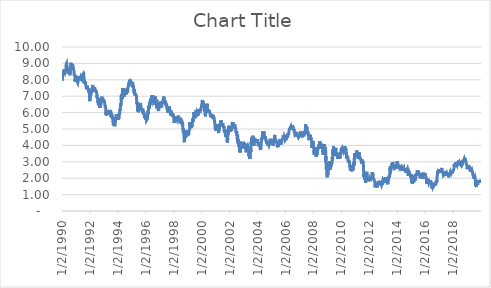
| Category | Series 0 |
|---|---|
| 12/31/19 | 1.918 |
| 12/30/19 | 1.879 |
| 12/27/19 | 1.875 |
| 12/26/19 | 1.894 |
| 12/24/19 | 1.9 |
| 12/23/19 | 1.929 |
| 12/20/19 | 1.917 |
| 12/19/19 | 1.92 |
| 12/18/19 | 1.917 |
| 12/17/19 | 1.88 |
| 12/16/19 | 1.871 |
| 12/13/19 | 1.823 |
| 12/12/19 | 1.892 |
| 12/11/19 | 1.791 |
| 12/10/19 | 1.842 |
| 12/9/19 | 1.819 |
| 12/6/19 | 1.836 |
| 12/5/19 | 1.81 |
| 12/4/19 | 1.774 |
| 12/3/19 | 1.716 |
| 12/2/19 | 1.819 |
| 11/29/19 | 1.776 |
| 11/27/19 | 1.765 |
| 11/26/19 | 1.741 |
| 11/25/19 | 1.755 |
| 11/22/19 | 1.771 |
| 11/21/19 | 1.772 |
| 11/20/19 | 1.745 |
| 11/19/19 | 1.783 |
| 11/18/19 | 1.815 |
| 11/15/19 | 1.831 |
| 11/14/19 | 1.819 |
| 11/13/19 | 1.886 |
| 11/12/19 | 1.935 |
| 11/8/19 | 1.942 |
| 11/7/19 | 1.917 |
| 11/6/19 | 1.828 |
| 11/5/19 | 1.858 |
| 11/4/19 | 1.777 |
| 11/1/19 | 1.71 |
| 10/31/19 | 1.691 |
| 10/30/19 | 1.772 |
| 10/29/19 | 1.838 |
| 10/28/19 | 1.842 |
| 10/25/19 | 1.794 |
| 10/24/19 | 1.766 |
| 10/23/19 | 1.764 |
| 10/22/19 | 1.761 |
| 10/21/19 | 1.799 |
| 10/18/19 | 1.754 |
| 10/17/19 | 1.752 |
| 10/16/19 | 1.74 |
| 10/15/19 | 1.771 |
| 10/11/19 | 1.729 |
| 10/10/19 | 1.668 |
| 10/9/19 | 1.584 |
| 10/8/19 | 1.529 |
| 10/7/19 | 1.558 |
| 10/4/19 | 1.529 |
| 10/3/19 | 1.534 |
| 10/2/19 | 1.599 |
| 10/1/19 | 1.635 |
| 9/30/19 | 1.665 |
| 9/27/19 | 1.68 |
| 9/26/19 | 1.692 |
| 9/25/19 | 1.737 |
| 9/24/19 | 1.646 |
| 9/23/19 | 1.727 |
| 9/20/19 | 1.722 |
| 9/19/19 | 1.784 |
| 9/18/19 | 1.796 |
| 9/17/19 | 1.801 |
| 9/16/19 | 1.847 |
| 9/13/19 | 1.896 |
| 9/12/19 | 1.772 |
| 9/11/19 | 1.738 |
| 9/10/19 | 1.732 |
| 9/9/19 | 1.644 |
| 9/6/19 | 1.56 |
| 9/5/19 | 1.559 |
| 9/4/19 | 1.466 |
| 9/3/19 | 1.457 |
| 8/30/19 | 1.496 |
| 8/29/19 | 1.494 |
| 8/28/19 | 1.479 |
| 8/27/19 | 1.471 |
| 8/26/19 | 1.535 |
| 8/23/19 | 1.535 |
| 8/22/19 | 1.613 |
| 8/21/19 | 1.589 |
| 8/20/19 | 1.556 |
| 8/19/19 | 1.606 |
| 8/16/19 | 1.554 |
| 8/15/19 | 1.527 |
| 8/14/19 | 1.579 |
| 8/13/19 | 1.704 |
| 8/12/19 | 1.645 |
| 8/9/19 | 1.745 |
| 8/8/19 | 1.717 |
| 8/7/19 | 1.734 |
| 8/6/19 | 1.702 |
| 8/5/19 | 1.708 |
| 8/2/19 | 1.845 |
| 8/1/19 | 1.894 |
| 7/31/19 | 2.014 |
| 7/30/19 | 2.058 |
| 7/29/19 | 2.065 |
| 7/26/19 | 2.07 |
| 7/25/19 | 2.081 |
| 7/24/19 | 2.043 |
| 7/23/19 | 2.081 |
| 7/22/19 | 2.046 |
| 7/19/19 | 2.055 |
| 7/18/19 | 2.024 |
| 7/17/19 | 2.045 |
| 7/16/19 | 2.103 |
| 7/15/19 | 2.089 |
| 7/12/19 | 2.122 |
| 7/11/19 | 2.138 |
| 7/10/19 | 2.061 |
| 7/9/19 | 2.065 |
| 7/8/19 | 2.048 |
| 7/5/19 | 2.034 |
| 7/3/19 | 1.95 |
| 7/2/19 | 1.974 |
| 7/1/19 | 2.024 |
| 6/28/19 | 2.005 |
| 6/27/19 | 2.014 |
| 6/26/19 | 2.047 |
| 6/25/19 | 1.985 |
| 6/24/19 | 2.014 |
| 6/21/19 | 2.054 |
| 6/20/19 | 2.028 |
| 6/19/19 | 2.023 |
| 6/18/19 | 2.06 |
| 6/17/19 | 2.094 |
| 6/14/19 | 2.08 |
| 6/13/19 | 2.094 |
| 6/12/19 | 2.12 |
| 6/11/19 | 2.143 |
| 6/10/19 | 2.148 |
| 6/7/19 | 2.081 |
| 6/6/19 | 2.117 |
| 6/5/19 | 2.135 |
| 6/4/19 | 2.13 |
| 6/3/19 | 2.071 |
| 5/31/19 | 2.125 |
| 5/30/19 | 2.213 |
| 5/29/19 | 2.26 |
| 5/28/19 | 2.266 |
| 5/24/19 | 2.32 |
| 5/23/19 | 2.318 |
| 5/22/19 | 2.382 |
| 5/21/19 | 2.426 |
| 5/20/19 | 2.416 |
| 5/17/19 | 2.391 |
| 5/16/19 | 2.394 |
| 5/15/19 | 2.373 |
| 5/14/19 | 2.41 |
| 5/13/19 | 2.402 |
| 5/10/19 | 2.467 |
| 5/9/19 | 2.442 |
| 5/8/19 | 2.484 |
| 5/7/19 | 2.457 |
| 5/6/19 | 2.469 |
| 5/3/19 | 2.525 |
| 5/2/19 | 2.541 |
| 5/1/19 | 2.5 |
| 4/30/19 | 2.502 |
| 4/29/19 | 2.525 |
| 4/26/19 | 2.498 |
| 4/25/19 | 2.532 |
| 4/24/19 | 2.518 |
| 4/23/19 | 2.565 |
| 4/22/19 | 2.588 |
| 4/18/19 | 2.56 |
| 4/17/19 | 2.594 |
| 4/16/19 | 2.59 |
| 4/15/19 | 2.554 |
| 4/12/19 | 2.565 |
| 4/11/19 | 2.497 |
| 4/10/19 | 2.465 |
| 4/9/19 | 2.501 |
| 4/8/19 | 2.522 |
| 4/5/19 | 2.495 |
| 4/4/19 | 2.515 |
| 4/3/19 | 2.524 |
| 4/2/19 | 2.474 |
| 4/1/19 | 2.501 |
| 3/29/19 | 2.405 |
| 3/28/19 | 2.395 |
| 3/27/19 | 2.366 |
| 3/26/19 | 2.423 |
| 3/25/19 | 2.398 |
| 3/22/19 | 2.439 |
| 3/21/19 | 2.537 |
| 3/20/19 | 2.526 |
| 3/19/19 | 2.612 |
| 3/18/19 | 2.603 |
| 3/15/19 | 2.587 |
| 3/14/19 | 2.63 |
| 3/13/19 | 2.621 |
| 3/12/19 | 2.602 |
| 3/11/19 | 2.639 |
| 3/8/19 | 2.628 |
| 3/7/19 | 2.639 |
| 3/6/19 | 2.693 |
| 3/5/19 | 2.717 |
| 3/4/19 | 2.722 |
| 3/1/19 | 2.753 |
| 2/28/19 | 2.715 |
| 2/27/19 | 2.682 |
| 2/26/19 | 2.636 |
| 2/25/19 | 2.663 |
| 2/22/19 | 2.652 |
| 2/21/19 | 2.691 |
| 2/20/19 | 2.645 |
| 2/19/19 | 2.634 |
| 2/15/19 | 2.663 |
| 2/14/19 | 2.654 |
| 2/13/19 | 2.702 |
| 2/12/19 | 2.688 |
| 2/11/19 | 2.654 |
| 2/8/19 | 2.634 |
| 2/7/19 | 2.657 |
| 2/6/19 | 2.695 |
| 2/5/19 | 2.698 |
| 2/4/19 | 2.724 |
| 2/1/19 | 2.684 |
| 1/31/19 | 2.629 |
| 1/30/19 | 2.678 |
| 1/29/19 | 2.71 |
| 1/28/19 | 2.744 |
| 1/25/19 | 2.758 |
| 1/24/19 | 2.716 |
| 1/23/19 | 2.741 |
| 1/22/19 | 2.739 |
| 1/18/19 | 2.784 |
| 1/17/19 | 2.75 |
| 1/16/19 | 2.722 |
| 1/15/19 | 2.711 |
| 1/14/19 | 2.702 |
| 1/11/19 | 2.701 |
| 1/10/19 | 2.742 |
| 1/9/19 | 2.71 |
| 1/8/19 | 2.728 |
| 1/7/19 | 2.696 |
| 1/4/19 | 2.668 |
| 1/3/19 | 2.554 |
| 1/2/19 | 2.62 |
| 12/31/18 | 2.684 |
| 12/28/18 | 2.718 |
| 12/27/18 | 2.767 |
| 12/26/18 | 2.808 |
| 12/24/18 | 2.738 |
| 12/21/18 | 2.79 |
| 12/20/18 | 2.806 |
| 12/19/18 | 2.755 |
| 12/18/18 | 2.818 |
| 12/17/18 | 2.857 |
| 12/14/18 | 2.89 |
| 12/13/18 | 2.913 |
| 12/12/18 | 2.91 |
| 12/11/18 | 2.879 |
| 12/10/18 | 2.858 |
| 12/7/18 | 2.845 |
| 12/6/18 | 2.896 |
| 12/5/18 | 2.914 |
| 12/4/18 | 2.914 |
| 12/3/18 | 2.97 |
| 11/30/18 | 2.988 |
| 11/29/18 | 3.03 |
| 11/28/18 | 3.059 |
| 11/27/18 | 3.057 |
| 11/26/18 | 3.054 |
| 11/23/18 | 3.039 |
| 11/21/18 | 3.063 |
| 11/20/18 | 3.063 |
| 11/19/18 | 3.063 |
| 11/16/18 | 3.063 |
| 11/15/18 | 3.11 |
| 11/14/18 | 3.125 |
| 11/13/18 | 3.14 |
| 11/9/18 | 3.182 |
| 11/8/18 | 3.237 |
| 11/7/18 | 3.236 |
| 11/6/18 | 3.228 |
| 11/5/18 | 3.201 |
| 11/2/18 | 3.212 |
| 11/1/18 | 3.13 |
| 10/31/18 | 3.144 |
| 10/30/18 | 3.123 |
| 10/29/18 | 3.085 |
| 10/26/18 | 3.076 |
| 10/25/18 | 3.117 |
| 10/24/18 | 3.104 |
| 10/23/18 | 3.168 |
| 10/22/18 | 3.198 |
| 10/19/18 | 3.192 |
| 10/18/18 | 3.179 |
| 10/17/18 | 3.205 |
| 10/16/18 | 3.163 |
| 10/15/18 | 3.156 |
| 10/12/18 | 3.161 |
| 10/11/18 | 3.15 |
| 10/10/18 | 3.163 |
| 10/9/18 | 3.206 |
| 10/5/18 | 3.233 |
| 10/4/18 | 3.187 |
| 10/3/18 | 3.181 |
| 10/2/18 | 3.063 |
| 10/1/18 | 3.084 |
| 9/28/18 | 3.061 |
| 9/27/18 | 3.052 |
| 9/26/18 | 3.048 |
| 9/25/18 | 3.096 |
| 9/24/18 | 3.089 |
| 9/21/18 | 3.063 |
| 9/20/18 | 3.063 |
| 9/19/18 | 3.063 |
| 9/18/18 | 3.055 |
| 9/17/18 | 2.987 |
| 9/14/18 | 2.996 |
| 9/13/18 | 2.97 |
| 9/12/18 | 2.963 |
| 9/11/18 | 2.976 |
| 9/10/18 | 2.931 |
| 9/7/18 | 2.939 |
| 9/6/18 | 2.873 |
| 9/5/18 | 2.902 |
| 9/4/18 | 2.898 |
| 8/31/18 | 2.86 |
| 8/30/18 | 2.855 |
| 8/29/18 | 2.884 |
| 8/28/18 | 2.88 |
| 8/27/18 | 2.846 |
| 8/24/18 | 2.81 |
| 8/23/18 | 2.826 |
| 8/22/18 | 2.819 |
| 8/21/18 | 2.83 |
| 8/20/18 | 2.819 |
| 8/17/18 | 2.86 |
| 8/16/18 | 2.866 |
| 8/15/18 | 2.862 |
| 8/14/18 | 2.898 |
| 8/13/18 | 2.879 |
| 8/10/18 | 2.873 |
| 8/9/18 | 2.926 |
| 8/8/18 | 2.96 |
| 8/7/18 | 2.973 |
| 8/6/18 | 2.94 |
| 8/3/18 | 2.949 |
| 8/2/18 | 2.986 |
| 8/1/18 | 3.006 |
| 7/31/18 | 2.96 |
| 7/30/18 | 2.973 |
| 7/27/18 | 2.954 |
| 7/26/18 | 2.976 |
| 7/25/18 | 2.975 |
| 7/24/18 | 2.949 |
| 7/23/18 | 2.954 |
| 7/20/18 | 2.893 |
| 7/19/18 | 2.838 |
| 7/18/18 | 2.869 |
| 7/17/18 | 2.86 |
| 7/16/18 | 2.858 |
| 7/13/18 | 2.827 |
| 7/12/18 | 2.845 |
| 7/11/18 | 2.849 |
| 7/10/18 | 2.849 |
| 7/9/18 | 2.856 |
| 7/6/18 | 2.822 |
| 7/5/18 | 2.829 |
| 7/3/18 | 2.831 |
| 7/2/18 | 2.871 |
| 6/29/18 | 2.86 |
| 6/28/18 | 2.836 |
| 6/27/18 | 2.826 |
| 6/26/18 | 2.877 |
| 6/25/18 | 2.88 |
| 6/22/18 | 2.895 |
| 6/21/18 | 2.897 |
| 6/20/18 | 2.939 |
| 6/19/18 | 2.897 |
| 6/18/18 | 2.917 |
| 6/15/18 | 2.92 |
| 6/14/18 | 2.935 |
| 6/13/18 | 2.966 |
| 6/12/18 | 2.961 |
| 6/11/18 | 2.952 |
| 6/8/18 | 2.946 |
| 6/7/18 | 2.92 |
| 6/6/18 | 2.972 |
| 6/5/18 | 2.928 |
| 6/4/18 | 2.942 |
| 6/1/18 | 2.902 |
| 5/31/18 | 2.859 |
| 5/30/18 | 2.855 |
| 5/29/18 | 2.781 |
| 5/25/18 | 2.931 |
| 5/24/18 | 2.977 |
| 5/23/18 | 2.994 |
| 5/22/18 | 3.06 |
| 5/21/18 | 3.06 |
| 5/18/18 | 3.056 |
| 5/17/18 | 3.111 |
| 5/16/18 | 3.096 |
| 5/15/18 | 3.072 |
| 5/14/18 | 3.002 |
| 5/11/18 | 2.97 |
| 5/10/18 | 2.962 |
| 5/9/18 | 3.004 |
| 5/8/18 | 2.976 |
| 5/7/18 | 2.95 |
| 5/4/18 | 2.95 |
| 5/3/18 | 2.946 |
| 5/2/18 | 2.966 |
| 5/1/18 | 2.964 |
| 4/30/18 | 2.953 |
| 4/27/18 | 2.957 |
| 4/26/18 | 2.981 |
| 4/25/18 | 3.026 |
| 4/24/18 | 3 |
| 4/23/18 | 2.975 |
| 4/20/18 | 2.96 |
| 4/19/18 | 2.91 |
| 4/18/18 | 2.873 |
| 4/17/18 | 2.828 |
| 4/16/18 | 2.827 |
| 4/13/18 | 2.827 |
| 4/12/18 | 2.836 |
| 4/11/18 | 2.781 |
| 4/10/18 | 2.801 |
| 4/9/18 | 2.779 |
| 4/6/18 | 2.774 |
| 4/5/18 | 2.832 |
| 4/4/18 | 2.803 |
| 4/3/18 | 2.775 |
| 4/2/18 | 2.73 |
| 3/29/18 | 2.739 |
| 3/28/18 | 2.781 |
| 3/27/18 | 2.775 |
| 3/26/18 | 2.852 |
| 3/23/18 | 2.814 |
| 3/22/18 | 2.824 |
| 3/21/18 | 2.883 |
| 3/20/18 | 2.896 |
| 3/19/18 | 2.856 |
| 3/16/18 | 2.844 |
| 3/15/18 | 2.828 |
| 3/14/18 | 2.817 |
| 3/13/18 | 2.843 |
| 3/12/18 | 2.868 |
| 3/9/18 | 2.894 |
| 3/8/18 | 2.857 |
| 3/7/18 | 2.883 |
| 3/6/18 | 2.886 |
| 3/5/18 | 2.881 |
| 3/2/18 | 2.864 |
| 3/1/18 | 2.808 |
| 2/28/18 | 2.861 |
| 2/27/18 | 2.893 |
| 2/26/18 | 2.862 |
| 2/23/18 | 2.866 |
| 2/22/18 | 2.921 |
| 2/21/18 | 2.95 |
| 2/20/18 | 2.89 |
| 2/16/18 | 2.875 |
| 2/15/18 | 2.91 |
| 2/14/18 | 2.902 |
| 2/13/18 | 2.829 |
| 2/12/18 | 2.858 |
| 2/9/18 | 2.851 |
| 2/8/18 | 2.824 |
| 2/7/18 | 2.836 |
| 2/6/18 | 2.802 |
| 2/5/18 | 2.706 |
| 2/2/18 | 2.841 |
| 2/1/18 | 2.79 |
| 1/31/18 | 2.705 |
| 1/30/18 | 2.72 |
| 1/29/18 | 2.694 |
| 1/26/18 | 2.66 |
| 1/25/18 | 2.617 |
| 1/24/18 | 2.646 |
| 1/23/18 | 2.613 |
| 1/22/18 | 2.65 |
| 1/19/18 | 2.659 |
| 1/18/18 | 2.626 |
| 1/17/18 | 2.59 |
| 1/16/18 | 2.537 |
| 1/12/18 | 2.546 |
| 1/11/18 | 2.537 |
| 1/10/18 | 2.557 |
| 1/9/18 | 2.553 |
| 1/8/18 | 2.48 |
| 1/5/18 | 2.476 |
| 1/4/18 | 2.452 |
| 1/3/18 | 2.447 |
| 1/2/18 | 2.463 |
| 12/29/17 | 2.405 |
| 12/28/17 | 2.43 |
| 12/27/17 | 2.411 |
| 12/26/17 | 2.476 |
| 12/22/17 | 2.481 |
| 12/21/17 | 2.483 |
| 12/20/17 | 2.497 |
| 12/19/17 | 2.464 |
| 12/18/17 | 2.394 |
| 12/15/17 | 2.353 |
| 12/14/17 | 2.349 |
| 12/13/17 | 2.342 |
| 12/12/17 | 2.401 |
| 12/11/17 | 2.389 |
| 12/8/17 | 2.376 |
| 12/7/17 | 2.363 |
| 12/6/17 | 2.338 |
| 12/5/17 | 2.351 |
| 12/4/17 | 2.372 |
| 12/1/17 | 2.362 |
| 11/30/17 | 2.41 |
| 11/29/17 | 2.388 |
| 11/28/17 | 2.328 |
| 11/27/17 | 2.328 |
| 11/24/17 | 2.342 |
| 11/22/17 | 2.319 |
| 11/21/17 | 2.356 |
| 11/20/17 | 2.367 |
| 11/17/17 | 2.344 |
| 11/16/17 | 2.375 |
| 11/15/17 | 2.322 |
| 11/14/17 | 2.372 |
| 11/13/17 | 2.406 |
| 11/10/17 | 2.398 |
| 11/9/17 | 2.342 |
| 11/8/17 | 2.334 |
| 11/7/17 | 2.314 |
| 11/6/17 | 2.316 |
| 11/3/17 | 2.332 |
| 11/2/17 | 2.345 |
| 11/1/17 | 2.372 |
| 10/31/17 | 2.379 |
| 10/30/17 | 2.368 |
| 10/27/17 | 2.406 |
| 10/26/17 | 2.461 |
| 10/25/17 | 2.432 |
| 10/24/17 | 2.419 |
| 10/23/17 | 2.366 |
| 10/20/17 | 2.384 |
| 10/19/17 | 2.318 |
| 10/18/17 | 2.346 |
| 10/17/17 | 2.3 |
| 10/16/17 | 2.303 |
| 10/13/17 | 2.273 |
| 10/12/17 | 2.318 |
| 10/11/17 | 2.348 |
| 10/10/17 | 2.361 |
| 10/6/17 | 2.359 |
| 10/5/17 | 2.348 |
| 10/4/17 | 2.323 |
| 10/3/17 | 2.323 |
| 10/2/17 | 2.341 |
| 9/29/17 | 2.334 |
| 9/28/17 | 2.308 |
| 9/27/17 | 2.31 |
| 9/26/17 | 2.236 |
| 9/25/17 | 2.22 |
| 9/22/17 | 2.25 |
| 9/21/17 | 2.276 |
| 9/20/17 | 2.268 |
| 9/19/17 | 2.245 |
| 9/18/17 | 2.229 |
| 9/15/17 | 2.202 |
| 9/14/17 | 2.185 |
| 9/13/17 | 2.188 |
| 9/12/17 | 2.167 |
| 9/11/17 | 2.131 |
| 9/8/17 | 2.051 |
| 9/7/17 | 2.039 |
| 9/6/17 | 2.105 |
| 9/5/17 | 2.06 |
| 9/1/17 | 2.166 |
| 8/31/17 | 2.117 |
| 8/30/17 | 2.131 |
| 8/29/17 | 2.129 |
| 8/28/17 | 2.157 |
| 8/25/17 | 2.166 |
| 8/24/17 | 2.194 |
| 8/23/17 | 2.166 |
| 8/22/17 | 2.213 |
| 8/21/17 | 2.182 |
| 8/18/17 | 2.194 |
| 8/17/17 | 2.185 |
| 8/16/17 | 2.222 |
| 8/15/17 | 2.273 |
| 8/14/17 | 2.218 |
| 8/11/17 | 2.189 |
| 8/10/17 | 2.198 |
| 8/9/17 | 2.248 |
| 8/8/17 | 2.262 |
| 8/7/17 | 2.253 |
| 8/4/17 | 2.262 |
| 8/3/17 | 2.221 |
| 8/2/17 | 2.271 |
| 8/1/17 | 2.253 |
| 7/31/17 | 2.294 |
| 7/28/17 | 2.289 |
| 7/27/17 | 2.31 |
| 7/26/17 | 2.287 |
| 7/25/17 | 2.335 |
| 7/24/17 | 2.255 |
| 7/21/17 | 2.238 |
| 7/20/17 | 2.259 |
| 7/19/17 | 2.27 |
| 7/18/17 | 2.259 |
| 7/17/17 | 2.314 |
| 7/14/17 | 2.332 |
| 7/13/17 | 2.344 |
| 7/12/17 | 2.318 |
| 7/11/17 | 2.36 |
| 7/10/17 | 2.373 |
| 7/7/17 | 2.386 |
| 7/6/17 | 2.366 |
| 7/5/17 | 2.323 |
| 7/3/17 | 2.35 |
| 6/30/17 | 2.304 |
| 6/29/17 | 2.267 |
| 6/28/17 | 2.228 |
| 6/27/17 | 2.205 |
| 6/26/17 | 2.137 |
| 6/23/17 | 2.142 |
| 6/22/17 | 2.148 |
| 6/21/17 | 2.163 |
| 6/20/17 | 2.156 |
| 6/19/17 | 2.188 |
| 6/16/17 | 2.151 |
| 6/15/17 | 2.164 |
| 6/14/17 | 2.126 |
| 6/13/17 | 2.211 |
| 6/12/17 | 2.214 |
| 6/9/17 | 2.2 |
| 6/8/17 | 2.188 |
| 6/7/17 | 2.173 |
| 6/6/17 | 2.145 |
| 6/5/17 | 2.182 |
| 6/2/17 | 2.159 |
| 6/1/17 | 2.211 |
| 5/31/17 | 2.203 |
| 5/30/17 | 2.21 |
| 5/26/17 | 2.246 |
| 5/25/17 | 2.255 |
| 5/24/17 | 2.25 |
| 5/23/17 | 2.28 |
| 5/22/17 | 2.254 |
| 5/19/17 | 2.235 |
| 5/18/17 | 2.229 |
| 5/17/17 | 2.224 |
| 5/16/17 | 2.326 |
| 5/15/17 | 2.343 |
| 5/12/17 | 2.326 |
| 5/11/17 | 2.387 |
| 5/10/17 | 2.414 |
| 5/9/17 | 2.398 |
| 5/8/17 | 2.387 |
| 5/5/17 | 2.349 |
| 5/4/17 | 2.354 |
| 5/3/17 | 2.318 |
| 5/2/17 | 2.28 |
| 5/1/17 | 2.318 |
| 4/28/17 | 2.28 |
| 4/27/17 | 2.295 |
| 4/26/17 | 2.304 |
| 4/25/17 | 2.332 |
| 4/24/17 | 2.273 |
| 4/21/17 | 2.248 |
| 4/20/17 | 2.232 |
| 4/19/17 | 2.214 |
| 4/18/17 | 2.168 |
| 4/17/17 | 2.25 |
| 4/13/17 | 2.237 |
| 4/12/17 | 2.239 |
| 4/11/17 | 2.296 |
| 4/10/17 | 2.366 |
| 4/7/17 | 2.382 |
| 4/6/17 | 2.341 |
| 4/5/17 | 2.335 |
| 4/4/17 | 2.36 |
| 4/3/17 | 2.319 |
| 3/31/17 | 2.387 |
| 3/30/17 | 2.42 |
| 3/29/17 | 2.376 |
| 3/28/17 | 2.418 |
| 3/27/17 | 2.378 |
| 3/24/17 | 2.412 |
| 3/23/17 | 2.419 |
| 3/22/17 | 2.405 |
| 3/21/17 | 2.418 |
| 3/20/17 | 2.461 |
| 3/17/17 | 2.5 |
| 3/16/17 | 2.54 |
| 3/15/17 | 2.493 |
| 3/14/17 | 2.6 |
| 3/13/17 | 2.626 |
| 3/10/17 | 2.574 |
| 3/9/17 | 2.605 |
| 3/8/17 | 2.56 |
| 3/7/17 | 2.518 |
| 3/6/17 | 2.5 |
| 3/3/17 | 2.478 |
| 3/2/17 | 2.478 |
| 3/1/17 | 2.453 |
| 2/28/17 | 2.39 |
| 2/27/17 | 2.365 |
| 2/24/17 | 2.312 |
| 2/23/17 | 2.372 |
| 2/22/17 | 2.413 |
| 2/21/17 | 2.429 |
| 2/17/17 | 2.415 |
| 2/16/17 | 2.447 |
| 2/15/17 | 2.493 |
| 2/14/17 | 2.47 |
| 2/13/17 | 2.436 |
| 2/10/17 | 2.407 |
| 2/9/17 | 2.395 |
| 2/8/17 | 2.336 |
| 2/7/17 | 2.393 |
| 2/6/17 | 2.408 |
| 2/3/17 | 2.465 |
| 2/2/17 | 2.474 |
| 2/1/17 | 2.47 |
| 1/31/17 | 2.453 |
| 1/30/17 | 2.488 |
| 1/27/17 | 2.484 |
| 1/26/17 | 2.504 |
| 1/25/17 | 2.512 |
| 1/24/17 | 2.465 |
| 1/23/17 | 2.397 |
| 1/20/17 | 2.467 |
| 1/19/17 | 2.474 |
| 1/18/17 | 2.43 |
| 1/17/17 | 2.325 |
| 1/13/17 | 2.396 |
| 1/12/17 | 2.363 |
| 1/11/17 | 2.372 |
| 1/10/17 | 2.376 |
| 1/9/17 | 2.365 |
| 1/6/17 | 2.419 |
| 1/5/17 | 2.344 |
| 1/4/17 | 2.439 |
| 1/3/17 | 2.444 |
| 12/30/16 | 2.444 |
| 12/29/16 | 2.475 |
| 12/28/16 | 2.508 |
| 12/27/16 | 2.56 |
| 12/23/16 | 2.537 |
| 12/22/16 | 2.552 |
| 12/21/16 | 2.535 |
| 12/20/16 | 2.559 |
| 12/19/16 | 2.538 |
| 12/16/16 | 2.592 |
| 12/15/16 | 2.597 |
| 12/14/16 | 2.571 |
| 12/13/16 | 2.471 |
| 12/12/16 | 2.471 |
| 12/9/16 | 2.468 |
| 12/8/16 | 2.407 |
| 12/7/16 | 2.34 |
| 12/6/16 | 2.389 |
| 12/5/16 | 2.394 |
| 12/2/16 | 2.383 |
| 12/1/16 | 2.448 |
| 11/30/16 | 2.381 |
| 11/29/16 | 2.291 |
| 11/28/16 | 2.312 |
| 11/25/16 | 2.357 |
| 11/23/16 | 2.35 |
| 11/22/16 | 2.312 |
| 11/21/16 | 2.315 |
| 11/18/16 | 2.355 |
| 11/17/16 | 2.303 |
| 11/16/16 | 2.222 |
| 11/15/16 | 2.219 |
| 11/14/16 | 2.261 |
| 11/10/16 | 2.15 |
| 11/9/16 | 2.057 |
| 11/8/16 | 1.855 |
| 11/7/16 | 1.826 |
| 11/4/16 | 1.776 |
| 11/3/16 | 1.812 |
| 11/2/16 | 1.802 |
| 11/1/16 | 1.827 |
| 10/31/16 | 1.826 |
| 10/28/16 | 1.847 |
| 10/27/16 | 1.854 |
| 10/26/16 | 1.793 |
| 10/25/16 | 1.756 |
| 10/24/16 | 1.765 |
| 10/21/16 | 1.735 |
| 10/20/16 | 1.756 |
| 10/19/16 | 1.743 |
| 10/18/16 | 1.738 |
| 10/17/16 | 1.766 |
| 10/14/16 | 1.798 |
| 10/13/16 | 1.741 |
| 10/12/16 | 1.769 |
| 10/11/16 | 1.764 |
| 10/7/16 | 1.718 |
| 10/6/16 | 1.737 |
| 10/5/16 | 1.702 |
| 10/4/16 | 1.686 |
| 10/3/16 | 1.622 |
| 9/30/16 | 1.594 |
| 9/29/16 | 1.56 |
| 9/28/16 | 1.572 |
| 9/27/16 | 1.556 |
| 9/26/16 | 1.584 |
| 9/23/16 | 1.618 |
| 9/22/16 | 1.618 |
| 9/21/16 | 1.651 |
| 9/20/16 | 1.689 |
| 9/19/16 | 1.712 |
| 9/16/16 | 1.693 |
| 9/15/16 | 1.691 |
| 9/14/16 | 1.698 |
| 9/13/16 | 1.727 |
| 9/12/16 | 1.663 |
| 9/9/16 | 1.675 |
| 9/8/16 | 1.599 |
| 9/7/16 | 1.539 |
| 9/6/16 | 1.534 |
| 9/2/16 | 1.602 |
| 9/1/16 | 1.568 |
| 8/31/16 | 1.58 |
| 8/30/16 | 1.566 |
| 8/29/16 | 1.56 |
| 8/26/16 | 1.63 |
| 8/25/16 | 1.573 |
| 8/24/16 | 1.561 |
| 8/23/16 | 1.546 |
| 8/22/16 | 1.542 |
| 8/19/16 | 1.578 |
| 8/18/16 | 1.536 |
| 8/17/16 | 1.549 |
| 8/16/16 | 1.575 |
| 8/15/16 | 1.558 |
| 8/12/16 | 1.514 |
| 8/11/16 | 1.559 |
| 8/10/16 | 1.507 |
| 8/9/16 | 1.547 |
| 8/8/16 | 1.592 |
| 8/5/16 | 1.588 |
| 8/4/16 | 1.501 |
| 8/3/16 | 1.542 |
| 8/2/16 | 1.556 |
| 8/1/16 | 1.521 |
| 7/29/16 | 1.453 |
| 7/28/16 | 1.504 |
| 7/27/16 | 1.498 |
| 7/26/16 | 1.561 |
| 7/25/16 | 1.573 |
| 7/22/16 | 1.566 |
| 7/21/16 | 1.556 |
| 7/20/16 | 1.58 |
| 7/19/16 | 1.553 |
| 7/18/16 | 1.582 |
| 7/15/16 | 1.551 |
| 7/14/16 | 1.536 |
| 7/13/16 | 1.474 |
| 7/12/16 | 1.51 |
| 7/11/16 | 1.43 |
| 7/8/16 | 1.358 |
| 7/7/16 | 1.385 |
| 7/6/16 | 1.368 |
| 7/5/16 | 1.375 |
| 7/1/16 | 1.444 |
| 6/30/16 | 1.47 |
| 6/29/16 | 1.516 |
| 6/28/16 | 1.466 |
| 6/27/16 | 1.438 |
| 6/24/16 | 1.56 |
| 6/23/16 | 1.746 |
| 6/22/16 | 1.685 |
| 6/21/16 | 1.706 |
| 6/20/16 | 1.689 |
| 6/17/16 | 1.608 |
| 6/16/16 | 1.579 |
| 6/15/16 | 1.572 |
| 6/14/16 | 1.613 |
| 6/13/16 | 1.61 |
| 6/10/16 | 1.64 |
| 6/9/16 | 1.687 |
| 6/8/16 | 1.702 |
| 6/7/16 | 1.718 |
| 6/6/16 | 1.737 |
| 6/3/16 | 1.7 |
| 6/2/16 | 1.799 |
| 6/1/16 | 1.835 |
| 5/31/16 | 1.846 |
| 5/27/16 | 1.851 |
| 5/26/16 | 1.828 |
| 5/25/16 | 1.866 |
| 5/24/16 | 1.863 |
| 5/23/16 | 1.835 |
| 5/20/16 | 1.838 |
| 5/19/16 | 1.849 |
| 5/18/16 | 1.854 |
| 5/17/16 | 1.772 |
| 5/16/16 | 1.753 |
| 5/13/16 | 1.7 |
| 5/12/16 | 1.752 |
| 5/11/16 | 1.737 |
| 5/10/16 | 1.761 |
| 5/9/16 | 1.751 |
| 5/6/16 | 1.779 |
| 5/5/16 | 1.745 |
| 5/4/16 | 1.775 |
| 5/3/16 | 1.796 |
| 5/2/16 | 1.872 |
| 4/29/16 | 1.833 |
| 4/28/16 | 1.824 |
| 4/27/16 | 1.851 |
| 4/26/16 | 1.927 |
| 4/25/16 | 1.913 |
| 4/22/16 | 1.888 |
| 4/21/16 | 1.861 |
| 4/20/16 | 1.845 |
| 4/19/16 | 1.785 |
| 4/18/16 | 1.771 |
| 4/15/16 | 1.752 |
| 4/14/16 | 1.792 |
| 4/13/16 | 1.764 |
| 4/12/16 | 1.776 |
| 4/11/16 | 1.725 |
| 4/8/16 | 1.717 |
| 4/7/16 | 1.689 |
| 4/6/16 | 1.755 |
| 4/5/16 | 1.72 |
| 4/4/16 | 1.762 |
| 4/1/16 | 1.77 |
| 3/31/16 | 1.769 |
| 3/30/16 | 1.823 |
| 3/29/16 | 1.804 |
| 3/28/16 | 1.886 |
| 3/24/16 | 1.9 |
| 3/23/16 | 1.879 |
| 3/22/16 | 1.94 |
| 3/21/16 | 1.916 |
| 3/18/16 | 1.873 |
| 3/17/16 | 1.896 |
| 3/16/16 | 1.908 |
| 3/15/16 | 1.97 |
| 3/14/16 | 1.959 |
| 3/11/16 | 1.984 |
| 3/10/16 | 1.932 |
| 3/9/16 | 1.876 |
| 3/8/16 | 1.829 |
| 3/7/16 | 1.906 |
| 3/4/16 | 1.874 |
| 3/3/16 | 1.834 |
| 3/2/16 | 1.841 |
| 3/1/16 | 1.825 |
| 2/29/16 | 1.735 |
| 2/26/16 | 1.762 |
| 2/25/16 | 1.716 |
| 2/24/16 | 1.748 |
| 2/23/16 | 1.722 |
| 2/22/16 | 1.752 |
| 2/19/16 | 1.745 |
| 2/18/16 | 1.74 |
| 2/17/16 | 1.819 |
| 2/16/16 | 1.772 |
| 2/12/16 | 1.748 |
| 2/11/16 | 1.659 |
| 2/10/16 | 1.668 |
| 2/9/16 | 1.726 |
| 2/8/16 | 1.748 |
| 2/5/16 | 1.836 |
| 2/4/16 | 1.84 |
| 2/3/16 | 1.886 |
| 2/2/16 | 1.845 |
| 2/1/16 | 1.949 |
| 1/29/16 | 1.921 |
| 1/28/16 | 1.978 |
| 1/27/16 | 1.999 |
| 1/26/16 | 1.994 |
| 1/25/16 | 2.001 |
| 1/22/16 | 2.052 |
| 1/21/16 | 2.031 |
| 1/20/16 | 1.982 |
| 1/19/16 | 2.056 |
| 1/15/16 | 2.035 |
| 1/14/16 | 2.087 |
| 1/13/16 | 2.093 |
| 1/12/16 | 2.103 |
| 1/11/16 | 2.175 |
| 1/8/16 | 2.116 |
| 1/7/16 | 2.146 |
| 1/6/16 | 2.17 |
| 1/5/16 | 2.236 |
| 1/4/16 | 2.243 |
| 12/31/15 | 2.269 |
| 12/30/15 | 2.294 |
| 12/29/15 | 2.305 |
| 12/28/15 | 2.23 |
| 12/24/15 | 2.241 |
| 12/23/15 | 2.253 |
| 12/22/15 | 2.236 |
| 12/21/15 | 2.192 |
| 12/18/15 | 2.204 |
| 12/17/15 | 2.223 |
| 12/16/15 | 2.296 |
| 12/15/15 | 2.266 |
| 12/14/15 | 2.222 |
| 12/11/15 | 2.127 |
| 12/10/15 | 2.23 |
| 12/9/15 | 2.216 |
| 12/8/15 | 2.218 |
| 12/7/15 | 2.229 |
| 12/4/15 | 2.269 |
| 12/3/15 | 2.314 |
| 12/2/15 | 2.18 |
| 12/1/15 | 2.143 |
| 11/30/15 | 2.206 |
| 11/27/15 | 2.22 |
| 11/25/15 | 2.234 |
| 11/24/15 | 2.238 |
| 11/23/15 | 2.238 |
| 11/20/15 | 2.262 |
| 11/19/15 | 2.248 |
| 11/18/15 | 2.273 |
| 11/17/15 | 2.266 |
| 11/16/15 | 2.268 |
| 11/13/15 | 2.266 |
| 11/12/15 | 2.312 |
| 11/10/15 | 2.342 |
| 11/9/15 | 2.344 |
| 11/6/15 | 2.325 |
| 11/5/15 | 2.232 |
| 11/4/15 | 2.225 |
| 11/3/15 | 2.21 |
| 11/2/15 | 2.171 |
| 10/30/15 | 2.142 |
| 10/29/15 | 2.172 |
| 10/28/15 | 2.101 |
| 10/27/15 | 2.037 |
| 10/26/15 | 2.056 |
| 10/23/15 | 2.087 |
| 10/22/15 | 2.026 |
| 10/21/15 | 2.023 |
| 10/20/15 | 2.067 |
| 10/19/15 | 2.023 |
| 10/16/15 | 2.033 |
| 10/15/15 | 2.018 |
| 10/14/15 | 1.972 |
| 10/13/15 | 2.044 |
| 10/9/15 | 2.088 |
| 10/8/15 | 2.104 |
| 10/7/15 | 2.067 |
| 10/6/15 | 2.031 |
| 10/5/15 | 2.056 |
| 10/2/15 | 1.993 |
| 10/1/15 | 2.037 |
| 9/30/15 | 2.037 |
| 9/29/15 | 2.051 |
| 9/28/15 | 2.095 |
| 9/25/15 | 2.162 |
| 9/24/15 | 2.127 |
| 9/23/15 | 2.15 |
| 9/22/15 | 2.134 |
| 9/21/15 | 2.201 |
| 9/18/15 | 2.134 |
| 9/17/15 | 2.19 |
| 9/16/15 | 2.294 |
| 9/15/15 | 2.287 |
| 9/14/15 | 2.183 |
| 9/11/15 | 2.188 |
| 9/10/15 | 2.222 |
| 9/9/15 | 2.201 |
| 9/8/15 | 2.183 |
| 9/4/15 | 2.124 |
| 9/3/15 | 2.16 |
| 9/2/15 | 2.184 |
| 9/1/15 | 2.152 |
| 8/31/15 | 2.218 |
| 8/28/15 | 2.181 |
| 8/27/15 | 2.184 |
| 8/26/15 | 2.175 |
| 8/25/15 | 2.071 |
| 8/24/15 | 2.003 |
| 8/21/15 | 2.037 |
| 8/20/15 | 2.068 |
| 8/19/15 | 2.126 |
| 8/18/15 | 2.192 |
| 8/17/15 | 2.168 |
| 8/14/15 | 2.198 |
| 8/13/15 | 2.185 |
| 8/12/15 | 2.148 |
| 8/11/15 | 2.141 |
| 8/10/15 | 2.227 |
| 8/7/15 | 2.162 |
| 8/6/15 | 2.221 |
| 8/5/15 | 2.27 |
| 8/4/15 | 2.221 |
| 8/3/15 | 2.148 |
| 7/31/15 | 2.18 |
| 7/30/15 | 2.259 |
| 7/29/15 | 2.286 |
| 7/28/15 | 2.25 |
| 7/27/15 | 2.218 |
| 7/24/15 | 2.262 |
| 7/23/15 | 2.268 |
| 7/22/15 | 2.324 |
| 7/21/15 | 2.325 |
| 7/20/15 | 2.372 |
| 7/17/15 | 2.347 |
| 7/16/15 | 2.35 |
| 7/15/15 | 2.352 |
| 7/14/15 | 2.401 |
| 7/13/15 | 2.454 |
| 7/10/15 | 2.397 |
| 7/9/15 | 2.321 |
| 7/8/15 | 2.192 |
| 7/7/15 | 2.258 |
| 7/6/15 | 2.285 |
| 7/2/15 | 2.382 |
| 7/1/15 | 2.422 |
| 6/30/15 | 2.353 |
| 6/29/15 | 2.324 |
| 6/26/15 | 2.473 |
| 6/25/15 | 2.409 |
| 6/24/15 | 2.367 |
| 6/23/15 | 2.409 |
| 6/22/15 | 2.372 |
| 6/19/15 | 2.258 |
| 6/18/15 | 2.334 |
| 6/17/15 | 2.316 |
| 6/16/15 | 2.309 |
| 6/15/15 | 2.356 |
| 6/12/15 | 2.392 |
| 6/11/15 | 2.377 |
| 6/10/15 | 2.484 |
| 6/9/15 | 2.438 |
| 6/8/15 | 2.382 |
| 6/5/15 | 2.408 |
| 6/4/15 | 2.307 |
| 6/3/15 | 2.364 |
| 6/2/15 | 2.262 |
| 6/1/15 | 2.179 |
| 5/29/15 | 2.121 |
| 5/28/15 | 2.136 |
| 5/27/15 | 2.128 |
| 5/26/15 | 2.139 |
| 5/22/15 | 2.209 |
| 5/21/15 | 2.19 |
| 5/20/15 | 2.248 |
| 5/19/15 | 2.289 |
| 5/18/15 | 2.234 |
| 5/15/15 | 2.142 |
| 5/14/15 | 2.23 |
| 5/13/15 | 2.293 |
| 5/12/15 | 2.249 |
| 5/11/15 | 2.28 |
| 5/8/15 | 2.148 |
| 5/7/15 | 2.18 |
| 5/6/15 | 2.243 |
| 5/5/15 | 2.185 |
| 5/4/15 | 2.144 |
| 5/1/15 | 2.114 |
| 4/30/15 | 2.032 |
| 4/29/15 | 2.039 |
| 4/28/15 | 2.003 |
| 4/27/15 | 1.921 |
| 4/24/15 | 1.909 |
| 4/23/15 | 1.958 |
| 4/22/15 | 1.979 |
| 4/21/15 | 1.909 |
| 4/20/15 | 1.89 |
| 4/17/15 | 1.865 |
| 4/16/15 | 1.89 |
| 4/15/15 | 1.888 |
| 4/14/15 | 1.898 |
| 4/13/15 | 1.927 |
| 4/10/15 | 1.947 |
| 4/9/15 | 1.96 |
| 4/8/15 | 1.905 |
| 4/7/15 | 1.885 |
| 4/6/15 | 1.895 |
| 4/2/15 | 1.912 |
| 4/1/15 | 1.857 |
| 3/31/15 | 1.923 |
| 3/30/15 | 1.948 |
| 3/27/15 | 1.962 |
| 3/26/15 | 1.989 |
| 3/25/15 | 1.925 |
| 3/24/15 | 1.873 |
| 3/23/15 | 1.912 |
| 3/20/15 | 1.93 |
| 3/19/15 | 1.968 |
| 3/18/15 | 1.92 |
| 3/17/15 | 2.051 |
| 3/16/15 | 2.072 |
| 3/13/15 | 2.114 |
| 3/12/15 | 2.116 |
| 3/11/15 | 2.109 |
| 3/10/15 | 2.13 |
| 3/9/15 | 2.191 |
| 3/6/15 | 2.241 |
| 3/5/15 | 2.115 |
| 3/4/15 | 2.117 |
| 3/3/15 | 2.119 |
| 3/2/15 | 2.082 |
| 2/27/15 | 1.993 |
| 2/26/15 | 2.03 |
| 2/25/15 | 1.969 |
| 2/24/15 | 1.98 |
| 2/23/15 | 2.057 |
| 2/20/15 | 2.112 |
| 2/19/15 | 2.114 |
| 2/18/15 | 2.08 |
| 2/17/15 | 2.138 |
| 2/13/15 | 2.05 |
| 2/12/15 | 1.984 |
| 2/11/15 | 2.018 |
| 2/10/15 | 1.997 |
| 2/9/15 | 1.978 |
| 2/6/15 | 1.957 |
| 2/5/15 | 1.82 |
| 2/4/15 | 1.751 |
| 2/3/15 | 1.792 |
| 2/2/15 | 1.664 |
| 1/30/15 | 1.641 |
| 1/29/15 | 1.751 |
| 1/28/15 | 1.721 |
| 1/27/15 | 1.823 |
| 1/26/15 | 1.824 |
| 1/23/15 | 1.797 |
| 1/22/15 | 1.863 |
| 1/21/15 | 1.872 |
| 1/20/15 | 1.788 |
| 1/16/15 | 1.837 |
| 1/15/15 | 1.715 |
| 1/14/15 | 1.855 |
| 1/13/15 | 1.9 |
| 1/12/15 | 1.907 |
| 1/9/15 | 1.945 |
| 1/8/15 | 2.018 |
| 1/7/15 | 1.968 |
| 1/6/15 | 1.94 |
| 1/5/15 | 2.032 |
| 1/2/15 | 2.11 |
| 12/31/14 | 2.171 |
| 12/30/14 | 2.187 |
| 12/29/14 | 2.202 |
| 12/26/14 | 2.25 |
| 12/24/14 | 2.263 |
| 12/23/14 | 2.261 |
| 12/22/14 | 2.158 |
| 12/19/14 | 2.162 |
| 12/18/14 | 2.208 |
| 12/17/14 | 2.136 |
| 12/16/14 | 2.059 |
| 12/15/14 | 2.118 |
| 12/12/14 | 2.082 |
| 12/11/14 | 2.162 |
| 12/10/14 | 2.164 |
| 12/9/14 | 2.213 |
| 12/8/14 | 2.257 |
| 12/5/14 | 2.306 |
| 12/4/14 | 2.234 |
| 12/3/14 | 2.28 |
| 12/2/14 | 2.292 |
| 12/1/14 | 2.235 |
| 11/28/14 | 2.164 |
| 11/26/14 | 2.245 |
| 11/25/14 | 2.257 |
| 11/24/14 | 2.306 |
| 11/21/14 | 2.31 |
| 11/20/14 | 2.337 |
| 11/19/14 | 2.359 |
| 11/18/14 | 2.315 |
| 11/17/14 | 2.34 |
| 11/14/14 | 2.32 |
| 11/13/14 | 2.34 |
| 11/12/14 | 2.371 |
| 11/10/14 | 2.36 |
| 11/7/14 | 2.298 |
| 11/6/14 | 2.386 |
| 11/5/14 | 2.342 |
| 11/4/14 | 2.334 |
| 11/3/14 | 2.342 |
| 10/31/14 | 2.335 |
| 10/30/14 | 2.306 |
| 10/29/14 | 2.317 |
| 10/28/14 | 2.296 |
| 10/27/14 | 2.26 |
| 10/24/14 | 2.268 |
| 10/23/14 | 2.271 |
| 10/22/14 | 2.216 |
| 10/21/14 | 2.222 |
| 10/20/14 | 2.191 |
| 10/17/14 | 2.194 |
| 10/16/14 | 2.156 |
| 10/15/14 | 2.136 |
| 10/14/14 | 2.197 |
| 10/10/14 | 2.28 |
| 10/9/14 | 2.313 |
| 10/8/14 | 2.321 |
| 10/7/14 | 2.339 |
| 10/6/14 | 2.42 |
| 10/3/14 | 2.434 |
| 10/2/14 | 2.425 |
| 10/1/14 | 2.386 |
| 9/30/14 | 2.489 |
| 9/29/14 | 2.477 |
| 9/26/14 | 2.528 |
| 9/25/14 | 2.502 |
| 9/24/14 | 2.564 |
| 9/23/14 | 2.528 |
| 9/22/14 | 2.564 |
| 9/19/14 | 2.574 |
| 9/18/14 | 2.614 |
| 9/17/14 | 2.62 |
| 9/16/14 | 2.592 |
| 9/15/14 | 2.589 |
| 9/12/14 | 2.61 |
| 9/11/14 | 2.55 |
| 9/10/14 | 2.541 |
| 9/9/14 | 2.504 |
| 9/8/14 | 2.471 |
| 9/5/14 | 2.459 |
| 9/4/14 | 2.45 |
| 9/3/14 | 2.396 |
| 9/2/14 | 2.421 |
| 8/29/14 | 2.343 |
| 8/28/14 | 2.336 |
| 8/27/14 | 2.357 |
| 8/26/14 | 2.396 |
| 8/25/14 | 2.382 |
| 8/22/14 | 2.402 |
| 8/21/14 | 2.407 |
| 8/20/14 | 2.426 |
| 8/19/14 | 2.4 |
| 8/18/14 | 2.393 |
| 8/15/14 | 2.34 |
| 8/14/14 | 2.402 |
| 8/13/14 | 2.417 |
| 8/12/14 | 2.449 |
| 8/11/14 | 2.428 |
| 8/8/14 | 2.42 |
| 8/7/14 | 2.411 |
| 8/6/14 | 2.471 |
| 8/5/14 | 2.484 |
| 8/4/14 | 2.482 |
| 8/1/14 | 2.492 |
| 7/31/14 | 2.558 |
| 7/30/14 | 2.557 |
| 7/29/14 | 2.46 |
| 7/28/14 | 2.485 |
| 7/25/14 | 2.466 |
| 7/24/14 | 2.502 |
| 7/23/14 | 2.466 |
| 7/22/14 | 2.46 |
| 7/21/14 | 2.467 |
| 7/18/14 | 2.481 |
| 7/17/14 | 2.446 |
| 7/16/14 | 2.526 |
| 7/15/14 | 2.547 |
| 7/14/14 | 2.547 |
| 7/11/14 | 2.516 |
| 7/10/14 | 2.536 |
| 7/9/14 | 2.55 |
| 7/8/14 | 2.556 |
| 7/7/14 | 2.611 |
| 7/3/14 | 2.638 |
| 7/2/14 | 2.626 |
| 7/1/14 | 2.565 |
| 6/30/14 | 2.53 |
| 6/27/14 | 2.534 |
| 6/26/14 | 2.529 |
| 6/25/14 | 2.559 |
| 6/24/14 | 2.578 |
| 6/23/14 | 2.626 |
| 6/20/14 | 2.605 |
| 6/19/14 | 2.621 |
| 6/18/14 | 2.584 |
| 6/17/14 | 2.652 |
| 6/16/14 | 2.597 |
| 6/13/14 | 2.603 |
| 6/12/14 | 2.595 |
| 6/11/14 | 2.639 |
| 6/10/14 | 2.644 |
| 6/9/14 | 2.603 |
| 6/6/14 | 2.587 |
| 6/5/14 | 2.582 |
| 6/4/14 | 2.602 |
| 6/3/14 | 2.598 |
| 6/2/14 | 2.527 |
| 5/30/14 | 2.476 |
| 5/29/14 | 2.464 |
| 5/28/14 | 2.443 |
| 5/27/14 | 2.514 |
| 5/23/14 | 2.532 |
| 5/22/14 | 2.55 |
| 5/21/14 | 2.532 |
| 5/20/14 | 2.511 |
| 5/19/14 | 2.544 |
| 5/16/14 | 2.523 |
| 5/15/14 | 2.489 |
| 5/14/14 | 2.543 |
| 5/13/14 | 2.609 |
| 5/12/14 | 2.661 |
| 5/9/14 | 2.623 |
| 5/8/14 | 2.616 |
| 5/7/14 | 2.588 |
| 5/6/14 | 2.591 |
| 5/5/14 | 2.607 |
| 5/2/14 | 2.584 |
| 5/1/14 | 2.613 |
| 4/30/14 | 2.646 |
| 4/29/14 | 2.691 |
| 4/28/14 | 2.7 |
| 4/25/14 | 2.662 |
| 4/24/14 | 2.68 |
| 4/23/14 | 2.699 |
| 4/22/14 | 2.71 |
| 4/21/14 | 2.715 |
| 4/17/14 | 2.722 |
| 4/16/14 | 2.628 |
| 4/15/14 | 2.628 |
| 4/14/14 | 2.647 |
| 4/11/14 | 2.625 |
| 4/10/14 | 2.647 |
| 4/9/14 | 2.69 |
| 4/8/14 | 2.681 |
| 4/7/14 | 2.7 |
| 4/4/14 | 2.721 |
| 4/3/14 | 2.797 |
| 4/2/14 | 2.804 |
| 4/1/14 | 2.752 |
| 3/31/14 | 2.718 |
| 3/28/14 | 2.721 |
| 3/27/14 | 2.681 |
| 3/26/14 | 2.692 |
| 3/25/14 | 2.748 |
| 3/24/14 | 2.728 |
| 3/21/14 | 2.743 |
| 3/20/14 | 2.772 |
| 3/19/14 | 2.772 |
| 3/18/14 | 2.672 |
| 3/17/14 | 2.692 |
| 3/14/14 | 2.654 |
| 3/13/14 | 2.645 |
| 3/12/14 | 2.73 |
| 3/11/14 | 2.768 |
| 3/10/14 | 2.777 |
| 3/7/14 | 2.788 |
| 3/6/14 | 2.737 |
| 3/5/14 | 2.705 |
| 3/4/14 | 2.698 |
| 3/3/14 | 2.601 |
| 2/28/14 | 2.648 |
| 2/27/14 | 2.639 |
| 2/26/14 | 2.666 |
| 2/25/14 | 2.702 |
| 2/24/14 | 2.738 |
| 2/21/14 | 2.731 |
| 2/20/14 | 2.751 |
| 2/19/14 | 2.739 |
| 2/18/14 | 2.707 |
| 2/14/14 | 2.743 |
| 2/13/14 | 2.732 |
| 2/12/14 | 2.761 |
| 2/11/14 | 2.725 |
| 2/10/14 | 2.667 |
| 2/7/14 | 2.683 |
| 2/6/14 | 2.7 |
| 2/5/14 | 2.668 |
| 2/4/14 | 2.629 |
| 2/3/14 | 2.576 |
| 1/31/14 | 2.644 |
| 1/30/14 | 2.695 |
| 1/29/14 | 2.677 |
| 1/28/14 | 2.749 |
| 1/27/14 | 2.748 |
| 1/24/14 | 2.715 |
| 1/23/14 | 2.777 |
| 1/22/14 | 2.866 |
| 1/21/14 | 2.829 |
| 1/17/14 | 2.819 |
| 1/16/14 | 2.841 |
| 1/15/14 | 2.891 |
| 1/14/14 | 2.871 |
| 1/13/14 | 2.826 |
| 1/10/14 | 2.858 |
| 1/9/14 | 2.965 |
| 1/8/14 | 2.989 |
| 1/7/14 | 2.939 |
| 1/6/14 | 2.958 |
| 1/3/14 | 2.995 |
| 1/2/14 | 2.989 |
| 12/31/13 | 3.028 |
| 12/30/13 | 2.97 |
| 12/27/13 | 3 |
| 12/26/13 | 2.99 |
| 12/24/13 | 2.978 |
| 12/23/13 | 2.927 |
| 12/20/13 | 2.889 |
| 12/19/13 | 2.929 |
| 12/18/13 | 2.893 |
| 12/17/13 | 2.835 |
| 12/16/13 | 2.878 |
| 12/13/13 | 2.865 |
| 12/12/13 | 2.877 |
| 12/11/13 | 2.854 |
| 12/10/13 | 2.801 |
| 12/9/13 | 2.839 |
| 12/6/13 | 2.855 |
| 12/5/13 | 2.872 |
| 12/4/13 | 2.834 |
| 12/3/13 | 2.782 |
| 12/2/13 | 2.795 |
| 11/29/13 | 2.744 |
| 11/27/13 | 2.737 |
| 11/26/13 | 2.708 |
| 11/25/13 | 2.728 |
| 11/22/13 | 2.743 |
| 11/21/13 | 2.784 |
| 11/20/13 | 2.799 |
| 11/19/13 | 2.707 |
| 11/18/13 | 2.666 |
| 11/15/13 | 2.703 |
| 11/14/13 | 2.69 |
| 11/13/13 | 2.7 |
| 11/12/13 | 2.773 |
| 11/8/13 | 2.748 |
| 11/7/13 | 2.6 |
| 11/6/13 | 2.642 |
| 11/5/13 | 2.67 |
| 11/4/13 | 2.604 |
| 11/1/13 | 2.622 |
| 10/31/13 | 2.554 |
| 10/30/13 | 2.538 |
| 10/29/13 | 2.503 |
| 10/28/13 | 2.523 |
| 10/25/13 | 2.509 |
| 10/24/13 | 2.52 |
| 10/23/13 | 2.502 |
| 10/22/13 | 2.512 |
| 10/21/13 | 2.601 |
| 10/18/13 | 2.578 |
| 10/17/13 | 2.589 |
| 10/16/13 | 2.663 |
| 10/15/13 | 2.728 |
| 10/11/13 | 2.687 |
| 10/10/13 | 2.681 |
| 10/9/13 | 2.663 |
| 10/8/13 | 2.632 |
| 10/7/13 | 2.626 |
| 10/4/13 | 2.645 |
| 10/3/13 | 2.605 |
| 10/2/13 | 2.617 |
| 10/1/13 | 2.65 |
| 9/30/13 | 2.61 |
| 9/27/13 | 2.624 |
| 9/26/13 | 2.65 |
| 9/25/13 | 2.628 |
| 9/24/13 | 2.655 |
| 9/23/13 | 2.7 |
| 9/20/13 | 2.734 |
| 9/19/13 | 2.752 |
| 9/18/13 | 2.688 |
| 9/17/13 | 2.847 |
| 9/16/13 | 2.864 |
| 9/13/13 | 2.885 |
| 9/12/13 | 2.91 |
| 9/11/13 | 2.912 |
| 9/10/13 | 2.964 |
| 9/9/13 | 2.912 |
| 9/6/13 | 2.934 |
| 9/5/13 | 2.994 |
| 9/4/13 | 2.897 |
| 9/3/13 | 2.858 |
| 8/30/13 | 2.784 |
| 8/29/13 | 2.762 |
| 8/28/13 | 2.765 |
| 8/27/13 | 2.709 |
| 8/26/13 | 2.785 |
| 8/23/13 | 2.815 |
| 8/22/13 | 2.884 |
| 8/21/13 | 2.894 |
| 8/20/13 | 2.814 |
| 8/19/13 | 2.88 |
| 8/16/13 | 2.825 |
| 8/15/13 | 2.766 |
| 8/14/13 | 2.714 |
| 8/13/13 | 2.719 |
| 8/12/13 | 2.621 |
| 8/9/13 | 2.578 |
| 8/8/13 | 2.589 |
| 8/7/13 | 2.599 |
| 8/6/13 | 2.642 |
| 8/5/13 | 2.633 |
| 8/2/13 | 2.596 |
| 8/1/13 | 2.706 |
| 7/31/13 | 2.576 |
| 7/30/13 | 2.61 |
| 7/29/13 | 2.602 |
| 7/26/13 | 2.562 |
| 7/25/13 | 2.571 |
| 7/24/13 | 2.588 |
| 7/23/13 | 2.505 |
| 7/22/13 | 2.48 |
| 7/19/13 | 2.484 |
| 7/18/13 | 2.528 |
| 7/17/13 | 2.489 |
| 7/16/13 | 2.532 |
| 7/15/13 | 2.537 |
| 7/12/13 | 2.582 |
| 7/11/13 | 2.572 |
| 7/10/13 | 2.624 |
| 7/9/13 | 2.634 |
| 7/8/13 | 2.636 |
| 7/5/13 | 2.739 |
| 7/3/13 | 2.503 |
| 7/2/13 | 2.469 |
| 7/1/13 | 2.476 |
| 6/28/13 | 2.486 |
| 6/27/13 | 2.472 |
| 6/26/13 | 2.535 |
| 6/25/13 | 2.608 |
| 6/24/13 | 2.537 |
| 6/21/13 | 2.531 |
| 6/20/13 | 2.414 |
| 6/19/13 | 2.353 |
| 6/18/13 | 2.185 |
| 6/17/13 | 2.182 |
| 6/14/13 | 2.13 |
| 6/13/13 | 2.149 |
| 6/12/13 | 2.228 |
| 6/11/13 | 2.185 |
| 6/10/13 | 2.21 |
| 6/7/13 | 2.172 |
| 6/6/13 | 2.077 |
| 6/5/13 | 2.089 |
| 6/4/13 | 2.146 |
| 6/3/13 | 2.119 |
| 5/31/13 | 2.128 |
| 5/30/13 | 2.111 |
| 5/29/13 | 2.115 |
| 5/28/13 | 2.165 |
| 5/24/13 | 2.008 |
| 5/23/13 | 2.016 |
| 5/22/13 | 2.039 |
| 5/21/13 | 1.926 |
| 5/20/13 | 1.965 |
| 5/17/13 | 1.951 |
| 5/16/13 | 1.881 |
| 5/15/13 | 1.935 |
| 5/14/13 | 1.974 |
| 5/13/13 | 1.92 |
| 5/10/13 | 1.897 |
| 5/9/13 | 1.811 |
| 5/8/13 | 1.766 |
| 5/7/13 | 1.778 |
| 5/6/13 | 1.759 |
| 5/3/13 | 1.738 |
| 5/2/13 | 1.626 |
| 5/1/13 | 1.629 |
| 4/30/13 | 1.672 |
| 4/29/13 | 1.67 |
| 4/26/13 | 1.663 |
| 4/25/13 | 1.708 |
| 4/24/13 | 1.705 |
| 4/23/13 | 1.706 |
| 4/22/13 | 1.693 |
| 4/19/13 | 1.705 |
| 4/18/13 | 1.685 |
| 4/17/13 | 1.695 |
| 4/16/13 | 1.722 |
| 4/15/13 | 1.68 |
| 4/12/13 | 1.721 |
| 4/11/13 | 1.789 |
| 4/10/13 | 1.803 |
| 4/9/13 | 1.75 |
| 4/8/13 | 1.746 |
| 4/5/13 | 1.713 |
| 4/4/13 | 1.762 |
| 4/3/13 | 1.811 |
| 4/2/13 | 1.859 |
| 4/1/13 | 1.831 |
| 3/28/13 | 1.849 |
| 3/27/13 | 1.845 |
| 3/26/13 | 1.909 |
| 3/25/13 | 1.92 |
| 3/22/13 | 1.925 |
| 3/21/13 | 1.911 |
| 3/20/13 | 1.958 |
| 3/19/13 | 1.902 |
| 3/18/13 | 1.955 |
| 3/15/13 | 1.99 |
| 3/14/13 | 2.03 |
| 3/13/13 | 2.021 |
| 3/12/13 | 2.016 |
| 3/11/13 | 2.058 |
| 3/8/13 | 2.043 |
| 3/7/13 | 1.996 |
| 3/6/13 | 1.938 |
| 3/5/13 | 1.898 |
| 3/4/13 | 1.876 |
| 3/1/13 | 1.841 |
| 2/28/13 | 1.876 |
| 2/27/13 | 1.901 |
| 2/26/13 | 1.881 |
| 2/25/13 | 1.864 |
| 2/22/13 | 1.962 |
| 2/21/13 | 1.977 |
| 2/20/13 | 2.009 |
| 2/19/13 | 2.028 |
| 2/15/13 | 2.002 |
| 2/14/13 | 1.997 |
| 2/13/13 | 2.028 |
| 2/12/13 | 1.977 |
| 2/11/13 | 1.964 |
| 2/8/13 | 1.95 |
| 2/7/13 | 1.957 |
| 2/6/13 | 1.96 |
| 2/5/13 | 1.998 |
| 2/4/13 | 1.955 |
| 2/1/13 | 2.015 |
| 1/31/13 | 1.985 |
| 1/30/13 | 1.992 |
| 1/29/13 | 1.999 |
| 1/28/13 | 1.961 |
| 1/25/13 | 1.949 |
| 1/24/13 | 1.85 |
| 1/23/13 | 1.824 |
| 1/22/13 | 1.842 |
| 1/18/13 | 1.842 |
| 1/17/13 | 1.879 |
| 1/16/13 | 1.818 |
| 1/15/13 | 1.836 |
| 1/14/13 | 1.845 |
| 1/11/13 | 1.868 |
| 1/10/13 | 1.896 |
| 1/9/13 | 1.857 |
| 1/8/13 | 1.868 |
| 1/7/13 | 1.897 |
| 1/4/13 | 1.899 |
| 1/3/13 | 1.912 |
| 1/2/13 | 1.837 |
| 12/31/12 | 1.757 |
| 12/28/12 | 1.701 |
| 12/27/12 | 1.736 |
| 12/26/12 | 1.751 |
| 12/24/12 | 1.774 |
| 12/21/12 | 1.762 |
| 12/20/12 | 1.796 |
| 12/19/12 | 1.801 |
| 12/18/12 | 1.817 |
| 12/17/12 | 1.772 |
| 12/14/12 | 1.702 |
| 12/13/12 | 1.73 |
| 12/12/12 | 1.698 |
| 12/11/12 | 1.654 |
| 12/10/12 | 1.616 |
| 12/7/12 | 1.622 |
| 12/6/12 | 1.586 |
| 12/5/12 | 1.588 |
| 12/4/12 | 1.603 |
| 12/3/12 | 1.621 |
| 11/30/12 | 1.616 |
| 11/29/12 | 1.615 |
| 11/28/12 | 1.628 |
| 11/27/12 | 1.637 |
| 11/26/12 | 1.662 |
| 11/23/12 | 1.69 |
| 11/21/12 | 1.68 |
| 11/20/12 | 1.666 |
| 11/19/12 | 1.613 |
| 11/16/12 | 1.58 |
| 11/15/12 | 1.593 |
| 11/14/12 | 1.591 |
| 11/13/12 | 1.594 |
| 11/9/12 | 1.606 |
| 11/8/12 | 1.615 |
| 11/7/12 | 1.647 |
| 11/6/12 | 1.751 |
| 11/5/12 | 1.684 |
| 11/2/12 | 1.715 |
| 11/1/12 | 1.724 |
| 10/31/12 | 1.69 |
| 10/30/12 | 1.719 |
| 10/29/12 | 1.719 |
| 10/26/12 | 1.745 |
| 10/25/12 | 1.823 |
| 10/24/12 | 1.789 |
| 10/23/12 | 1.757 |
| 10/22/12 | 1.813 |
| 10/19/12 | 1.763 |
| 10/18/12 | 1.834 |
| 10/17/12 | 1.818 |
| 10/16/12 | 1.719 |
| 10/15/12 | 1.663 |
| 10/12/12 | 1.656 |
| 10/11/12 | 1.67 |
| 10/10/12 | 1.674 |
| 10/9/12 | 1.713 |
| 10/5/12 | 1.743 |
| 10/4/12 | 1.673 |
| 10/3/12 | 1.615 |
| 10/2/12 | 1.62 |
| 10/1/12 | 1.625 |
| 9/28/12 | 1.634 |
| 9/27/12 | 1.654 |
| 9/26/12 | 1.61 |
| 9/25/12 | 1.666 |
| 9/24/12 | 1.709 |
| 9/21/12 | 1.753 |
| 9/20/12 | 1.764 |
| 9/19/12 | 1.772 |
| 9/18/12 | 1.808 |
| 9/17/12 | 1.842 |
| 9/14/12 | 1.866 |
| 9/13/12 | 1.723 |
| 9/12/12 | 1.758 |
| 9/11/12 | 1.7 |
| 9/10/12 | 1.654 |
| 9/7/12 | 1.668 |
| 9/6/12 | 1.678 |
| 9/5/12 | 1.596 |
| 9/4/12 | 1.572 |
| 8/31/12 | 1.548 |
| 8/30/12 | 1.623 |
| 8/29/12 | 1.651 |
| 8/28/12 | 1.634 |
| 8/27/12 | 1.651 |
| 8/24/12 | 1.686 |
| 8/23/12 | 1.678 |
| 8/22/12 | 1.692 |
| 8/21/12 | 1.798 |
| 8/20/12 | 1.805 |
| 8/17/12 | 1.81 |
| 8/16/12 | 1.835 |
| 8/15/12 | 1.816 |
| 8/14/12 | 1.738 |
| 8/13/12 | 1.664 |
| 8/10/12 | 1.657 |
| 8/9/12 | 1.688 |
| 8/8/12 | 1.649 |
| 8/7/12 | 1.628 |
| 8/6/12 | 1.566 |
| 8/3/12 | 1.563 |
| 8/2/12 | 1.478 |
| 8/1/12 | 1.524 |
| 7/31/12 | 1.468 |
| 7/30/12 | 1.502 |
| 7/27/12 | 1.546 |
| 7/26/12 | 1.438 |
| 7/25/12 | 1.398 |
| 7/24/12 | 1.388 |
| 7/23/12 | 1.426 |
| 7/20/12 | 1.457 |
| 7/19/12 | 1.508 |
| 7/18/12 | 1.494 |
| 7/17/12 | 1.508 |
| 7/16/12 | 1.472 |
| 7/13/12 | 1.488 |
| 7/12/12 | 1.474 |
| 7/11/12 | 1.517 |
| 7/10/12 | 1.502 |
| 7/9/12 | 1.512 |
| 7/6/12 | 1.549 |
| 7/5/12 | 1.597 |
| 7/3/12 | 1.629 |
| 7/2/12 | 1.588 |
| 6/29/12 | 1.645 |
| 6/28/12 | 1.577 |
| 6/27/12 | 1.618 |
| 6/26/12 | 1.626 |
| 6/25/12 | 1.602 |
| 6/22/12 | 1.674 |
| 6/21/12 | 1.616 |
| 6/20/12 | 1.657 |
| 6/19/12 | 1.62 |
| 6/18/12 | 1.574 |
| 6/15/12 | 1.577 |
| 6/14/12 | 1.642 |
| 6/13/12 | 1.593 |
| 6/12/12 | 1.664 |
| 6/11/12 | 1.586 |
| 6/8/12 | 1.635 |
| 6/7/12 | 1.639 |
| 6/6/12 | 1.659 |
| 6/5/12 | 1.574 |
| 6/4/12 | 1.524 |
| 6/1/12 | 1.452 |
| 5/31/12 | 1.558 |
| 5/30/12 | 1.622 |
| 5/29/12 | 1.745 |
| 5/25/12 | 1.738 |
| 5/24/12 | 1.777 |
| 5/23/12 | 1.735 |
| 5/22/12 | 1.769 |
| 5/21/12 | 1.741 |
| 5/18/12 | 1.723 |
| 5/17/12 | 1.697 |
| 5/16/12 | 1.76 |
| 5/15/12 | 1.767 |
| 5/14/12 | 1.764 |
| 5/11/12 | 1.838 |
| 5/10/12 | 1.867 |
| 5/9/12 | 1.823 |
| 5/8/12 | 1.84 |
| 5/7/12 | 1.872 |
| 5/4/12 | 1.879 |
| 5/3/12 | 1.931 |
| 5/2/12 | 1.928 |
| 5/1/12 | 1.944 |
| 4/30/12 | 1.914 |
| 4/27/12 | 1.935 |
| 4/26/12 | 1.938 |
| 4/25/12 | 1.984 |
| 4/24/12 | 1.974 |
| 4/23/12 | 1.935 |
| 4/20/12 | 1.963 |
| 4/19/12 | 1.966 |
| 4/18/12 | 1.975 |
| 4/17/12 | 1.998 |
| 4/16/12 | 1.98 |
| 4/13/12 | 1.982 |
| 4/12/12 | 2.051 |
| 4/11/12 | 2.035 |
| 4/10/12 | 1.982 |
| 4/9/12 | 2.047 |
| 4/5/12 | 2.18 |
| 4/4/12 | 2.223 |
| 4/3/12 | 2.299 |
| 4/2/12 | 2.182 |
| 3/30/12 | 2.209 |
| 3/29/12 | 2.159 |
| 3/28/12 | 2.2 |
| 3/27/12 | 2.184 |
| 3/26/12 | 2.248 |
| 3/23/12 | 2.232 |
| 3/22/12 | 2.278 |
| 3/21/12 | 2.296 |
| 3/20/12 | 2.359 |
| 3/19/12 | 2.377 |
| 3/16/12 | 2.294 |
| 3/15/12 | 2.279 |
| 3/14/12 | 2.269 |
| 3/13/12 | 2.126 |
| 3/12/12 | 2.033 |
| 3/9/12 | 2.028 |
| 3/8/12 | 2.012 |
| 3/7/12 | 1.976 |
| 3/6/12 | 1.943 |
| 3/5/12 | 2.01 |
| 3/2/12 | 1.974 |
| 3/1/12 | 2.026 |
| 2/29/12 | 1.97 |
| 2/28/12 | 1.943 |
| 2/27/12 | 1.926 |
| 2/24/12 | 1.976 |
| 2/23/12 | 1.996 |
| 2/22/12 | 2.003 |
| 2/21/12 | 2.059 |
| 2/17/12 | 2.002 |
| 2/16/12 | 1.983 |
| 2/15/12 | 1.928 |
| 2/14/12 | 1.936 |
| 2/13/12 | 1.974 |
| 2/10/12 | 1.986 |
| 2/9/12 | 2.036 |
| 2/8/12 | 1.982 |
| 2/7/12 | 1.973 |
| 2/6/12 | 1.907 |
| 2/3/12 | 1.922 |
| 2/2/12 | 1.821 |
| 2/1/12 | 1.826 |
| 1/31/12 | 1.797 |
| 1/30/12 | 1.844 |
| 1/27/12 | 1.891 |
| 1/26/12 | 1.931 |
| 1/25/12 | 1.995 |
| 1/24/12 | 2.06 |
| 1/23/12 | 2.051 |
| 1/20/12 | 2.025 |
| 1/19/12 | 1.977 |
| 1/18/12 | 1.898 |
| 1/17/12 | 1.857 |
| 1/13/12 | 1.864 |
| 1/12/12 | 1.923 |
| 1/11/12 | 1.904 |
| 1/10/12 | 1.968 |
| 1/9/12 | 1.958 |
| 1/6/12 | 1.958 |
| 1/5/12 | 1.995 |
| 1/4/12 | 1.977 |
| 1/3/12 | 1.947 |
| 12/30/11 | 1.876 |
| 12/29/11 | 1.899 |
| 12/28/11 | 1.916 |
| 12/27/11 | 2.005 |
| 12/23/11 | 2.024 |
| 12/22/11 | 1.948 |
| 12/21/11 | 1.967 |
| 12/20/11 | 1.923 |
| 12/19/11 | 1.81 |
| 12/16/11 | 1.847 |
| 12/15/11 | 1.908 |
| 12/14/11 | 1.903 |
| 12/13/11 | 1.965 |
| 12/12/11 | 2.012 |
| 12/9/11 | 2.061 |
| 12/8/11 | 1.97 |
| 12/7/11 | 2.03 |
| 12/6/11 | 2.089 |
| 12/5/11 | 2.044 |
| 12/2/11 | 2.033 |
| 12/1/11 | 2.087 |
| 11/30/11 | 2.068 |
| 11/29/11 | 1.991 |
| 11/28/11 | 1.974 |
| 11/25/11 | 1.964 |
| 11/23/11 | 1.884 |
| 11/22/11 | 1.917 |
| 11/21/11 | 1.955 |
| 11/18/11 | 2.01 |
| 11/17/11 | 1.96 |
| 11/16/11 | 2 |
| 11/15/11 | 2.045 |
| 11/14/11 | 2.056 |
| 11/10/11 | 2.056 |
| 11/9/11 | 1.962 |
| 11/8/11 | 2.077 |
| 11/7/11 | 2.037 |
| 11/4/11 | 2.033 |
| 11/3/11 | 2.073 |
| 11/2/11 | 1.985 |
| 11/1/11 | 1.989 |
| 10/31/11 | 2.113 |
| 10/28/11 | 2.317 |
| 10/27/11 | 2.396 |
| 10/26/11 | 2.204 |
| 10/25/11 | 2.109 |
| 10/24/11 | 2.234 |
| 10/21/11 | 2.219 |
| 10/20/11 | 2.189 |
| 10/19/11 | 2.16 |
| 10/18/11 | 2.176 |
| 10/17/11 | 2.155 |
| 10/14/11 | 2.248 |
| 10/13/11 | 2.183 |
| 10/12/11 | 2.21 |
| 10/11/11 | 2.15 |
| 10/7/11 | 2.076 |
| 10/6/11 | 1.987 |
| 10/5/11 | 1.888 |
| 10/4/11 | 1.821 |
| 10/3/11 | 1.756 |
| 9/30/11 | 1.915 |
| 9/29/11 | 1.996 |
| 9/28/11 | 1.98 |
| 9/27/11 | 1.971 |
| 9/26/11 | 1.9 |
| 9/23/11 | 1.833 |
| 9/22/11 | 1.718 |
| 9/21/11 | 1.858 |
| 9/20/11 | 1.938 |
| 9/19/11 | 1.951 |
| 9/16/11 | 2.048 |
| 9/15/11 | 2.082 |
| 9/14/11 | 1.984 |
| 9/13/11 | 1.991 |
| 9/12/11 | 1.948 |
| 9/9/11 | 1.918 |
| 9/8/11 | 1.979 |
| 9/7/11 | 2.043 |
| 9/6/11 | 1.984 |
| 9/2/11 | 1.986 |
| 9/1/11 | 2.13 |
| 8/31/11 | 2.223 |
| 8/30/11 | 2.177 |
| 8/29/11 | 2.256 |
| 8/26/11 | 2.19 |
| 8/25/11 | 2.229 |
| 8/24/11 | 2.299 |
| 8/23/11 | 2.153 |
| 8/22/11 | 2.106 |
| 8/19/11 | 2.062 |
| 8/18/11 | 2.062 |
| 8/17/11 | 2.165 |
| 8/16/11 | 2.22 |
| 8/15/11 | 2.305 |
| 8/12/11 | 2.255 |
| 8/11/11 | 2.34 |
| 8/10/11 | 2.106 |
| 8/9/11 | 2.249 |
| 8/8/11 | 2.318 |
| 8/5/11 | 2.558 |
| 8/4/11 | 2.403 |
| 8/3/11 | 2.62 |
| 8/2/11 | 2.611 |
| 8/1/11 | 2.744 |
| 7/29/11 | 2.796 |
| 7/28/11 | 2.945 |
| 7/27/11 | 2.98 |
| 7/26/11 | 2.953 |
| 7/25/11 | 3.001 |
| 7/22/11 | 2.962 |
| 7/21/11 | 3.014 |
| 7/20/11 | 2.928 |
| 7/19/11 | 2.88 |
| 7/18/11 | 2.928 |
| 7/15/11 | 2.906 |
| 7/14/11 | 2.953 |
| 7/13/11 | 2.882 |
| 7/12/11 | 2.877 |
| 7/11/11 | 2.919 |
| 7/8/11 | 3.027 |
| 7/7/11 | 3.138 |
| 7/6/11 | 3.108 |
| 7/5/11 | 3.121 |
| 7/1/11 | 3.182 |
| 6/30/11 | 3.16 |
| 6/29/11 | 3.112 |
| 6/28/11 | 3.031 |
| 6/27/11 | 2.93 |
| 6/24/11 | 2.864 |
| 6/23/11 | 2.912 |
| 6/22/11 | 2.982 |
| 6/21/11 | 2.984 |
| 6/20/11 | 2.958 |
| 6/17/11 | 2.944 |
| 6/16/11 | 2.927 |
| 6/15/11 | 2.969 |
| 6/14/11 | 3.097 |
| 6/13/11 | 2.984 |
| 6/10/11 | 2.969 |
| 6/9/11 | 2.997 |
| 6/8/11 | 2.939 |
| 6/7/11 | 2.995 |
| 6/6/11 | 2.995 |
| 6/3/11 | 2.986 |
| 6/2/11 | 3.03 |
| 6/1/11 | 2.941 |
| 5/31/11 | 3.061 |
| 5/27/11 | 3.074 |
| 5/26/11 | 3.057 |
| 5/25/11 | 3.13 |
| 5/24/11 | 3.114 |
| 5/23/11 | 3.129 |
| 5/20/11 | 3.145 |
| 5/19/11 | 3.171 |
| 5/18/11 | 3.18 |
| 5/17/11 | 3.116 |
| 5/16/11 | 3.147 |
| 5/13/11 | 3.171 |
| 5/12/11 | 3.222 |
| 5/11/11 | 3.159 |
| 5/10/11 | 3.214 |
| 5/9/11 | 3.16 |
| 5/6/11 | 3.146 |
| 5/5/11 | 3.15 |
| 5/4/11 | 3.216 |
| 5/3/11 | 3.247 |
| 5/2/11 | 3.279 |
| 4/29/11 | 3.286 |
| 4/28/11 | 3.311 |
| 4/27/11 | 3.355 |
| 4/26/11 | 3.307 |
| 4/25/11 | 3.363 |
| 4/21/11 | 3.396 |
| 4/20/11 | 3.408 |
| 4/19/11 | 3.363 |
| 4/18/11 | 3.374 |
| 4/15/11 | 3.408 |
| 4/14/11 | 3.498 |
| 4/13/11 | 3.458 |
| 4/12/11 | 3.49 |
| 4/11/11 | 3.585 |
| 4/8/11 | 3.577 |
| 4/7/11 | 3.545 |
| 4/6/11 | 3.545 |
| 4/5/11 | 3.48 |
| 4/4/11 | 3.418 |
| 4/1/11 | 3.442 |
| 3/31/11 | 3.47 |
| 3/30/11 | 3.435 |
| 3/29/11 | 3.487 |
| 3/28/11 | 3.431 |
| 3/25/11 | 3.439 |
| 3/24/11 | 3.404 |
| 3/23/11 | 3.35 |
| 3/22/11 | 3.326 |
| 3/21/11 | 3.328 |
| 3/18/11 | 3.268 |
| 3/17/11 | 3.255 |
| 3/16/11 | 3.17 |
| 3/15/11 | 3.303 |
| 3/14/11 | 3.356 |
| 3/11/11 | 3.402 |
| 3/10/11 | 3.358 |
| 3/9/11 | 3.468 |
| 3/8/11 | 3.548 |
| 3/7/11 | 3.512 |
| 3/4/11 | 3.49 |
| 3/3/11 | 3.555 |
| 3/2/11 | 3.47 |
| 3/1/11 | 3.392 |
| 2/28/11 | 3.427 |
| 2/25/11 | 3.412 |
| 2/24/11 | 3.448 |
| 2/23/11 | 3.485 |
| 2/22/11 | 3.453 |
| 2/18/11 | 3.58 |
| 2/17/11 | 3.572 |
| 2/16/11 | 3.619 |
| 2/15/11 | 3.604 |
| 2/14/11 | 3.619 |
| 2/11/11 | 3.629 |
| 2/10/11 | 3.693 |
| 2/9/11 | 3.646 |
| 2/8/11 | 3.737 |
| 2/7/11 | 3.63 |
| 2/4/11 | 3.636 |
| 2/3/11 | 3.549 |
| 2/2/11 | 3.477 |
| 2/1/11 | 3.439 |
| 1/31/11 | 3.37 |
| 1/28/11 | 3.321 |
| 1/27/11 | 3.387 |
| 1/26/11 | 3.415 |
| 1/25/11 | 3.328 |
| 1/24/11 | 3.404 |
| 1/21/11 | 3.404 |
| 1/20/11 | 3.449 |
| 1/19/11 | 3.339 |
| 1/18/11 | 3.366 |
| 1/14/11 | 3.323 |
| 1/13/11 | 3.297 |
| 1/12/11 | 3.365 |
| 1/11/11 | 3.34 |
| 1/10/11 | 3.283 |
| 1/7/11 | 3.324 |
| 1/6/11 | 3.393 |
| 1/5/11 | 3.465 |
| 1/4/11 | 3.329 |
| 1/3/11 | 3.332 |
| 12/31/10 | 3.294 |
| 12/30/10 | 3.365 |
| 12/29/10 | 3.349 |
| 12/28/10 | 3.48 |
| 12/27/10 | 3.329 |
| 12/23/10 | 3.389 |
| 12/22/10 | 3.346 |
| 12/21/10 | 3.303 |
| 12/20/10 | 3.336 |
| 12/17/10 | 3.328 |
| 12/16/10 | 3.422 |
| 12/15/10 | 3.532 |
| 12/14/10 | 3.473 |
| 12/13/10 | 3.275 |
| 12/10/10 | 3.319 |
| 12/9/10 | 3.204 |
| 12/8/10 | 3.272 |
| 12/7/10 | 3.126 |
| 12/6/10 | 2.92 |
| 12/3/10 | 3.006 |
| 12/2/10 | 2.988 |
| 12/1/10 | 2.964 |
| 11/30/10 | 2.797 |
| 11/29/10 | 2.82 |
| 11/26/10 | 2.866 |
| 11/24/10 | 2.912 |
| 11/23/10 | 2.773 |
| 11/22/10 | 2.802 |
| 11/19/10 | 2.871 |
| 11/18/10 | 2.895 |
| 11/17/10 | 2.877 |
| 11/16/10 | 2.84 |
| 11/15/10 | 2.959 |
| 11/12/10 | 2.787 |
| 11/10/10 | 2.629 |
| 11/9/10 | 2.656 |
| 11/8/10 | 2.55 |
| 11/5/10 | 2.53 |
| 11/4/10 | 2.489 |
| 11/3/10 | 2.57 |
| 11/2/10 | 2.587 |
| 11/1/10 | 2.623 |
| 10/29/10 | 2.599 |
| 10/28/10 | 2.658 |
| 10/27/10 | 2.72 |
| 10/26/10 | 2.639 |
| 10/25/10 | 2.561 |
| 10/22/10 | 2.554 |
| 10/21/10 | 2.545 |
| 10/20/10 | 2.479 |
| 10/19/10 | 2.475 |
| 10/18/10 | 2.508 |
| 10/15/10 | 2.56 |
| 10/14/10 | 2.508 |
| 10/13/10 | 2.422 |
| 10/12/10 | 2.431 |
| 10/8/10 | 2.392 |
| 10/7/10 | 2.383 |
| 10/6/10 | 2.398 |
| 10/5/10 | 2.472 |
| 10/4/10 | 2.476 |
| 10/1/10 | 2.51 |
| 9/30/10 | 2.51 |
| 9/29/10 | 2.503 |
| 9/28/10 | 2.465 |
| 9/27/10 | 2.524 |
| 9/24/10 | 2.605 |
| 9/23/10 | 2.551 |
| 9/22/10 | 2.558 |
| 9/21/10 | 2.573 |
| 9/20/10 | 2.703 |
| 9/17/10 | 2.737 |
| 9/16/10 | 2.761 |
| 9/15/10 | 2.721 |
| 9/14/10 | 2.679 |
| 9/13/10 | 2.748 |
| 9/10/10 | 2.792 |
| 9/9/10 | 2.759 |
| 9/8/10 | 2.656 |
| 9/7/10 | 2.594 |
| 9/3/10 | 2.697 |
| 9/2/10 | 2.623 |
| 9/1/10 | 2.573 |
| 8/31/10 | 2.468 |
| 8/30/10 | 2.528 |
| 8/27/10 | 2.645 |
| 8/26/10 | 2.476 |
| 8/25/10 | 2.534 |
| 8/24/10 | 2.488 |
| 8/23/10 | 2.598 |
| 8/20/10 | 2.611 |
| 8/19/10 | 2.575 |
| 8/18/10 | 2.632 |
| 8/17/10 | 2.632 |
| 8/16/10 | 2.563 |
| 8/13/10 | 2.672 |
| 8/12/10 | 2.746 |
| 8/11/10 | 2.681 |
| 8/10/10 | 2.759 |
| 8/9/10 | 2.829 |
| 8/6/10 | 2.817 |
| 8/5/10 | 2.901 |
| 8/4/10 | 2.95 |
| 8/3/10 | 2.908 |
| 8/2/10 | 2.961 |
| 7/30/10 | 2.905 |
| 7/29/10 | 2.979 |
| 7/28/10 | 2.985 |
| 7/27/10 | 3.048 |
| 7/26/10 | 2.992 |
| 7/23/10 | 2.994 |
| 7/22/10 | 2.935 |
| 7/21/10 | 2.878 |
| 7/20/10 | 2.948 |
| 7/19/10 | 2.954 |
| 7/16/10 | 2.922 |
| 7/15/10 | 2.994 |
| 7/14/10 | 3.043 |
| 7/13/10 | 3.121 |
| 7/12/10 | 3.063 |
| 7/9/10 | 3.052 |
| 7/8/10 | 3.031 |
| 7/7/10 | 2.98 |
| 7/6/10 | 2.93 |
| 7/2/10 | 2.977 |
| 7/1/10 | 2.947 |
| 6/30/10 | 2.931 |
| 6/29/10 | 2.949 |
| 6/28/10 | 3.021 |
| 6/25/10 | 3.108 |
| 6/24/10 | 3.137 |
| 6/23/10 | 3.119 |
| 6/22/10 | 3.166 |
| 6/21/10 | 3.241 |
| 6/18/10 | 3.22 |
| 6/17/10 | 3.189 |
| 6/16/10 | 3.26 |
| 6/15/10 | 3.302 |
| 6/14/10 | 3.253 |
| 6/11/10 | 3.235 |
| 6/10/10 | 3.319 |
| 6/9/10 | 3.173 |
| 6/8/10 | 3.186 |
| 6/7/10 | 3.142 |
| 6/4/10 | 3.202 |
| 6/3/10 | 3.364 |
| 6/2/10 | 3.34 |
| 6/1/10 | 3.259 |
| 5/28/10 | 3.292 |
| 5/27/10 | 3.36 |
| 5/26/10 | 3.189 |
| 5/25/10 | 3.158 |
| 5/24/10 | 3.194 |
| 5/21/10 | 3.238 |
| 5/20/10 | 3.213 |
| 5/19/10 | 3.368 |
| 5/18/10 | 3.346 |
| 5/17/10 | 3.487 |
| 5/14/10 | 3.453 |
| 5/13/10 | 3.526 |
| 5/12/10 | 3.571 |
| 5/11/10 | 3.524 |
| 5/10/10 | 3.541 |
| 5/7/10 | 3.426 |
| 5/6/10 | 3.394 |
| 5/5/10 | 3.539 |
| 5/4/10 | 3.59 |
| 5/3/10 | 3.682 |
| 4/30/10 | 3.653 |
| 4/29/10 | 3.724 |
| 4/28/10 | 3.763 |
| 4/27/10 | 3.688 |
| 4/26/10 | 3.805 |
| 4/23/10 | 3.809 |
| 4/22/10 | 3.772 |
| 4/21/10 | 3.736 |
| 4/20/10 | 3.799 |
| 4/19/10 | 3.797 |
| 4/16/10 | 3.763 |
| 4/15/10 | 3.832 |
| 4/14/10 | 3.859 |
| 4/13/10 | 3.82 |
| 4/12/10 | 3.842 |
| 4/9/10 | 3.882 |
| 4/8/10 | 3.89 |
| 4/7/10 | 3.853 |
| 4/6/10 | 3.95 |
| 4/5/10 | 3.986 |
| 4/1/10 | 3.868 |
| 3/31/10 | 3.826 |
| 3/30/10 | 3.857 |
| 3/29/10 | 3.864 |
| 3/26/10 | 3.847 |
| 3/25/10 | 3.878 |
| 3/24/10 | 3.852 |
| 3/23/10 | 3.685 |
| 3/22/10 | 3.659 |
| 3/19/10 | 3.689 |
| 3/18/10 | 3.676 |
| 3/17/10 | 3.636 |
| 3/16/10 | 3.649 |
| 3/15/10 | 3.695 |
| 3/12/10 | 3.701 |
| 3/11/10 | 3.727 |
| 3/10/10 | 3.722 |
| 3/9/10 | 3.7 |
| 3/8/10 | 3.716 |
| 3/5/10 | 3.68 |
| 3/4/10 | 3.602 |
| 3/3/10 | 3.617 |
| 3/2/10 | 3.604 |
| 3/1/10 | 3.608 |
| 2/26/10 | 3.612 |
| 2/25/10 | 3.632 |
| 2/24/10 | 3.691 |
| 2/23/10 | 3.683 |
| 2/22/10 | 3.796 |
| 2/19/10 | 3.773 |
| 2/18/10 | 3.801 |
| 2/17/10 | 3.731 |
| 2/16/10 | 3.657 |
| 2/12/10 | 3.693 |
| 2/11/10 | 3.716 |
| 2/10/10 | 3.69 |
| 2/9/10 | 3.645 |
| 2/8/10 | 3.56 |
| 2/5/10 | 3.565 |
| 2/4/10 | 3.606 |
| 2/3/10 | 3.705 |
| 2/2/10 | 3.64 |
| 2/1/10 | 3.65 |
| 1/29/10 | 3.584 |
| 1/28/10 | 3.634 |
| 1/27/10 | 3.648 |
| 1/26/10 | 3.619 |
| 1/25/10 | 3.626 |
| 1/22/10 | 3.607 |
| 1/21/10 | 3.586 |
| 1/20/10 | 3.647 |
| 1/19/10 | 3.692 |
| 1/15/10 | 3.674 |
| 1/14/10 | 3.738 |
| 1/13/10 | 3.791 |
| 1/12/10 | 3.711 |
| 1/11/10 | 3.818 |
| 1/8/10 | 3.83 |
| 1/7/10 | 3.824 |
| 1/6/10 | 3.822 |
| 1/5/10 | 3.761 |
| 1/4/10 | 3.816 |
| 12/31/09 | 3.837 |
| 12/30/09 | 3.786 |
| 12/29/09 | 3.797 |
| 12/28/09 | 3.84 |
| 12/24/09 | 3.803 |
| 12/23/09 | 3.748 |
| 12/22/09 | 3.754 |
| 12/21/09 | 3.674 |
| 12/18/09 | 3.537 |
| 12/17/09 | 3.478 |
| 12/16/09 | 3.598 |
| 12/15/09 | 3.586 |
| 12/14/09 | 3.548 |
| 12/11/09 | 3.55 |
| 12/10/09 | 3.497 |
| 12/9/09 | 3.433 |
| 12/8/09 | 3.38 |
| 12/7/09 | 3.429 |
| 12/4/09 | 3.472 |
| 12/3/09 | 3.384 |
| 12/2/09 | 3.31 |
| 12/1/09 | 3.282 |
| 11/30/09 | 3.198 |
| 11/27/09 | 3.205 |
| 11/25/09 | 3.27 |
| 11/24/09 | 3.303 |
| 11/23/09 | 3.349 |
| 11/20/09 | 3.366 |
| 11/19/09 | 3.336 |
| 11/18/09 | 3.364 |
| 11/17/09 | 3.323 |
| 11/16/09 | 3.334 |
| 11/13/09 | 3.418 |
| 11/12/09 | 3.444 |
| 11/10/09 | 3.472 |
| 11/9/09 | 3.486 |
| 11/6/09 | 3.497 |
| 11/5/09 | 3.524 |
| 11/4/09 | 3.524 |
| 11/3/09 | 3.465 |
| 11/2/09 | 3.414 |
| 10/30/09 | 3.383 |
| 10/29/09 | 3.497 |
| 10/28/09 | 3.415 |
| 10/27/09 | 3.445 |
| 10/26/09 | 3.554 |
| 10/23/09 | 3.49 |
| 10/22/09 | 3.413 |
| 10/21/09 | 3.385 |
| 10/20/09 | 3.341 |
| 10/19/09 | 3.389 |
| 10/16/09 | 3.412 |
| 10/15/09 | 3.456 |
| 10/14/09 | 3.414 |
| 10/13/09 | 3.347 |
| 10/9/09 | 3.38 |
| 10/8/09 | 3.248 |
| 10/7/09 | 3.182 |
| 10/6/09 | 3.255 |
| 10/5/09 | 3.22 |
| 10/2/09 | 3.219 |
| 10/1/09 | 3.179 |
| 9/30/09 | 3.305 |
| 9/29/09 | 3.291 |
| 9/28/09 | 3.28 |
| 9/25/09 | 3.318 |
| 9/24/09 | 3.381 |
| 9/23/09 | 3.418 |
| 9/22/09 | 3.444 |
| 9/21/09 | 3.48 |
| 9/18/09 | 3.463 |
| 9/17/09 | 3.384 |
| 9/16/09 | 3.469 |
| 9/15/09 | 3.454 |
| 9/14/09 | 3.421 |
| 9/11/09 | 3.347 |
| 9/10/09 | 3.347 |
| 9/9/09 | 3.471 |
| 9/8/09 | 3.482 |
| 9/4/09 | 3.438 |
| 9/3/09 | 3.344 |
| 9/2/09 | 3.306 |
| 9/1/09 | 3.362 |
| 8/31/09 | 3.398 |
| 8/28/09 | 3.446 |
| 8/27/09 | 3.453 |
| 8/26/09 | 3.433 |
| 8/25/09 | 3.435 |
| 8/24/09 | 3.476 |
| 8/21/09 | 3.565 |
| 8/20/09 | 3.431 |
| 8/19/09 | 3.452 |
| 8/18/09 | 3.509 |
| 8/17/09 | 3.468 |
| 8/14/09 | 3.569 |
| 8/13/09 | 3.595 |
| 8/12/09 | 3.717 |
| 8/11/09 | 3.668 |
| 8/10/09 | 3.776 |
| 8/7/09 | 3.85 |
| 8/6/09 | 3.75 |
| 8/5/09 | 3.746 |
| 8/4/09 | 3.684 |
| 8/3/09 | 3.633 |
| 7/31/09 | 3.48 |
| 7/30/09 | 3.607 |
| 7/29/09 | 3.658 |
| 7/28/09 | 3.686 |
| 7/27/09 | 3.719 |
| 7/24/09 | 3.658 |
| 7/23/09 | 3.656 |
| 7/22/09 | 3.544 |
| 7/21/09 | 3.482 |
| 7/20/09 | 3.606 |
| 7/17/09 | 3.643 |
| 7/16/09 | 3.569 |
| 7/15/09 | 3.604 |
| 7/14/09 | 3.47 |
| 7/13/09 | 3.35 |
| 7/10/09 | 3.303 |
| 7/9/09 | 3.403 |
| 7/8/09 | 3.308 |
| 7/7/09 | 3.454 |
| 7/6/09 | 3.506 |
| 7/2/09 | 3.495 |
| 7/1/09 | 3.536 |
| 6/30/09 | 3.533 |
| 6/29/09 | 3.477 |
| 6/26/09 | 3.536 |
| 6/25/09 | 3.54 |
| 6/24/09 | 3.685 |
| 6/23/09 | 3.621 |
| 6/22/09 | 3.681 |
| 6/19/09 | 3.781 |
| 6/18/09 | 3.828 |
| 6/17/09 | 3.688 |
| 6/16/09 | 3.659 |
| 6/15/09 | 3.711 |
| 6/12/09 | 3.792 |
| 6/11/09 | 3.854 |
| 6/10/09 | 3.946 |
| 6/9/09 | 3.856 |
| 6/8/09 | 3.874 |
| 6/5/09 | 3.828 |
| 6/4/09 | 3.71 |
| 6/3/09 | 3.54 |
| 6/2/09 | 3.613 |
| 6/1/09 | 3.673 |
| 5/29/09 | 3.459 |
| 5/28/09 | 3.612 |
| 5/27/09 | 3.738 |
| 5/26/09 | 3.547 |
| 5/22/09 | 3.45 |
| 5/21/09 | 3.364 |
| 5/20/09 | 3.191 |
| 5/19/09 | 3.243 |
| 5/18/09 | 3.23 |
| 5/15/09 | 3.134 |
| 5/14/09 | 3.088 |
| 5/13/09 | 3.12 |
| 5/12/09 | 3.173 |
| 5/11/09 | 3.165 |
| 5/8/09 | 3.286 |
| 5/7/09 | 3.334 |
| 5/6/09 | 3.161 |
| 5/5/09 | 3.159 |
| 5/4/09 | 3.151 |
| 5/1/09 | 3.153 |
| 4/30/09 | 3.119 |
| 4/29/09 | 3.107 |
| 4/28/09 | 3.007 |
| 4/27/09 | 2.908 |
| 4/24/09 | 2.99 |
| 4/23/09 | 2.919 |
| 4/22/09 | 2.94 |
| 4/21/09 | 2.897 |
| 4/20/09 | 2.836 |
| 4/17/09 | 2.945 |
| 4/16/09 | 2.83 |
| 4/15/09 | 2.764 |
| 4/14/09 | 2.784 |
| 4/13/09 | 2.858 |
| 4/9/09 | 2.921 |
| 4/8/09 | 2.856 |
| 4/7/09 | 2.896 |
| 4/6/09 | 2.922 |
| 4/3/09 | 2.885 |
| 4/2/09 | 2.766 |
| 4/1/09 | 2.654 |
| 3/31/09 | 2.663 |
| 3/30/09 | 2.712 |
| 3/27/09 | 2.757 |
| 3/26/09 | 2.739 |
| 3/25/09 | 2.784 |
| 3/24/09 | 2.701 |
| 3/23/09 | 2.652 |
| 3/20/09 | 2.634 |
| 3/19/09 | 2.602 |
| 3/18/09 | 2.533 |
| 3/17/09 | 3.007 |
| 3/16/09 | 2.953 |
| 3/13/09 | 2.89 |
| 3/12/09 | 2.854 |
| 3/11/09 | 2.905 |
| 3/10/09 | 3.004 |
| 3/9/09 | 2.859 |
| 3/6/09 | 2.872 |
| 3/5/09 | 2.812 |
| 3/4/09 | 2.974 |
| 3/3/09 | 2.877 |
| 3/2/09 | 2.862 |
| 2/27/09 | 3.013 |
| 2/26/09 | 2.991 |
| 2/25/09 | 2.926 |
| 2/24/09 | 2.795 |
| 2/23/09 | 2.754 |
| 2/20/09 | 2.788 |
| 2/19/09 | 2.853 |
| 2/18/09 | 2.755 |
| 2/17/09 | 2.648 |
| 2/13/09 | 2.889 |
| 2/12/09 | 2.782 |
| 2/11/09 | 2.754 |
| 2/10/09 | 2.814 |
| 2/9/09 | 2.984 |
| 2/6/09 | 2.992 |
| 2/5/09 | 2.912 |
| 2/4/09 | 2.935 |
| 2/3/09 | 2.884 |
| 2/2/09 | 2.723 |
| 1/30/09 | 2.84 |
| 1/29/09 | 2.859 |
| 1/28/09 | 2.666 |
| 1/27/09 | 2.527 |
| 1/26/09 | 2.641 |
| 1/23/09 | 2.617 |
| 1/22/09 | 2.592 |
| 1/21/09 | 2.536 |
| 1/20/09 | 2.377 |
| 1/16/09 | 2.319 |
| 1/15/09 | 2.206 |
| 1/14/09 | 2.199 |
| 1/13/09 | 2.292 |
| 1/12/09 | 2.304 |
| 1/9/09 | 2.39 |
| 1/8/09 | 2.44 |
| 1/7/09 | 2.494 |
| 1/6/09 | 2.445 |
| 1/5/09 | 2.481 |
| 1/2/09 | 2.369 |
| 12/31/08 | 2.212 |
| 12/30/08 | 2.053 |
| 12/29/08 | 2.099 |
| 12/26/08 | 2.132 |
| 12/24/08 | 2.182 |
| 12/23/08 | 2.173 |
| 12/22/08 | 2.17 |
| 12/19/08 | 2.123 |
| 12/18/08 | 2.079 |
| 12/17/08 | 2.192 |
| 12/16/08 | 2.256 |
| 12/15/08 | 2.513 |
| 12/12/08 | 2.57 |
| 12/11/08 | 2.602 |
| 12/10/08 | 2.682 |
| 12/9/08 | 2.64 |
| 12/8/08 | 2.738 |
| 12/5/08 | 2.704 |
| 12/4/08 | 2.551 |
| 12/3/08 | 2.658 |
| 12/2/08 | 2.672 |
| 12/1/08 | 2.731 |
| 11/28/08 | 2.92 |
| 11/26/08 | 2.978 |
| 11/25/08 | 3.108 |
| 11/24/08 | 3.324 |
| 11/21/08 | 3.197 |
| 11/20/08 | 3.013 |
| 11/19/08 | 3.32 |
| 11/18/08 | 3.529 |
| 11/17/08 | 3.648 |
| 11/14/08 | 3.735 |
| 11/13/08 | 3.852 |
| 11/12/08 | 3.647 |
| 11/10/08 | 3.743 |
| 11/7/08 | 3.793 |
| 11/6/08 | 3.689 |
| 11/5/08 | 3.702 |
| 11/4/08 | 3.725 |
| 11/3/08 | 3.914 |
| 10/31/08 | 3.953 |
| 10/30/08 | 3.964 |
| 10/29/08 | 3.855 |
| 10/28/08 | 3.834 |
| 10/27/08 | 3.687 |
| 10/24/08 | 3.686 |
| 10/23/08 | 3.674 |
| 10/22/08 | 3.594 |
| 10/21/08 | 3.739 |
| 10/20/08 | 3.842 |
| 10/17/08 | 3.93 |
| 10/16/08 | 3.957 |
| 10/15/08 | 3.945 |
| 10/14/08 | 4.077 |
| 10/10/08 | 3.87 |
| 10/9/08 | 3.785 |
| 10/8/08 | 3.64 |
| 10/7/08 | 3.503 |
| 10/6/08 | 3.453 |
| 10/3/08 | 3.603 |
| 10/2/08 | 3.628 |
| 10/1/08 | 3.738 |
| 9/30/08 | 3.823 |
| 9/29/08 | 3.578 |
| 9/26/08 | 3.852 |
| 9/25/08 | 3.854 |
| 9/24/08 | 3.81 |
| 9/23/08 | 3.799 |
| 9/22/08 | 3.835 |
| 9/19/08 | 3.81 |
| 9/18/08 | 3.544 |
| 9/17/08 | 3.414 |
| 9/16/08 | 3.436 |
| 9/15/08 | 3.387 |
| 9/12/08 | 3.719 |
| 9/11/08 | 3.642 |
| 9/10/08 | 3.63 |
| 9/9/08 | 3.567 |
| 9/8/08 | 3.674 |
| 9/5/08 | 3.699 |
| 9/4/08 | 3.623 |
| 9/3/08 | 3.699 |
| 9/2/08 | 3.733 |
| 8/29/08 | 3.812 |
| 8/28/08 | 3.778 |
| 8/27/08 | 3.763 |
| 8/26/08 | 3.774 |
| 8/25/08 | 3.784 |
| 8/22/08 | 3.87 |
| 8/21/08 | 3.829 |
| 8/20/08 | 3.801 |
| 8/19/08 | 3.829 |
| 8/18/08 | 3.81 |
| 8/15/08 | 3.835 |
| 8/14/08 | 3.886 |
| 8/13/08 | 3.931 |
| 8/12/08 | 3.895 |
| 8/11/08 | 3.99 |
| 8/8/08 | 3.928 |
| 8/7/08 | 3.92 |
| 8/6/08 | 4.05 |
| 8/5/08 | 4.017 |
| 8/4/08 | 3.962 |
| 8/1/08 | 3.931 |
| 7/31/08 | 3.946 |
| 7/30/08 | 4.044 |
| 7/29/08 | 4.038 |
| 7/28/08 | 4.001 |
| 7/25/08 | 4.097 |
| 7/24/08 | 3.997 |
| 7/23/08 | 4.116 |
| 7/22/08 | 4.099 |
| 7/21/08 | 4.042 |
| 7/18/08 | 4.083 |
| 7/17/08 | 3.991 |
| 7/16/08 | 3.934 |
| 7/15/08 | 3.819 |
| 7/14/08 | 3.855 |
| 7/11/08 | 3.958 |
| 7/10/08 | 3.796 |
| 7/9/08 | 3.811 |
| 7/8/08 | 3.882 |
| 7/7/08 | 3.9 |
| 7/3/08 | 3.975 |
| 7/2/08 | 3.958 |
| 7/1/08 | 4.002 |
| 6/30/08 | 3.969 |
| 6/27/08 | 3.965 |
| 6/26/08 | 4.033 |
| 6/25/08 | 4.099 |
| 6/24/08 | 4.082 |
| 6/23/08 | 4.164 |
| 6/20/08 | 4.164 |
| 6/19/08 | 4.207 |
| 6/18/08 | 4.136 |
| 6/17/08 | 4.197 |
| 6/16/08 | 4.267 |
| 6/13/08 | 4.256 |
| 6/12/08 | 4.211 |
| 6/11/08 | 4.074 |
| 6/10/08 | 4.103 |
| 6/9/08 | 3.998 |
| 6/6/08 | 3.909 |
| 6/5/08 | 4.038 |
| 6/4/08 | 3.976 |
| 6/3/08 | 3.894 |
| 6/2/08 | 3.957 |
| 5/30/08 | 4.06 |
| 5/29/08 | 4.075 |
| 5/28/08 | 4.003 |
| 5/27/08 | 3.919 |
| 5/23/08 | 3.842 |
| 5/22/08 | 3.911 |
| 5/21/08 | 3.807 |
| 5/20/08 | 3.775 |
| 5/19/08 | 3.829 |
| 5/16/08 | 3.845 |
| 5/15/08 | 3.814 |
| 5/14/08 | 3.911 |
| 5/13/08 | 3.913 |
| 5/12/08 | 3.797 |
| 5/9/08 | 3.769 |
| 5/8/08 | 3.775 |
| 5/7/08 | 3.848 |
| 5/6/08 | 3.916 |
| 5/5/08 | 3.867 |
| 5/2/08 | 3.855 |
| 5/1/08 | 3.763 |
| 4/30/08 | 3.728 |
| 4/29/08 | 3.819 |
| 4/28/08 | 3.825 |
| 4/25/08 | 3.87 |
| 4/24/08 | 3.825 |
| 4/23/08 | 3.731 |
| 4/22/08 | 3.691 |
| 4/21/08 | 3.726 |
| 4/18/08 | 3.706 |
| 4/17/08 | 3.727 |
| 4/16/08 | 3.689 |
| 4/15/08 | 3.6 |
| 4/14/08 | 3.511 |
| 4/11/08 | 3.469 |
| 4/10/08 | 3.539 |
| 4/9/08 | 3.481 |
| 4/8/08 | 3.556 |
| 4/7/08 | 3.536 |
| 4/4/08 | 3.466 |
| 4/3/08 | 3.577 |
| 4/2/08 | 3.596 |
| 4/1/08 | 3.558 |
| 3/31/08 | 3.41 |
| 3/28/08 | 3.441 |
| 3/27/08 | 3.528 |
| 3/26/08 | 3.46 |
| 3/25/08 | 3.505 |
| 3/24/08 | 3.556 |
| 3/20/08 | 3.334 |
| 3/19/08 | 3.328 |
| 3/18/08 | 3.483 |
| 3/17/08 | 3.306 |
| 3/14/08 | 3.468 |
| 3/13/08 | 3.526 |
| 3/12/08 | 3.46 |
| 3/11/08 | 3.592 |
| 3/10/08 | 3.455 |
| 3/7/08 | 3.532 |
| 3/6/08 | 3.583 |
| 3/5/08 | 3.668 |
| 3/4/08 | 3.624 |
| 3/3/08 | 3.547 |
| 2/29/08 | 3.509 |
| 2/28/08 | 3.67 |
| 2/27/08 | 3.848 |
| 2/26/08 | 3.86 |
| 2/25/08 | 3.896 |
| 2/22/08 | 3.802 |
| 2/21/08 | 3.771 |
| 2/20/08 | 3.89 |
| 2/19/08 | 3.896 |
| 2/15/08 | 3.769 |
| 2/14/08 | 3.816 |
| 2/13/08 | 3.728 |
| 2/12/08 | 3.658 |
| 2/11/08 | 3.614 |
| 2/8/08 | 3.643 |
| 2/7/08 | 3.757 |
| 2/6/08 | 3.588 |
| 2/5/08 | 3.57 |
| 2/4/08 | 3.644 |
| 2/1/08 | 3.593 |
| 1/31/08 | 3.593 |
| 1/30/08 | 3.666 |
| 1/29/08 | 3.677 |
| 1/28/08 | 3.581 |
| 1/25/08 | 3.549 |
| 1/24/08 | 3.702 |
| 1/23/08 | 3.598 |
| 1/22/08 | 3.433 |
| 1/18/08 | 3.63 |
| 1/17/08 | 3.621 |
| 1/16/08 | 3.734 |
| 1/15/08 | 3.675 |
| 1/14/08 | 3.765 |
| 1/11/08 | 3.784 |
| 1/10/08 | 3.884 |
| 1/9/08 | 3.822 |
| 1/8/08 | 3.782 |
| 1/7/08 | 3.831 |
| 1/4/08 | 3.865 |
| 1/3/08 | 3.892 |
| 1/2/08 | 3.903 |
| 12/31/07 | 4.023 |
| 12/28/07 | 4.073 |
| 12/27/07 | 4.197 |
| 12/26/07 | 4.275 |
| 12/24/07 | 4.212 |
| 12/21/07 | 4.168 |
| 12/20/07 | 4.051 |
| 12/19/07 | 4.028 |
| 12/18/07 | 4.118 |
| 12/17/07 | 4.145 |
| 12/14/07 | 4.234 |
| 12/13/07 | 4.201 |
| 12/12/07 | 4.089 |
| 12/11/07 | 3.969 |
| 12/10/07 | 4.157 |
| 12/7/07 | 4.105 |
| 12/6/07 | 4.008 |
| 12/5/07 | 3.955 |
| 12/4/07 | 3.893 |
| 12/3/07 | 3.846 |
| 11/30/07 | 3.938 |
| 11/29/07 | 3.934 |
| 11/28/07 | 4.035 |
| 11/27/07 | 3.948 |
| 11/26/07 | 3.839 |
| 11/23/07 | 3.999 |
| 11/21/07 | 4.007 |
| 11/20/07 | 4.096 |
| 11/19/07 | 4.071 |
| 11/16/07 | 4.167 |
| 11/15/07 | 4.14 |
| 11/14/07 | 4.25 |
| 11/13/07 | 4.264 |
| 11/9/07 | 4.213 |
| 11/8/07 | 4.283 |
| 11/7/07 | 4.308 |
| 11/6/07 | 4.373 |
| 11/5/07 | 4.334 |
| 11/2/07 | 4.316 |
| 11/1/07 | 4.346 |
| 10/31/07 | 4.471 |
| 10/30/07 | 4.379 |
| 10/29/07 | 4.381 |
| 10/26/07 | 4.401 |
| 10/25/07 | 4.378 |
| 10/24/07 | 4.339 |
| 10/23/07 | 4.403 |
| 10/22/07 | 4.411 |
| 10/19/07 | 4.392 |
| 10/18/07 | 4.489 |
| 10/17/07 | 4.552 |
| 10/16/07 | 4.647 |
| 10/15/07 | 4.677 |
| 10/12/07 | 4.681 |
| 10/11/07 | 4.636 |
| 10/10/07 | 4.65 |
| 10/9/07 | 4.648 |
| 10/5/07 | 4.636 |
| 10/4/07 | 4.51 |
| 10/3/07 | 4.559 |
| 10/2/07 | 4.522 |
| 10/1/07 | 4.545 |
| 9/28/07 | 4.586 |
| 9/27/07 | 4.563 |
| 9/26/07 | 4.62 |
| 9/25/07 | 4.624 |
| 9/24/07 | 4.628 |
| 9/21/07 | 4.62 |
| 9/20/07 | 4.696 |
| 9/19/07 | 4.546 |
| 9/18/07 | 4.472 |
| 9/17/07 | 4.466 |
| 9/14/07 | 4.454 |
| 9/13/07 | 4.464 |
| 9/12/07 | 4.41 |
| 9/11/07 | 4.368 |
| 9/10/07 | 4.322 |
| 9/7/07 | 4.382 |
| 9/6/07 | 4.508 |
| 9/5/07 | 4.467 |
| 9/4/07 | 4.547 |
| 8/31/07 | 4.529 |
| 8/30/07 | 4.506 |
| 8/29/07 | 4.559 |
| 8/28/07 | 4.506 |
| 8/27/07 | 4.563 |
| 8/24/07 | 4.616 |
| 8/23/07 | 4.645 |
| 8/22/07 | 4.645 |
| 8/21/07 | 4.59 |
| 8/20/07 | 4.626 |
| 8/17/07 | 4.685 |
| 8/16/07 | 4.657 |
| 8/15/07 | 4.724 |
| 8/14/07 | 4.724 |
| 8/13/07 | 4.76 |
| 8/10/07 | 4.808 |
| 8/9/07 | 4.768 |
| 8/8/07 | 4.877 |
| 8/7/07 | 4.768 |
| 8/6/07 | 4.737 |
| 8/3/07 | 4.684 |
| 8/2/07 | 4.765 |
| 8/1/07 | 4.792 |
| 7/31/07 | 4.739 |
| 7/30/07 | 4.802 |
| 7/27/07 | 4.757 |
| 7/26/07 | 4.785 |
| 7/25/07 | 4.898 |
| 7/24/07 | 4.908 |
| 7/23/07 | 4.948 |
| 7/20/07 | 4.95 |
| 7/19/07 | 5.016 |
| 7/18/07 | 5.028 |
| 7/17/07 | 5.049 |
| 7/16/07 | 5.038 |
| 7/13/07 | 5.093 |
| 7/12/07 | 5.124 |
| 7/11/07 | 5.086 |
| 7/10/07 | 5.021 |
| 7/9/07 | 5.138 |
| 7/6/07 | 5.182 |
| 7/5/07 | 5.14 |
| 7/3/07 | 5.037 |
| 7/2/07 | 4.989 |
| 6/29/07 | 5.024 |
| 6/28/07 | 5.103 |
| 6/27/07 | 5.08 |
| 6/26/07 | 5.078 |
| 6/25/07 | 5.08 |
| 6/22/07 | 5.13 |
| 6/21/07 | 5.186 |
| 6/20/07 | 5.132 |
| 6/19/07 | 5.081 |
| 6/18/07 | 5.134 |
| 6/15/07 | 5.163 |
| 6/14/07 | 5.221 |
| 6/13/07 | 5.198 |
| 6/12/07 | 5.293 |
| 6/11/07 | 5.151 |
| 6/8/07 | 5.099 |
| 6/7/07 | 5.13 |
| 6/6/07 | 4.964 |
| 6/5/07 | 4.991 |
| 6/4/07 | 4.927 |
| 6/1/07 | 4.952 |
| 5/31/07 | 4.888 |
| 5/30/07 | 4.868 |
| 5/29/07 | 4.882 |
| 5/25/07 | 4.857 |
| 5/24/07 | 4.839 |
| 5/23/07 | 4.847 |
| 5/22/07 | 4.824 |
| 5/21/07 | 4.782 |
| 5/18/07 | 4.8 |
| 5/17/07 | 4.752 |
| 5/16/07 | 4.71 |
| 5/15/07 | 4.702 |
| 5/14/07 | 4.694 |
| 5/11/07 | 4.672 |
| 5/10/07 | 4.638 |
| 5/9/07 | 4.662 |
| 5/8/07 | 4.634 |
| 5/7/07 | 4.626 |
| 5/4/07 | 4.638 |
| 5/3/07 | 4.672 |
| 5/2/07 | 4.642 |
| 5/1/07 | 4.636 |
| 4/30/07 | 4.622 |
| 4/27/07 | 4.692 |
| 4/26/07 | 4.696 |
| 4/25/07 | 4.65 |
| 4/24/07 | 4.62 |
| 4/23/07 | 4.64 |
| 4/20/07 | 4.67 |
| 4/19/07 | 4.664 |
| 4/18/07 | 4.65 |
| 4/17/07 | 4.68 |
| 4/16/07 | 4.735 |
| 4/13/07 | 4.761 |
| 4/12/07 | 4.734 |
| 4/11/07 | 4.73 |
| 4/10/07 | 4.718 |
| 4/9/07 | 4.742 |
| 4/5/07 | 4.678 |
| 4/4/07 | 4.648 |
| 4/3/07 | 4.664 |
| 4/2/07 | 4.64 |
| 3/30/07 | 4.644 |
| 3/29/07 | 4.642 |
| 3/28/07 | 4.62 |
| 3/27/07 | 4.597 |
| 3/26/07 | 4.601 |
| 3/23/07 | 4.61 |
| 3/22/07 | 4.583 |
| 3/21/07 | 4.536 |
| 3/20/07 | 4.549 |
| 3/19/07 | 4.563 |
| 3/16/07 | 4.544 |
| 3/15/07 | 4.536 |
| 3/14/07 | 4.534 |
| 3/13/07 | 4.491 |
| 3/12/07 | 4.552 |
| 3/9/07 | 4.587 |
| 3/8/07 | 4.512 |
| 3/7/07 | 4.487 |
| 3/6/07 | 4.528 |
| 3/5/07 | 4.495 |
| 3/2/07 | 4.497 |
| 3/1/07 | 4.55 |
| 2/28/07 | 4.566 |
| 2/27/07 | 4.511 |
| 2/26/07 | 4.625 |
| 2/23/07 | 4.67 |
| 2/22/07 | 4.728 |
| 2/21/07 | 4.69 |
| 2/20/07 | 4.674 |
| 2/16/07 | 4.688 |
| 2/15/07 | 4.706 |
| 2/14/07 | 4.736 |
| 2/13/07 | 4.808 |
| 2/12/07 | 4.804 |
| 2/9/07 | 4.78 |
| 2/8/07 | 4.732 |
| 2/7/07 | 4.743 |
| 2/6/07 | 4.766 |
| 2/5/07 | 4.802 |
| 2/2/07 | 4.82 |
| 2/1/07 | 4.835 |
| 1/31/07 | 4.808 |
| 1/30/07 | 4.869 |
| 1/29/07 | 4.89 |
| 1/26/07 | 4.873 |
| 1/25/07 | 4.873 |
| 1/24/07 | 4.808 |
| 1/23/07 | 4.808 |
| 1/22/07 | 4.759 |
| 1/19/07 | 4.775 |
| 1/18/07 | 4.743 |
| 1/17/07 | 4.779 |
| 1/16/07 | 4.747 |
| 1/12/07 | 4.775 |
| 1/11/07 | 4.73 |
| 1/10/07 | 4.684 |
| 1/9/07 | 4.654 |
| 1/8/07 | 4.652 |
| 1/5/07 | 4.644 |
| 1/4/07 | 4.602 |
| 1/3/07 | 4.658 |
| 1/2/07 | 4.68 |
| 12/29/06 | 4.702 |
| 12/28/06 | 4.68 |
| 12/27/06 | 4.65 |
| 12/26/06 | 4.599 |
| 12/22/06 | 4.618 |
| 12/21/06 | 4.545 |
| 12/20/06 | 4.595 |
| 12/19/06 | 4.589 |
| 12/18/06 | 4.581 |
| 12/15/06 | 4.593 |
| 12/14/06 | 4.597 |
| 12/13/06 | 4.579 |
| 12/12/06 | 4.485 |
| 12/11/06 | 4.518 |
| 12/8/06 | 4.544 |
| 12/7/06 | 4.481 |
| 12/6/06 | 4.485 |
| 12/5/06 | 4.44 |
| 12/4/06 | 4.423 |
| 12/1/06 | 4.433 |
| 11/30/06 | 4.458 |
| 11/29/06 | 4.521 |
| 11/28/06 | 4.501 |
| 11/27/06 | 4.528 |
| 11/24/06 | 4.548 |
| 11/22/06 | 4.558 |
| 11/21/06 | 4.57 |
| 11/20/06 | 4.597 |
| 11/17/06 | 4.599 |
| 11/16/06 | 4.664 |
| 11/15/06 | 4.617 |
| 11/14/06 | 4.562 |
| 11/13/06 | 4.609 |
| 11/10/06 | 4.588 |
| 11/9/06 | 4.625 |
| 11/8/06 | 4.635 |
| 11/7/06 | 4.657 |
| 11/6/06 | 4.693 |
| 11/3/06 | 4.715 |
| 11/2/06 | 4.594 |
| 11/1/06 | 4.564 |
| 10/31/06 | 4.598 |
| 10/30/06 | 4.669 |
| 10/27/06 | 4.672 |
| 10/26/06 | 4.717 |
| 10/25/06 | 4.761 |
| 10/24/06 | 4.82 |
| 10/23/06 | 4.828 |
| 10/20/06 | 4.786 |
| 10/19/06 | 4.782 |
| 10/18/06 | 4.754 |
| 10/17/06 | 4.766 |
| 10/16/06 | 4.776 |
| 10/13/06 | 4.798 |
| 10/12/06 | 4.77 |
| 10/11/06 | 4.778 |
| 10/10/06 | 4.752 |
| 10/6/06 | 4.694 |
| 10/5/06 | 4.604 |
| 10/4/06 | 4.559 |
| 10/3/06 | 4.614 |
| 10/2/06 | 4.6 |
| 9/29/06 | 4.628 |
| 9/28/06 | 4.612 |
| 9/27/06 | 4.598 |
| 9/26/06 | 4.583 |
| 9/25/06 | 4.542 |
| 9/22/06 | 4.589 |
| 9/21/06 | 4.636 |
| 9/20/06 | 4.729 |
| 9/19/06 | 4.733 |
| 9/18/06 | 4.804 |
| 9/15/06 | 4.788 |
| 9/14/06 | 4.789 |
| 9/13/06 | 4.759 |
| 9/12/06 | 4.769 |
| 9/11/06 | 4.801 |
| 9/8/06 | 4.771 |
| 9/7/06 | 4.785 |
| 9/6/06 | 4.795 |
| 9/5/06 | 4.779 |
| 9/1/06 | 4.724 |
| 8/31/06 | 4.726 |
| 8/30/06 | 4.752 |
| 8/29/06 | 4.777 |
| 8/28/06 | 4.791 |
| 8/25/06 | 4.779 |
| 8/24/06 | 4.799 |
| 8/23/06 | 4.807 |
| 8/22/06 | 4.809 |
| 8/21/06 | 4.811 |
| 8/18/06 | 4.841 |
| 8/17/06 | 4.863 |
| 8/16/06 | 4.859 |
| 8/15/06 | 4.929 |
| 8/14/06 | 4.995 |
| 8/11/06 | 4.969 |
| 8/10/06 | 4.931 |
| 8/9/06 | 4.937 |
| 8/8/06 | 4.916 |
| 8/7/06 | 4.919 |
| 8/4/06 | 4.892 |
| 8/3/06 | 4.959 |
| 8/2/06 | 4.963 |
| 8/1/06 | 4.975 |
| 7/31/06 | 4.979 |
| 7/28/06 | 4.99 |
| 7/27/06 | 5.034 |
| 7/26/06 | 5.03 |
| 7/25/06 | 5.063 |
| 7/24/06 | 5.042 |
| 7/21/06 | 5.04 |
| 7/20/06 | 5.026 |
| 7/19/06 | 5.049 |
| 7/18/06 | 5.13 |
| 7/17/06 | 5.063 |
| 7/14/06 | 5.063 |
| 7/13/06 | 5.063 |
| 7/12/06 | 5.098 |
| 7/11/06 | 5.1 |
| 7/10/06 | 5.124 |
| 7/7/06 | 5.126 |
| 7/6/06 | 5.179 |
| 7/5/06 | 5.22 |
| 7/3/06 | 5.149 |
| 6/30/06 | 5.136 |
| 6/29/06 | 5.194 |
| 6/28/06 | 5.243 |
| 6/27/06 | 5.2 |
| 6/26/06 | 5.233 |
| 6/23/06 | 5.222 |
| 6/22/06 | 5.208 |
| 6/21/06 | 5.153 |
| 6/20/06 | 5.149 |
| 6/19/06 | 5.134 |
| 6/16/06 | 5.126 |
| 6/15/06 | 5.094 |
| 6/14/06 | 5.062 |
| 6/13/06 | 4.961 |
| 6/12/06 | 4.977 |
| 6/9/06 | 4.971 |
| 6/8/06 | 4.994 |
| 6/7/06 | 5.018 |
| 6/6/06 | 5 |
| 6/5/06 | 5.018 |
| 6/2/06 | 4.99 |
| 6/1/06 | 5.098 |
| 5/31/06 | 5.119 |
| 5/30/06 | 5.076 |
| 5/26/06 | 5.048 |
| 5/25/06 | 5.068 |
| 5/24/06 | 5.036 |
| 5/23/06 | 5.012 |
| 5/22/06 | 5.038 |
| 5/19/06 | 5.058 |
| 5/18/06 | 5.06 |
| 5/17/06 | 5.143 |
| 5/16/06 | 5.095 |
| 5/15/06 | 5.153 |
| 5/12/06 | 5.194 |
| 5/11/06 | 5.151 |
| 5/10/06 | 5.123 |
| 5/9/06 | 5.121 |
| 5/8/06 | 5.11 |
| 5/5/06 | 5.1 |
| 5/4/06 | 5.152 |
| 5/3/06 | 5.141 |
| 5/2/06 | 5.108 |
| 5/1/06 | 5.137 |
| 4/28/06 | 5.05 |
| 4/27/06 | 5.067 |
| 4/26/06 | 5.105 |
| 4/25/06 | 5.067 |
| 4/24/06 | 4.977 |
| 4/21/06 | 5.008 |
| 4/20/06 | 5.039 |
| 4/19/06 | 5.022 |
| 4/18/06 | 4.982 |
| 4/17/06 | 5.003 |
| 4/13/06 | 5.045 |
| 4/12/06 | 4.978 |
| 4/11/06 | 4.92 |
| 4/10/06 | 4.953 |
| 4/7/06 | 4.977 |
| 4/6/06 | 4.899 |
| 4/5/06 | 4.843 |
| 4/4/06 | 4.864 |
| 4/3/06 | 4.862 |
| 3/31/06 | 4.847 |
| 3/30/06 | 4.855 |
| 3/29/06 | 4.804 |
| 3/28/06 | 4.78 |
| 3/27/06 | 4.703 |
| 3/24/06 | 4.669 |
| 3/23/06 | 4.733 |
| 3/22/06 | 4.699 |
| 3/21/06 | 4.717 |
| 3/20/06 | 4.656 |
| 3/17/06 | 4.67 |
| 3/16/06 | 4.64 |
| 3/15/06 | 4.727 |
| 3/14/06 | 4.692 |
| 3/13/06 | 4.767 |
| 3/10/06 | 4.757 |
| 3/9/06 | 4.724 |
| 3/8/06 | 4.726 |
| 3/7/06 | 4.722 |
| 3/6/06 | 4.75 |
| 3/3/06 | 4.68 |
| 3/2/06 | 4.628 |
| 3/1/06 | 4.584 |
| 2/28/06 | 4.551 |
| 2/27/06 | 4.59 |
| 2/24/06 | 4.573 |
| 2/23/06 | 4.555 |
| 2/22/06 | 4.522 |
| 2/21/06 | 4.565 |
| 2/17/06 | 4.537 |
| 2/16/06 | 4.582 |
| 2/15/06 | 4.596 |
| 2/14/06 | 4.61 |
| 2/13/06 | 4.577 |
| 2/10/06 | 4.584 |
| 2/9/06 | 4.543 |
| 2/8/06 | 4.587 |
| 2/7/06 | 4.565 |
| 2/6/06 | 4.543 |
| 2/3/06 | 4.523 |
| 2/2/06 | 4.557 |
| 2/1/06 | 4.555 |
| 1/31/06 | 4.515 |
| 1/30/06 | 4.525 |
| 1/27/06 | 4.509 |
| 1/26/06 | 4.517 |
| 1/25/06 | 4.475 |
| 1/24/06 | 4.39 |
| 1/23/06 | 4.355 |
| 1/20/06 | 4.349 |
| 1/19/06 | 4.373 |
| 1/18/06 | 4.332 |
| 1/17/06 | 4.324 |
| 1/13/06 | 4.353 |
| 1/12/06 | 4.403 |
| 1/11/06 | 4.452 |
| 1/10/06 | 4.424 |
| 1/9/06 | 4.365 |
| 1/6/06 | 4.373 |
| 1/5/06 | 4.352 |
| 1/4/06 | 4.342 |
| 1/3/06 | 4.364 |
| 12/30/05 | 4.391 |
| 12/29/05 | 4.354 |
| 12/28/05 | 4.374 |
| 12/27/05 | 4.337 |
| 12/23/05 | 4.372 |
| 12/22/05 | 4.427 |
| 12/21/05 | 4.488 |
| 12/20/05 | 4.46 |
| 12/19/05 | 4.438 |
| 12/16/05 | 4.433 |
| 12/15/05 | 4.46 |
| 12/14/05 | 4.456 |
| 12/13/05 | 4.519 |
| 12/12/05 | 4.547 |
| 12/9/05 | 4.523 |
| 12/8/05 | 4.462 |
| 12/7/05 | 4.51 |
| 12/6/05 | 4.482 |
| 12/5/05 | 4.569 |
| 12/2/05 | 4.512 |
| 12/1/05 | 4.514 |
| 11/30/05 | 4.484 |
| 11/29/05 | 4.474 |
| 11/28/05 | 4.404 |
| 11/25/05 | 4.427 |
| 11/23/05 | 4.47 |
| 11/22/05 | 4.426 |
| 11/21/05 | 4.459 |
| 11/18/05 | 4.488 |
| 11/17/05 | 4.457 |
| 11/16/05 | 4.471 |
| 11/15/05 | 4.557 |
| 11/14/05 | 4.604 |
| 11/10/05 | 4.554 |
| 11/9/05 | 4.639 |
| 11/8/05 | 4.551 |
| 11/7/05 | 4.622 |
| 11/4/05 | 4.659 |
| 11/3/05 | 4.646 |
| 11/2/05 | 4.604 |
| 11/1/05 | 4.563 |
| 10/31/05 | 4.551 |
| 10/28/05 | 4.565 |
| 10/27/05 | 4.546 |
| 10/26/05 | 4.583 |
| 10/25/05 | 4.534 |
| 10/24/05 | 4.444 |
| 10/21/05 | 4.384 |
| 10/20/05 | 4.43 |
| 10/19/05 | 4.459 |
| 10/18/05 | 4.469 |
| 10/17/05 | 4.493 |
| 10/14/05 | 4.479 |
| 10/13/05 | 4.461 |
| 10/12/05 | 4.439 |
| 10/11/05 | 4.391 |
| 10/7/05 | 4.354 |
| 10/6/05 | 4.387 |
| 10/5/05 | 4.34 |
| 10/4/05 | 4.367 |
| 10/3/05 | 4.383 |
| 9/30/05 | 4.324 |
| 9/29/05 | 4.294 |
| 9/28/05 | 4.253 |
| 9/27/05 | 4.281 |
| 9/26/05 | 4.291 |
| 9/23/05 | 4.246 |
| 9/22/05 | 4.18 |
| 9/21/05 | 4.166 |
| 9/20/05 | 4.242 |
| 9/19/05 | 4.246 |
| 9/16/05 | 4.271 |
| 9/15/05 | 4.211 |
| 9/14/05 | 4.164 |
| 9/13/05 | 4.126 |
| 9/12/05 | 4.17 |
| 9/9/05 | 4.118 |
| 9/8/05 | 4.145 |
| 9/7/05 | 4.138 |
| 9/6/05 | 4.095 |
| 9/2/05 | 4.036 |
| 9/1/05 | 4.031 |
| 8/31/05 | 4.014 |
| 8/30/05 | 4.09 |
| 8/29/05 | 4.167 |
| 8/26/05 | 4.186 |
| 8/25/05 | 4.155 |
| 8/24/05 | 4.165 |
| 8/23/05 | 4.178 |
| 8/22/05 | 4.207 |
| 8/19/05 | 4.205 |
| 8/18/05 | 4.198 |
| 8/17/05 | 4.267 |
| 8/16/05 | 4.206 |
| 8/15/05 | 4.281 |
| 8/12/05 | 4.242 |
| 8/11/05 | 4.32 |
| 8/10/05 | 4.39 |
| 8/9/05 | 4.388 |
| 8/8/05 | 4.418 |
| 8/5/05 | 4.386 |
| 8/4/05 | 4.312 |
| 8/3/05 | 4.292 |
| 8/2/05 | 4.334 |
| 8/1/05 | 4.31 |
| 7/29/05 | 4.276 |
| 7/28/05 | 4.189 |
| 7/27/05 | 4.254 |
| 7/26/05 | 4.224 |
| 7/25/05 | 4.244 |
| 7/22/05 | 4.218 |
| 7/21/05 | 4.276 |
| 7/20/05 | 4.158 |
| 7/19/05 | 4.179 |
| 7/18/05 | 4.22 |
| 7/15/05 | 4.164 |
| 7/14/05 | 4.173 |
| 7/13/05 | 4.156 |
| 7/12/05 | 4.142 |
| 7/11/05 | 4.093 |
| 7/8/05 | 4.091 |
| 7/7/05 | 4.06 |
| 7/6/05 | 4.068 |
| 7/5/05 | 4.105 |
| 7/1/05 | 4.049 |
| 6/30/05 | 3.913 |
| 6/29/05 | 3.978 |
| 6/28/05 | 3.97 |
| 6/27/05 | 3.902 |
| 6/24/05 | 3.917 |
| 6/23/05 | 3.951 |
| 6/22/05 | 3.94 |
| 6/21/05 | 4.04 |
| 6/20/05 | 4.109 |
| 6/17/05 | 4.07 |
| 6/16/05 | 4.067 |
| 6/15/05 | 4.1 |
| 6/14/05 | 4.107 |
| 6/13/05 | 4.092 |
| 6/10/05 | 4.051 |
| 6/9/05 | 3.948 |
| 6/8/05 | 3.933 |
| 6/7/05 | 3.901 |
| 6/6/05 | 3.952 |
| 6/3/05 | 3.973 |
| 6/2/05 | 3.903 |
| 6/1/05 | 3.884 |
| 5/31/05 | 3.981 |
| 5/27/05 | 4.071 |
| 5/26/05 | 4.079 |
| 5/25/05 | 4.086 |
| 5/24/05 | 4.027 |
| 5/23/05 | 4.054 |
| 5/20/05 | 4.121 |
| 5/19/05 | 4.112 |
| 5/18/05 | 4.088 |
| 5/17/05 | 4.113 |
| 5/16/05 | 4.127 |
| 5/13/05 | 4.117 |
| 5/12/05 | 4.17 |
| 5/11/05 | 4.202 |
| 5/10/05 | 4.2 |
| 5/9/05 | 4.282 |
| 5/6/05 | 4.258 |
| 5/5/05 | 4.154 |
| 5/4/05 | 4.186 |
| 5/3/05 | 4.164 |
| 5/2/05 | 4.186 |
| 4/29/05 | 4.198 |
| 4/28/05 | 4.144 |
| 4/27/05 | 4.223 |
| 4/26/05 | 4.265 |
| 4/25/05 | 4.247 |
| 4/22/05 | 4.245 |
| 4/21/05 | 4.294 |
| 4/20/05 | 4.185 |
| 4/19/05 | 4.211 |
| 4/18/05 | 4.27 |
| 4/15/05 | 4.241 |
| 4/14/05 | 4.308 |
| 4/13/05 | 4.36 |
| 4/12/05 | 4.352 |
| 4/11/05 | 4.428 |
| 4/8/05 | 4.468 |
| 4/7/05 | 4.48 |
| 4/6/05 | 4.422 |
| 4/5/05 | 4.468 |
| 4/4/05 | 4.456 |
| 4/1/05 | 4.448 |
| 3/31/05 | 4.482 |
| 3/30/05 | 4.546 |
| 3/29/05 | 4.573 |
| 3/28/05 | 4.64 |
| 3/24/05 | 4.597 |
| 3/23/05 | 4.584 |
| 3/22/05 | 4.641 |
| 3/21/05 | 4.523 |
| 3/18/05 | 4.507 |
| 3/17/05 | 4.464 |
| 3/16/05 | 4.506 |
| 3/15/05 | 4.544 |
| 3/14/05 | 4.508 |
| 3/11/05 | 4.542 |
| 3/10/05 | 4.463 |
| 3/9/05 | 4.52 |
| 3/8/05 | 4.391 |
| 3/7/05 | 4.308 |
| 3/4/05 | 4.308 |
| 3/3/05 | 4.377 |
| 3/2/05 | 4.377 |
| 3/1/05 | 4.365 |
| 2/28/05 | 4.377 |
| 2/25/05 | 4.264 |
| 2/24/05 | 4.283 |
| 2/23/05 | 4.262 |
| 2/22/05 | 4.285 |
| 2/18/05 | 4.266 |
| 2/17/05 | 4.179 |
| 2/16/05 | 4.152 |
| 2/15/05 | 4.096 |
| 2/14/05 | 4.069 |
| 2/11/05 | 4.084 |
| 2/10/05 | 4.089 |
| 2/9/05 | 3.979 |
| 2/8/05 | 4.015 |
| 2/7/05 | 4.05 |
| 2/4/05 | 4.075 |
| 2/3/05 | 4.163 |
| 2/2/05 | 4.14 |
| 2/1/05 | 4.138 |
| 1/31/05 | 4.128 |
| 1/28/05 | 4.14 |
| 1/27/05 | 4.218 |
| 1/26/05 | 4.196 |
| 1/25/05 | 4.192 |
| 1/24/05 | 4.12 |
| 1/21/05 | 4.14 |
| 1/20/05 | 4.161 |
| 1/19/05 | 4.171 |
| 1/18/05 | 4.185 |
| 1/14/05 | 4.208 |
| 1/13/05 | 4.164 |
| 1/12/05 | 4.234 |
| 1/11/05 | 4.236 |
| 1/10/05 | 4.269 |
| 1/7/05 | 4.269 |
| 1/6/05 | 4.261 |
| 1/5/05 | 4.281 |
| 1/4/05 | 4.289 |
| 1/3/05 | 4.21 |
| 12/31/04 | 4.218 |
| 12/30/04 | 4.253 |
| 12/29/04 | 4.322 |
| 12/28/04 | 4.291 |
| 12/27/04 | 4.296 |
| 12/23/04 | 4.224 |
| 12/22/04 | 4.193 |
| 12/21/04 | 4.162 |
| 12/20/04 | 4.184 |
| 12/17/04 | 4.199 |
| 12/16/04 | 4.184 |
| 12/15/04 | 4.074 |
| 12/14/04 | 4.122 |
| 12/13/04 | 4.147 |
| 12/10/04 | 4.149 |
| 12/9/04 | 4.166 |
| 12/8/04 | 4.118 |
| 12/7/04 | 4.221 |
| 12/6/04 | 4.221 |
| 12/3/04 | 4.25 |
| 12/2/04 | 4.406 |
| 12/1/04 | 4.365 |
| 11/30/04 | 4.349 |
| 11/29/04 | 4.318 |
| 11/26/04 | 4.246 |
| 11/24/04 | 4.198 |
| 11/23/04 | 4.182 |
| 11/22/04 | 4.178 |
| 11/19/04 | 4.204 |
| 11/18/04 | 4.113 |
| 11/17/04 | 4.129 |
| 11/16/04 | 4.206 |
| 11/15/04 | 4.186 |
| 11/12/04 | 4.179 |
| 11/10/04 | 4.239 |
| 11/9/04 | 4.226 |
| 11/8/04 | 4.216 |
| 11/5/04 | 4.173 |
| 11/4/04 | 4.072 |
| 11/3/04 | 4.074 |
| 11/2/04 | 4.046 |
| 11/1/04 | 4.07 |
| 10/29/04 | 4.024 |
| 10/28/04 | 4.049 |
| 10/27/04 | 4.082 |
| 10/26/04 | 3.999 |
| 10/25/04 | 3.97 |
| 10/22/04 | 3.974 |
| 10/21/04 | 3.995 |
| 10/20/04 | 3.98 |
| 10/19/04 | 4.032 |
| 10/18/04 | 4.042 |
| 10/15/04 | 4.053 |
| 10/14/04 | 4.024 |
| 10/13/04 | 4.055 |
| 10/12/04 | 4.098 |
| 10/8/04 | 4.129 |
| 10/7/04 | 4.242 |
| 10/6/04 | 4.22 |
| 10/5/04 | 4.173 |
| 10/4/04 | 4.164 |
| 10/1/04 | 4.187 |
| 9/30/04 | 4.119 |
| 9/29/04 | 4.087 |
| 9/28/04 | 4.002 |
| 9/27/04 | 3.989 |
| 9/24/04 | 4.027 |
| 9/23/04 | 4.016 |
| 9/22/04 | 3.978 |
| 9/21/04 | 4.035 |
| 9/20/04 | 4.056 |
| 9/17/04 | 4.106 |
| 9/16/04 | 4.072 |
| 9/15/04 | 4.164 |
| 9/14/04 | 4.124 |
| 9/13/04 | 4.135 |
| 9/10/04 | 4.186 |
| 9/9/04 | 4.195 |
| 9/8/04 | 4.159 |
| 9/7/04 | 4.238 |
| 9/3/04 | 4.294 |
| 9/2/04 | 4.213 |
| 9/1/04 | 4.113 |
| 8/31/04 | 4.117 |
| 8/30/04 | 4.176 |
| 8/27/04 | 4.226 |
| 8/26/04 | 4.209 |
| 8/25/04 | 4.262 |
| 8/24/04 | 4.271 |
| 8/23/04 | 4.283 |
| 8/20/04 | 4.232 |
| 8/19/04 | 4.213 |
| 8/18/04 | 4.236 |
| 8/17/04 | 4.19 |
| 8/16/04 | 4.262 |
| 8/13/04 | 4.227 |
| 8/12/04 | 4.254 |
| 8/11/04 | 4.271 |
| 8/10/04 | 4.289 |
| 8/9/04 | 4.256 |
| 8/6/04 | 4.22 |
| 8/5/04 | 4.4 |
| 8/4/04 | 4.418 |
| 8/3/04 | 4.424 |
| 8/2/04 | 4.449 |
| 7/30/04 | 4.475 |
| 7/29/04 | 4.575 |
| 7/28/04 | 4.583 |
| 7/27/04 | 4.613 |
| 7/26/04 | 4.485 |
| 7/23/04 | 4.43 |
| 7/22/04 | 4.444 |
| 7/21/04 | 4.466 |
| 7/20/04 | 4.444 |
| 7/19/04 | 4.351 |
| 7/16/04 | 4.349 |
| 7/15/04 | 4.48 |
| 7/14/04 | 4.48 |
| 7/13/04 | 4.47 |
| 7/12/04 | 4.445 |
| 7/9/04 | 4.456 |
| 7/8/04 | 4.47 |
| 7/7/04 | 4.474 |
| 7/6/04 | 4.474 |
| 7/2/04 | 4.459 |
| 7/1/04 | 4.563 |
| 6/30/04 | 4.581 |
| 6/29/04 | 4.686 |
| 6/28/04 | 4.735 |
| 6/25/04 | 4.646 |
| 6/24/04 | 4.644 |
| 6/23/04 | 4.696 |
| 6/22/04 | 4.718 |
| 6/21/04 | 4.684 |
| 6/18/04 | 4.71 |
| 6/17/04 | 4.678 |
| 6/16/04 | 4.722 |
| 6/15/04 | 4.676 |
| 6/14/04 | 4.87 |
| 6/11/04 | 4.8 |
| 6/10/04 | 4.794 |
| 6/9/04 | 4.806 |
| 6/8/04 | 4.762 |
| 6/7/04 | 4.76 |
| 6/4/04 | 4.772 |
| 6/3/04 | 4.71 |
| 6/2/04 | 4.738 |
| 6/1/04 | 4.7 |
| 5/28/04 | 4.647 |
| 5/27/04 | 4.6 |
| 5/26/04 | 4.655 |
| 5/25/04 | 4.72 |
| 5/24/04 | 4.732 |
| 5/21/04 | 4.756 |
| 5/20/04 | 4.7 |
| 5/19/04 | 4.772 |
| 5/18/04 | 4.734 |
| 5/17/04 | 4.689 |
| 5/14/04 | 4.768 |
| 5/13/04 | 4.852 |
| 5/12/04 | 4.805 |
| 5/11/04 | 4.746 |
| 5/10/04 | 4.792 |
| 5/7/04 | 4.771 |
| 5/6/04 | 4.598 |
| 5/5/04 | 4.579 |
| 5/4/04 | 4.565 |
| 5/3/04 | 4.499 |
| 4/30/04 | 4.505 |
| 4/29/04 | 4.536 |
| 4/28/04 | 4.497 |
| 4/27/04 | 4.383 |
| 4/26/04 | 4.434 |
| 4/23/04 | 4.458 |
| 4/22/04 | 4.381 |
| 4/21/04 | 4.423 |
| 4/20/04 | 4.457 |
| 4/19/04 | 4.384 |
| 4/16/04 | 4.338 |
| 4/15/04 | 4.4 |
| 4/14/04 | 4.364 |
| 4/13/04 | 4.352 |
| 4/12/04 | 4.228 |
| 4/8/04 | 4.191 |
| 4/7/04 | 4.157 |
| 4/6/04 | 4.148 |
| 4/5/04 | 4.206 |
| 4/2/04 | 4.144 |
| 4/1/04 | 3.879 |
| 3/31/04 | 3.835 |
| 3/30/04 | 3.894 |
| 3/29/04 | 3.888 |
| 3/26/04 | 3.829 |
| 3/25/04 | 3.737 |
| 3/24/04 | 3.707 |
| 3/23/04 | 3.69 |
| 3/22/04 | 3.713 |
| 3/19/04 | 3.771 |
| 3/18/04 | 3.754 |
| 3/17/04 | 3.711 |
| 3/16/04 | 3.679 |
| 3/15/04 | 3.762 |
| 3/12/04 | 3.777 |
| 3/11/04 | 3.698 |
| 3/10/04 | 3.728 |
| 3/9/04 | 3.721 |
| 3/8/04 | 3.768 |
| 3/5/04 | 3.849 |
| 3/4/04 | 4.015 |
| 3/3/04 | 4.05 |
| 3/2/04 | 4.042 |
| 3/1/04 | 3.973 |
| 2/27/04 | 3.971 |
| 2/26/04 | 4.034 |
| 2/25/04 | 4.008 |
| 2/24/04 | 4.023 |
| 2/23/04 | 4.036 |
| 2/20/04 | 4.096 |
| 2/19/04 | 4.031 |
| 2/18/04 | 4.048 |
| 2/17/04 | 4.038 |
| 2/13/04 | 4.04 |
| 2/12/04 | 4.044 |
| 2/11/04 | 4.031 |
| 2/10/04 | 4.112 |
| 2/9/04 | 4.052 |
| 2/6/04 | 4.077 |
| 2/5/04 | 4.167 |
| 2/4/04 | 4.112 |
| 2/3/04 | 4.097 |
| 2/2/04 | 4.146 |
| 1/30/04 | 4.132 |
| 1/29/04 | 4.173 |
| 1/28/04 | 4.188 |
| 1/27/04 | 4.074 |
| 1/26/04 | 4.13 |
| 1/23/04 | 4.072 |
| 1/22/04 | 3.953 |
| 1/21/04 | 4.018 |
| 1/20/04 | 4.055 |
| 1/16/04 | 4.03 |
| 1/15/04 | 3.969 |
| 1/14/04 | 3.994 |
| 1/13/04 | 4.011 |
| 1/12/04 | 4.086 |
| 1/9/04 | 4.08 |
| 1/8/04 | 4.255 |
| 1/7/04 | 4.242 |
| 1/6/04 | 4.271 |
| 1/5/04 | 4.377 |
| 1/2/04 | 4.379 |
| 12/31/03 | 4.246 |
| 12/30/03 | 4.257 |
| 12/29/03 | 4.242 |
| 12/26/03 | 4.15 |
| 12/24/03 | 4.183 |
| 12/23/03 | 4.259 |
| 12/22/03 | 4.168 |
| 12/19/03 | 4.133 |
| 12/18/03 | 4.126 |
| 12/17/03 | 4.182 |
| 12/16/03 | 4.213 |
| 12/15/03 | 4.257 |
| 12/12/03 | 4.238 |
| 12/11/03 | 4.23 |
| 12/10/03 | 4.316 |
| 12/9/03 | 4.351 |
| 12/8/03 | 4.267 |
| 12/5/03 | 4.23 |
| 12/4/03 | 4.365 |
| 12/3/03 | 4.402 |
| 12/2/03 | 4.379 |
| 12/1/03 | 4.385 |
| 11/28/03 | 4.332 |
| 11/26/03 | 4.246 |
| 11/25/03 | 4.184 |
| 11/24/03 | 4.229 |
| 11/21/03 | 4.159 |
| 11/20/03 | 4.152 |
| 11/19/03 | 4.236 |
| 11/18/03 | 4.142 |
| 11/17/03 | 4.194 |
| 11/14/03 | 4.217 |
| 11/13/03 | 4.269 |
| 11/12/03 | 4.398 |
| 11/10/03 | 4.446 |
| 11/7/03 | 4.438 |
| 11/6/03 | 4.408 |
| 11/5/03 | 4.352 |
| 11/4/03 | 4.295 |
| 11/3/03 | 4.34 |
| 10/31/03 | 4.293 |
| 10/30/03 | 4.342 |
| 10/29/03 | 4.295 |
| 10/28/03 | 4.177 |
| 10/27/03 | 4.259 |
| 10/24/03 | 4.23 |
| 10/23/03 | 4.316 |
| 10/22/03 | 4.251 |
| 10/21/03 | 4.342 |
| 10/20/03 | 4.382 |
| 10/17/03 | 4.388 |
| 10/16/03 | 4.459 |
| 10/15/03 | 4.397 |
| 10/14/03 | 4.344 |
| 10/10/03 | 4.269 |
| 10/9/03 | 4.291 |
| 10/8/03 | 4.236 |
| 10/7/03 | 4.257 |
| 10/6/03 | 4.17 |
| 10/3/03 | 4.199 |
| 10/2/03 | 3.993 |
| 10/1/03 | 3.932 |
| 9/30/03 | 3.938 |
| 9/29/03 | 4.075 |
| 9/26/03 | 4 |
| 9/25/03 | 4.081 |
| 9/24/03 | 4.133 |
| 9/23/03 | 4.205 |
| 9/22/03 | 4.216 |
| 9/19/03 | 4.16 |
| 9/18/03 | 4.162 |
| 9/17/03 | 4.178 |
| 9/16/03 | 4.275 |
| 9/15/03 | 4.267 |
| 9/12/03 | 4.252 |
| 9/11/03 | 4.314 |
| 9/10/03 | 4.271 |
| 9/9/03 | 4.355 |
| 9/8/03 | 4.426 |
| 9/5/03 | 4.347 |
| 9/4/03 | 4.503 |
| 9/3/03 | 4.593 |
| 9/2/03 | 4.599 |
| 8/29/03 | 4.464 |
| 8/28/03 | 4.414 |
| 8/27/03 | 4.535 |
| 8/26/03 | 4.473 |
| 8/25/03 | 4.525 |
| 8/22/03 | 4.473 |
| 8/21/03 | 4.475 |
| 8/20/03 | 4.436 |
| 8/19/03 | 4.361 |
| 8/18/03 | 4.457 |
| 8/15/03 | 4.528 |
| 8/14/03 | 4.489 |
| 8/13/03 | 4.56 |
| 8/12/03 | 4.426 |
| 8/11/03 | 4.353 |
| 8/8/03 | 4.269 |
| 8/7/03 | 4.217 |
| 8/6/03 | 4.267 |
| 8/5/03 | 4.39 |
| 8/4/03 | 4.283 |
| 8/1/03 | 4.383 |
| 7/31/03 | 4.406 |
| 7/30/03 | 4.307 |
| 7/29/03 | 4.438 |
| 7/28/03 | 4.28 |
| 7/25/03 | 4.175 |
| 7/24/03 | 4.165 |
| 7/23/03 | 4.108 |
| 7/22/03 | 4.122 |
| 7/21/03 | 4.21 |
| 7/18/03 | 3.999 |
| 7/17/03 | 3.92 |
| 7/16/03 | 3.918 |
| 7/15/03 | 3.981 |
| 7/14/03 | 3.724 |
| 7/11/03 | 3.626 |
| 7/10/03 | 3.655 |
| 7/9/03 | 3.68 |
| 7/8/03 | 3.714 |
| 7/7/03 | 3.732 |
| 7/3/03 | 3.661 |
| 7/2/03 | 3.536 |
| 7/1/03 | 3.547 |
| 6/30/03 | 3.513 |
| 6/27/03 | 3.542 |
| 6/26/03 | 3.542 |
| 6/25/03 | 3.404 |
| 6/24/03 | 3.249 |
| 6/23/03 | 3.311 |
| 6/20/03 | 3.365 |
| 6/19/03 | 3.337 |
| 6/18/03 | 3.361 |
| 6/17/03 | 3.26 |
| 6/16/03 | 3.172 |
| 6/13/03 | 3.112 |
| 6/12/03 | 3.163 |
| 6/11/03 | 3.21 |
| 6/10/03 | 3.19 |
| 6/9/03 | 3.276 |
| 6/6/03 | 3.351 |
| 6/5/03 | 3.342 |
| 6/4/03 | 3.293 |
| 6/3/03 | 3.329 |
| 6/2/03 | 3.408 |
| 5/30/03 | 3.37 |
| 5/29/03 | 3.335 |
| 5/28/03 | 3.424 |
| 5/27/03 | 3.411 |
| 5/23/03 | 3.335 |
| 5/22/03 | 3.314 |
| 5/21/03 | 3.396 |
| 5/20/03 | 3.354 |
| 5/19/03 | 3.485 |
| 5/16/03 | 3.418 |
| 5/15/03 | 3.53 |
| 5/14/03 | 3.52 |
| 5/13/03 | 3.602 |
| 5/12/03 | 3.642 |
| 5/9/03 | 3.68 |
| 5/8/03 | 3.681 |
| 5/7/03 | 3.675 |
| 5/6/03 | 3.784 |
| 5/5/03 | 3.884 |
| 5/2/03 | 3.919 |
| 5/1/03 | 3.84 |
| 4/30/03 | 3.836 |
| 4/29/03 | 3.927 |
| 4/28/03 | 3.902 |
| 4/25/03 | 3.888 |
| 4/24/03 | 3.919 |
| 4/23/03 | 3.975 |
| 4/22/03 | 3.964 |
| 4/21/03 | 3.981 |
| 4/17/03 | 3.956 |
| 4/16/03 | 3.938 |
| 4/15/03 | 3.985 |
| 4/14/03 | 4.014 |
| 4/11/03 | 3.971 |
| 4/10/03 | 3.942 |
| 4/9/03 | 3.896 |
| 4/8/03 | 3.932 |
| 4/7/03 | 3.977 |
| 4/4/03 | 3.952 |
| 4/3/03 | 3.909 |
| 4/2/03 | 3.928 |
| 4/1/03 | 3.81 |
| 3/31/03 | 3.796 |
| 3/28/03 | 3.898 |
| 3/27/03 | 3.923 |
| 3/26/03 | 3.928 |
| 3/25/03 | 3.942 |
| 3/24/03 | 3.965 |
| 3/21/03 | 4.103 |
| 3/20/03 | 3.953 |
| 3/19/03 | 3.984 |
| 3/18/03 | 3.905 |
| 3/17/03 | 3.838 |
| 3/14/03 | 3.7 |
| 3/13/03 | 3.746 |
| 3/12/03 | 3.581 |
| 3/11/03 | 3.581 |
| 3/10/03 | 3.561 |
| 3/7/03 | 3.641 |
| 3/6/03 | 3.656 |
| 3/5/03 | 3.628 |
| 3/4/03 | 3.646 |
| 3/3/03 | 3.673 |
| 2/28/03 | 3.69 |
| 2/27/03 | 3.737 |
| 2/26/03 | 3.765 |
| 2/25/03 | 3.82 |
| 2/24/03 | 3.844 |
| 2/21/03 | 3.888 |
| 2/20/03 | 3.867 |
| 2/19/03 | 3.882 |
| 2/18/03 | 3.949 |
| 2/14/03 | 3.961 |
| 2/13/03 | 3.877 |
| 2/12/03 | 3.908 |
| 2/11/03 | 3.957 |
| 2/10/03 | 3.964 |
| 2/7/03 | 3.929 |
| 2/6/03 | 3.945 |
| 2/5/03 | 3.996 |
| 2/4/03 | 3.92 |
| 2/3/03 | 3.992 |
| 1/31/03 | 3.962 |
| 1/30/03 | 3.961 |
| 1/29/03 | 4.021 |
| 1/28/03 | 3.968 |
| 1/27/03 | 3.962 |
| 1/24/03 | 3.928 |
| 1/23/03 | 3.936 |
| 1/22/03 | 3.914 |
| 1/21/03 | 3.97 |
| 1/17/03 | 4.009 |
| 1/16/03 | 4.077 |
| 1/15/03 | 4.06 |
| 1/14/03 | 4.077 |
| 1/13/03 | 4.12 |
| 1/10/03 | 4.132 |
| 1/9/03 | 4.179 |
| 1/8/03 | 4.017 |
| 1/7/03 | 4.005 |
| 1/6/03 | 4.052 |
| 1/3/03 | 4.017 |
| 1/2/03 | 4.03 |
| 12/31/02 | 3.816 |
| 12/30/02 | 3.795 |
| 12/27/02 | 3.808 |
| 12/26/02 | 3.902 |
| 12/24/02 | 3.934 |
| 12/23/02 | 3.971 |
| 12/20/02 | 3.957 |
| 12/19/02 | 3.938 |
| 12/18/02 | 4.034 |
| 12/17/02 | 4.124 |
| 12/16/02 | 4.159 |
| 12/13/02 | 4.067 |
| 12/12/02 | 4.023 |
| 12/11/02 | 4.023 |
| 12/10/02 | 4.046 |
| 12/9/02 | 4.034 |
| 12/6/02 | 4.083 |
| 12/5/02 | 4.137 |
| 12/4/02 | 4.151 |
| 12/3/02 | 4.201 |
| 12/2/02 | 4.229 |
| 11/29/02 | 4.205 |
| 11/27/02 | 4.258 |
| 11/26/02 | 4.065 |
| 11/25/02 | 4.174 |
| 11/22/02 | 4.178 |
| 11/21/02 | 4.152 |
| 11/20/02 | 4.058 |
| 11/19/02 | 3.977 |
| 11/18/02 | 3.996 |
| 11/15/02 | 4.029 |
| 11/14/02 | 4.056 |
| 11/13/02 | 3.839 |
| 11/12/02 | 3.848 |
| 11/8/02 | 3.856 |
| 11/7/02 | 3.892 |
| 11/6/02 | 4.033 |
| 11/5/02 | 4.07 |
| 11/4/02 | 4.043 |
| 11/1/02 | 4.004 |
| 10/31/02 | 3.892 |
| 10/30/02 | 3.961 |
| 10/29/02 | 3.938 |
| 10/28/02 | 4.085 |
| 10/25/02 | 4.091 |
| 10/24/02 | 4.115 |
| 10/23/02 | 4.231 |
| 10/22/02 | 4.258 |
| 10/21/02 | 4.251 |
| 10/18/02 | 4.105 |
| 10/17/02 | 4.2 |
| 10/16/02 | 4.048 |
| 10/15/02 | 3.993 |
| 10/11/02 | 3.778 |
| 10/10/02 | 3.657 |
| 10/9/02 | 3.567 |
| 10/8/02 | 3.633 |
| 10/7/02 | 3.613 |
| 10/4/02 | 3.665 |
| 10/3/02 | 3.684 |
| 10/2/02 | 3.667 |
| 10/1/02 | 3.715 |
| 9/30/02 | 3.594 |
| 9/27/02 | 3.658 |
| 9/26/02 | 3.764 |
| 9/25/02 | 3.748 |
| 9/24/02 | 3.645 |
| 9/23/02 | 3.694 |
| 9/20/02 | 3.785 |
| 9/19/02 | 3.776 |
| 9/18/02 | 3.841 |
| 9/17/02 | 3.817 |
| 9/16/02 | 3.913 |
| 9/13/02 | 3.905 |
| 9/12/02 | 3.96 |
| 9/11/02 | 4.058 |
| 9/10/02 | 3.994 |
| 9/9/02 | 4.059 |
| 9/6/02 | 4.011 |
| 9/5/02 | 3.925 |
| 9/4/02 | 3.961 |
| 9/3/02 | 3.963 |
| 8/30/02 | 4.141 |
| 8/29/02 | 4.137 |
| 8/28/02 | 4.212 |
| 8/27/02 | 4.282 |
| 8/26/02 | 4.224 |
| 8/23/02 | 4.233 |
| 8/22/02 | 4.317 |
| 8/21/02 | 4.197 |
| 8/20/02 | 4.148 |
| 8/19/02 | 4.284 |
| 8/16/02 | 4.324 |
| 8/15/02 | 4.18 |
| 8/14/02 | 4.119 |
| 8/13/02 | 4.085 |
| 8/12/02 | 4.215 |
| 8/9/02 | 4.255 |
| 8/8/02 | 4.394 |
| 8/7/02 | 4.304 |
| 8/6/02 | 4.332 |
| 8/5/02 | 4.208 |
| 8/2/02 | 4.29 |
| 8/1/02 | 4.389 |
| 7/31/02 | 4.459 |
| 7/30/02 | 4.585 |
| 7/29/02 | 4.561 |
| 7/26/02 | 4.382 |
| 7/25/02 | 4.38 |
| 7/24/02 | 4.485 |
| 7/23/02 | 4.406 |
| 7/22/02 | 4.444 |
| 7/19/02 | 4.519 |
| 7/18/02 | 4.606 |
| 7/17/02 | 4.682 |
| 7/16/02 | 4.68 |
| 7/15/02 | 4.626 |
| 7/12/02 | 4.572 |
| 7/11/02 | 4.636 |
| 7/10/02 | 4.612 |
| 7/9/02 | 4.725 |
| 7/8/02 | 4.794 |
| 7/5/02 | 4.856 |
| 7/3/02 | 4.764 |
| 7/2/02 | 4.725 |
| 7/1/02 | 4.78 |
| 6/28/02 | 4.796 |
| 6/27/02 | 4.821 |
| 6/26/02 | 4.742 |
| 6/25/02 | 4.817 |
| 6/24/02 | 4.827 |
| 6/21/02 | 4.766 |
| 6/20/02 | 4.788 |
| 6/19/02 | 4.726 |
| 6/18/02 | 4.833 |
| 6/17/02 | 4.844 |
| 6/14/02 | 4.797 |
| 6/13/02 | 4.899 |
| 6/12/02 | 4.962 |
| 6/11/02 | 4.973 |
| 6/10/02 | 5.026 |
| 6/7/02 | 5.066 |
| 6/6/02 | 4.975 |
| 6/5/02 | 5.047 |
| 6/4/02 | 5.026 |
| 6/3/02 | 4.997 |
| 5/31/02 | 5.043 |
| 5/30/02 | 5.02 |
| 5/29/02 | 5.061 |
| 5/28/02 | 5.128 |
| 5/24/02 | 5.144 |
| 5/23/02 | 5.148 |
| 5/22/02 | 5.113 |
| 5/21/02 | 5.148 |
| 5/20/02 | 5.198 |
| 5/17/02 | 5.251 |
| 5/16/02 | 5.166 |
| 5/15/02 | 5.244 |
| 5/14/02 | 5.276 |
| 5/13/02 | 5.221 |
| 5/10/02 | 5.116 |
| 5/9/02 | 5.162 |
| 5/8/02 | 5.216 |
| 5/7/02 | 5.054 |
| 5/6/02 | 5.064 |
| 5/3/02 | 5.054 |
| 5/2/02 | 5.093 |
| 5/1/02 | 5.058 |
| 4/30/02 | 5.085 |
| 4/29/02 | 5.12 |
| 4/26/02 | 5.054 |
| 4/25/02 | 5.093 |
| 4/24/02 | 5.111 |
| 4/23/02 | 5.161 |
| 4/22/02 | 5.176 |
| 4/19/02 | 5.196 |
| 4/18/02 | 5.198 |
| 4/17/02 | 5.233 |
| 4/16/02 | 5.192 |
| 4/15/02 | 5.138 |
| 4/12/02 | 5.156 |
| 4/11/02 | 5.206 |
| 4/10/02 | 5.233 |
| 4/9/02 | 5.202 |
| 4/8/02 | 5.262 |
| 4/5/02 | 5.206 |
| 4/4/02 | 5.258 |
| 4/3/02 | 5.278 |
| 4/2/02 | 5.341 |
| 4/1/02 | 5.426 |
| 3/28/02 | 5.4 |
| 3/27/02 | 5.341 |
| 3/26/02 | 5.345 |
| 3/25/02 | 5.408 |
| 3/22/02 | 5.404 |
| 3/21/02 | 5.365 |
| 3/20/02 | 5.406 |
| 3/19/02 | 5.286 |
| 3/18/02 | 5.3 |
| 3/15/02 | 5.327 |
| 3/14/02 | 5.409 |
| 3/13/02 | 5.279 |
| 3/12/02 | 5.31 |
| 3/11/02 | 5.32 |
| 3/8/02 | 5.325 |
| 3/7/02 | 5.227 |
| 3/6/02 | 5.052 |
| 3/5/02 | 5.001 |
| 3/4/02 | 4.999 |
| 3/1/02 | 4.981 |
| 2/28/02 | 4.877 |
| 2/27/02 | 4.833 |
| 2/26/02 | 4.927 |
| 2/25/02 | 4.849 |
| 2/22/02 | 4.831 |
| 2/21/02 | 4.853 |
| 2/20/02 | 4.889 |
| 2/19/02 | 4.873 |
| 2/15/02 | 4.875 |
| 2/14/02 | 4.945 |
| 2/13/02 | 4.987 |
| 2/12/02 | 4.975 |
| 2/11/02 | 4.907 |
| 2/8/02 | 4.879 |
| 2/7/02 | 4.939 |
| 2/6/02 | 4.923 |
| 2/5/02 | 4.894 |
| 2/4/02 | 4.902 |
| 2/1/02 | 4.985 |
| 1/31/02 | 5.033 |
| 1/30/02 | 5.014 |
| 1/29/02 | 4.942 |
| 1/28/02 | 5.073 |
| 1/25/02 | 5.071 |
| 1/24/02 | 5.008 |
| 1/23/02 | 5.029 |
| 1/22/02 | 4.919 |
| 1/18/02 | 4.894 |
| 1/17/02 | 4.925 |
| 1/16/02 | 4.839 |
| 1/15/02 | 4.835 |
| 1/14/02 | 4.876 |
| 1/11/02 | 4.866 |
| 1/10/02 | 4.979 |
| 1/9/02 | 5.051 |
| 1/8/02 | 5.08 |
| 1/7/02 | 5.049 |
| 1/4/02 | 5.128 |
| 1/3/02 | 5.111 |
| 1/2/02 | 5.16 |
| 12/31/01 | 5.051 |
| 12/28/01 | 5.113 |
| 12/27/01 | 5.065 |
| 12/26/01 | 5.199 |
| 12/24/01 | 5.136 |
| 12/21/01 | 5.084 |
| 12/20/01 | 5.03 |
| 12/19/01 | 5.047 |
| 12/18/01 | 5.121 |
| 12/17/01 | 5.186 |
| 12/14/01 | 5.188 |
| 12/13/01 | 5.073 |
| 12/12/01 | 5.005 |
| 12/11/01 | 5.051 |
| 12/10/01 | 5.098 |
| 12/7/01 | 5.167 |
| 12/6/01 | 5.013 |
| 12/5/01 | 4.893 |
| 12/4/01 | 4.66 |
| 12/3/01 | 4.687 |
| 11/30/01 | 4.752 |
| 11/29/01 | 4.756 |
| 11/28/01 | 4.925 |
| 11/27/01 | 4.919 |
| 11/26/01 | 5.015 |
| 11/23/01 | 4.987 |
| 11/21/01 | 5.013 |
| 11/20/01 | 4.863 |
| 11/19/01 | 4.798 |
| 11/16/01 | 4.843 |
| 11/15/01 | 4.762 |
| 11/14/01 | 4.539 |
| 11/13/01 | 4.378 |
| 11/9/01 | 4.303 |
| 11/8/01 | 4.286 |
| 11/7/01 | 4.178 |
| 11/6/01 | 4.256 |
| 11/5/01 | 4.296 |
| 11/2/01 | 4.358 |
| 11/1/01 | 4.24 |
| 10/31/01 | 4.232 |
| 10/30/01 | 4.41 |
| 10/29/01 | 4.48 |
| 10/26/01 | 4.529 |
| 10/25/01 | 4.551 |
| 10/24/01 | 4.596 |
| 10/23/01 | 4.643 |
| 10/22/01 | 4.633 |
| 10/19/01 | 4.621 |
| 10/18/01 | 4.577 |
| 10/17/01 | 4.567 |
| 10/16/01 | 4.559 |
| 10/15/01 | 4.599 |
| 10/12/01 | 4.669 |
| 10/11/01 | 4.666 |
| 10/10/01 | 4.597 |
| 10/9/01 | 4.593 |
| 10/5/01 | 4.504 |
| 10/4/01 | 4.506 |
| 10/3/01 | 4.468 |
| 10/2/01 | 4.501 |
| 10/1/01 | 4.54 |
| 9/28/01 | 4.588 |
| 9/27/01 | 4.548 |
| 9/26/01 | 4.628 |
| 9/25/01 | 4.7 |
| 9/24/01 | 4.716 |
| 9/21/01 | 4.691 |
| 9/20/01 | 4.742 |
| 9/19/01 | 4.691 |
| 9/18/01 | 4.707 |
| 9/17/01 | 4.623 |
| 9/14/01 | 4.553 |
| 9/13/01 | 4.623 |
| 9/11/01 | 4.809 |
| 9/10/01 | 4.835 |
| 9/7/01 | 4.79 |
| 9/6/01 | 4.873 |
| 9/5/01 | 4.967 |
| 9/4/01 | 4.959 |
| 8/31/01 | 4.832 |
| 8/30/01 | 4.812 |
| 8/29/01 | 4.771 |
| 8/28/01 | 4.836 |
| 8/27/01 | 4.924 |
| 8/24/01 | 4.922 |
| 8/23/01 | 4.88 |
| 8/22/01 | 4.894 |
| 8/21/01 | 4.864 |
| 8/20/01 | 4.902 |
| 8/17/01 | 4.839 |
| 8/16/01 | 4.94 |
| 8/15/01 | 5 |
| 8/14/01 | 4.966 |
| 8/13/01 | 4.976 |
| 8/10/01 | 4.98 |
| 8/9/01 | 5.034 |
| 8/8/01 | 5.05 |
| 8/7/01 | 5.168 |
| 8/6/01 | 5.153 |
| 8/3/01 | 5.157 |
| 8/2/01 | 5.151 |
| 8/1/01 | 5.071 |
| 7/31/01 | 5.054 |
| 7/30/01 | 5.066 |
| 7/27/01 | 5.098 |
| 7/26/01 | 5.129 |
| 7/25/01 | 5.182 |
| 7/24/01 | 5.11 |
| 7/23/01 | 5.104 |
| 7/20/01 | 5.129 |
| 7/19/01 | 5.106 |
| 7/18/01 | 5.091 |
| 7/17/01 | 5.204 |
| 7/16/01 | 5.173 |
| 7/13/01 | 5.217 |
| 7/12/01 | 5.234 |
| 7/11/01 | 5.289 |
| 7/10/01 | 5.274 |
| 7/9/01 | 5.327 |
| 7/6/01 | 5.359 |
| 7/5/01 | 5.391 |
| 7/3/01 | 5.38 |
| 7/2/01 | 5.322 |
| 6/29/01 | 5.412 |
| 6/28/01 | 5.334 |
| 6/27/01 | 5.235 |
| 6/26/01 | 5.224 |
| 6/25/01 | 5.13 |
| 6/22/01 | 5.115 |
| 6/21/01 | 5.172 |
| 6/20/01 | 5.205 |
| 6/19/01 | 5.236 |
| 6/18/01 | 5.251 |
| 6/15/01 | 5.232 |
| 6/14/01 | 5.221 |
| 6/13/01 | 5.263 |
| 6/12/01 | 5.253 |
| 6/11/01 | 5.284 |
| 6/8/01 | 5.356 |
| 6/7/01 | 5.324 |
| 6/6/01 | 5.255 |
| 6/5/01 | 5.269 |
| 6/4/01 | 5.341 |
| 6/1/01 | 5.364 |
| 5/31/01 | 5.381 |
| 5/30/01 | 5.509 |
| 5/29/01 | 5.515 |
| 5/25/01 | 5.511 |
| 5/24/01 | 5.491 |
| 5/23/01 | 5.401 |
| 5/22/01 | 5.41 |
| 5/21/01 | 5.374 |
| 5/18/01 | 5.405 |
| 5/17/01 | 5.407 |
| 5/16/01 | 5.445 |
| 5/15/01 | 5.512 |
| 5/14/01 | 5.42 |
| 5/11/01 | 5.447 |
| 5/10/01 | 5.295 |
| 5/9/01 | 5.174 |
| 5/8/01 | 5.245 |
| 5/7/01 | 5.197 |
| 5/4/01 | 5.205 |
| 5/3/01 | 5.205 |
| 5/2/01 | 5.288 |
| 5/1/01 | 5.292 |
| 4/30/01 | 5.338 |
| 4/27/01 | 5.328 |
| 4/26/01 | 5.192 |
| 4/25/01 | 5.256 |
| 4/24/01 | 5.209 |
| 4/23/01 | 5.177 |
| 4/20/01 | 5.288 |
| 4/19/01 | 5.294 |
| 4/18/01 | 5.146 |
| 4/17/01 | 5.225 |
| 4/16/01 | 5.254 |
| 4/12/01 | 5.169 |
| 4/11/01 | 5.119 |
| 4/10/01 | 5.083 |
| 4/9/01 | 4.932 |
| 4/6/01 | 4.89 |
| 4/5/01 | 4.973 |
| 4/4/01 | 4.914 |
| 4/3/01 | 4.929 |
| 4/2/01 | 4.977 |
| 3/30/01 | 4.917 |
| 3/29/01 | 4.997 |
| 3/28/01 | 4.975 |
| 3/27/01 | 5.011 |
| 3/26/01 | 4.869 |
| 3/23/01 | 4.815 |
| 3/22/01 | 4.756 |
| 3/21/01 | 4.778 |
| 3/20/01 | 4.758 |
| 3/19/01 | 4.813 |
| 3/16/01 | 4.77 |
| 3/15/01 | 4.786 |
| 3/14/01 | 4.818 |
| 3/13/01 | 4.929 |
| 3/12/01 | 4.891 |
| 3/9/01 | 4.929 |
| 3/8/01 | 4.889 |
| 3/7/01 | 4.899 |
| 3/6/01 | 4.971 |
| 3/5/01 | 4.976 |
| 3/2/01 | 4.947 |
| 3/1/01 | 4.874 |
| 2/28/01 | 4.896 |
| 2/27/01 | 4.952 |
| 2/26/01 | 5.034 |
| 2/23/01 | 5.097 |
| 2/22/01 | 5.156 |
| 2/21/01 | 5.139 |
| 2/20/01 | 5.105 |
| 2/16/01 | 5.109 |
| 2/15/01 | 5.166 |
| 2/14/01 | 5.164 |
| 2/13/01 | 5.07 |
| 2/12/01 | 5.046 |
| 2/9/01 | 5.03 |
| 2/8/01 | 5.089 |
| 2/7/01 | 5.187 |
| 2/6/01 | 5.183 |
| 2/5/01 | 5.167 |
| 2/2/01 | 5.148 |
| 2/1/01 | 5.086 |
| 1/31/01 | 5.114 |
| 1/30/01 | 5.229 |
| 1/29/01 | 5.303 |
| 1/26/01 | 5.268 |
| 1/25/01 | 5.245 |
| 1/24/01 | 5.305 |
| 1/23/01 | 5.281 |
| 1/22/01 | 5.225 |
| 1/19/01 | 5.168 |
| 1/18/01 | 5.114 |
| 1/17/01 | 5.175 |
| 1/16/01 | 5.23 |
| 1/12/01 | 5.25 |
| 1/11/01 | 5.11 |
| 1/10/01 | 5.104 |
| 1/9/01 | 5 |
| 1/8/01 | 4.956 |
| 1/5/01 | 4.931 |
| 1/4/01 | 5.039 |
| 1/3/01 | 5.158 |
| 1/2/01 | 4.915 |
| 12/29/00 | 5.112 |
| 12/28/00 | 5.118 |
| 12/27/00 | 5.104 |
| 12/26/00 | 5.056 |
| 12/22/00 | 5.006 |
| 12/21/00 | 5.025 |
| 12/20/00 | 5.037 |
| 12/19/00 | 5.188 |
| 12/18/00 | 5.17 |
| 12/15/00 | 5.18 |
| 12/14/00 | 5.213 |
| 12/13/00 | 5.258 |
| 12/12/00 | 5.346 |
| 12/11/00 | 5.362 |
| 12/8/00 | 5.299 |
| 12/7/00 | 5.309 |
| 12/6/00 | 5.326 |
| 12/5/00 | 5.418 |
| 12/4/00 | 5.551 |
| 12/1/00 | 5.503 |
| 11/30/00 | 5.468 |
| 11/29/00 | 5.524 |
| 11/28/00 | 5.582 |
| 11/27/00 | 5.624 |
| 11/24/00 | 5.624 |
| 11/22/00 | 5.624 |
| 11/21/00 | 5.652 |
| 11/20/00 | 5.677 |
| 11/17/00 | 5.704 |
| 11/16/00 | 5.669 |
| 11/15/00 | 5.711 |
| 11/14/00 | 5.755 |
| 11/13/00 | 5.766 |
| 11/10/00 | 5.783 |
| 11/9/00 | 5.825 |
| 11/8/00 | 5.855 |
| 11/7/00 | 5.866 |
| 11/6/00 | 5.855 |
| 11/3/00 | 5.827 |
| 11/2/00 | 5.738 |
| 11/1/00 | 5.742 |
| 10/31/00 | 5.751 |
| 10/30/00 | 5.732 |
| 10/27/00 | 5.713 |
| 10/26/00 | 5.69 |
| 10/25/00 | 5.684 |
| 10/24/00 | 5.615 |
| 10/23/00 | 5.584 |
| 10/20/00 | 5.632 |
| 10/19/00 | 5.655 |
| 10/18/00 | 5.667 |
| 10/17/00 | 5.673 |
| 10/16/00 | 5.732 |
| 10/13/00 | 5.724 |
| 10/12/00 | 5.709 |
| 10/11/00 | 5.774 |
| 10/10/00 | 5.772 |
| 10/6/00 | 5.812 |
| 10/5/00 | 5.852 |
| 10/4/00 | 5.886 |
| 10/3/00 | 5.867 |
| 10/2/00 | 5.823 |
| 9/29/00 | 5.802 |
| 9/28/00 | 5.812 |
| 9/27/00 | 5.821 |
| 9/26/00 | 5.802 |
| 9/25/00 | 5.837 |
| 9/22/00 | 5.848 |
| 9/21/00 | 5.823 |
| 9/20/00 | 5.897 |
| 9/19/00 | 5.852 |
| 9/18/00 | 5.871 |
| 9/15/00 | 5.84 |
| 9/14/00 | 5.785 |
| 9/13/00 | 5.724 |
| 9/12/00 | 5.772 |
| 9/11/00 | 5.766 |
| 9/8/00 | 5.739 |
| 9/7/00 | 5.752 |
| 9/6/00 | 5.724 |
| 9/5/00 | 5.689 |
| 9/1/00 | 5.679 |
| 8/31/00 | 5.725 |
| 8/30/00 | 5.8 |
| 8/29/00 | 5.808 |
| 8/28/00 | 5.777 |
| 8/25/00 | 5.729 |
| 8/24/00 | 5.719 |
| 8/23/00 | 5.727 |
| 8/22/00 | 5.775 |
| 8/21/00 | 5.781 |
| 8/18/00 | 5.773 |
| 8/17/00 | 5.81 |
| 8/16/00 | 5.838 |
| 8/15/00 | 5.802 |
| 8/14/00 | 5.771 |
| 8/11/00 | 5.79 |
| 8/10/00 | 5.763 |
| 8/9/00 | 5.916 |
| 8/8/00 | 5.92 |
| 8/7/00 | 5.956 |
| 8/4/00 | 5.901 |
| 8/3/00 | 5.952 |
| 8/2/00 | 5.976 |
| 8/1/00 | 5.984 |
| 7/31/00 | 6.031 |
| 7/28/00 | 6.034 |
| 7/27/00 | 6 |
| 7/26/00 | 6.027 |
| 7/25/00 | 6.028 |
| 7/24/00 | 6.034 |
| 7/21/00 | 5.998 |
| 7/20/00 | 6.002 |
| 7/19/00 | 6.154 |
| 7/18/00 | 6.141 |
| 7/17/00 | 6.148 |
| 7/14/00 | 6.096 |
| 7/13/00 | 6.005 |
| 7/12/00 | 6.08 |
| 7/11/00 | 6.048 |
| 7/10/00 | 6.035 |
| 7/7/00 | 6.001 |
| 7/6/00 | 6.048 |
| 7/5/00 | 5.984 |
| 7/3/00 | 5.989 |
| 6/30/00 | 6.031 |
| 6/29/00 | 6.027 |
| 6/28/00 | 6.1 |
| 6/27/00 | 6.085 |
| 6/26/00 | 6.102 |
| 6/23/00 | 6.185 |
| 6/22/00 | 6.104 |
| 6/21/00 | 6.113 |
| 6/20/00 | 6.02 |
| 6/19/00 | 5.999 |
| 6/16/00 | 5.971 |
| 6/15/00 | 6.05 |
| 6/14/00 | 6.041 |
| 6/13/00 | 6.116 |
| 6/12/00 | 6.071 |
| 6/9/00 | 6.126 |
| 6/8/00 | 6.124 |
| 6/7/00 | 6.141 |
| 6/6/00 | 6.122 |
| 6/5/00 | 6.122 |
| 6/2/00 | 6.152 |
| 6/1/00 | 6.191 |
| 5/31/00 | 6.272 |
| 5/30/00 | 6.376 |
| 5/26/00 | 6.331 |
| 5/25/00 | 6.394 |
| 5/24/00 | 6.47 |
| 5/23/00 | 6.435 |
| 5/22/00 | 6.439 |
| 5/19/00 | 6.494 |
| 5/18/00 | 6.54 |
| 5/17/00 | 6.496 |
| 5/16/00 | 6.424 |
| 5/15/00 | 6.446 |
| 5/12/00 | 6.512 |
| 5/11/00 | 6.409 |
| 5/10/00 | 6.42 |
| 5/9/00 | 6.529 |
| 5/8/00 | 6.56 |
| 5/5/00 | 6.505 |
| 5/4/00 | 6.427 |
| 5/3/00 | 6.401 |
| 5/2/00 | 6.299 |
| 5/1/00 | 6.278 |
| 4/28/00 | 6.212 |
| 4/27/00 | 6.223 |
| 4/26/00 | 6.13 |
| 4/25/00 | 6.128 |
| 4/24/00 | 6.017 |
| 4/20/00 | 5.994 |
| 4/19/00 | 5.992 |
| 4/18/00 | 6.059 |
| 4/17/00 | 6.038 |
| 4/14/00 | 5.85 |
| 4/13/00 | 5.906 |
| 4/12/00 | 5.935 |
| 4/11/00 | 5.882 |
| 4/10/00 | 5.771 |
| 4/7/00 | 5.853 |
| 4/6/00 | 5.934 |
| 4/5/00 | 5.872 |
| 4/4/00 | 5.895 |
| 4/3/00 | 5.965 |
| 3/31/00 | 6.004 |
| 3/30/00 | 6.055 |
| 3/29/00 | 6.147 |
| 3/28/00 | 6.151 |
| 3/27/00 | 6.185 |
| 3/24/00 | 6.191 |
| 3/23/00 | 6.078 |
| 3/22/00 | 6.112 |
| 3/21/00 | 6.135 |
| 3/20/00 | 6.183 |
| 3/17/00 | 6.194 |
| 3/16/00 | 6.245 |
| 3/15/00 | 6.291 |
| 3/14/00 | 6.292 |
| 3/13/00 | 6.37 |
| 3/10/00 | 6.383 |
| 3/9/00 | 6.343 |
| 3/8/00 | 6.379 |
| 3/7/00 | 6.373 |
| 3/6/00 | 6.411 |
| 3/3/00 | 6.388 |
| 3/2/00 | 6.384 |
| 3/1/00 | 6.386 |
| 2/29/00 | 6.409 |
| 2/28/00 | 6.422 |
| 2/25/00 | 6.326 |
| 2/24/00 | 6.365 |
| 2/23/00 | 6.422 |
| 2/22/00 | 6.361 |
| 2/18/00 | 6.489 |
| 2/17/00 | 6.567 |
| 2/16/00 | 6.545 |
| 2/15/00 | 6.552 |
| 2/14/00 | 6.554 |
| 2/11/00 | 6.604 |
| 2/10/00 | 6.671 |
| 2/9/00 | 6.66 |
| 2/8/00 | 6.613 |
| 2/7/00 | 6.639 |
| 2/4/00 | 6.549 |
| 2/3/00 | 6.489 |
| 2/2/00 | 6.573 |
| 2/1/00 | 6.619 |
| 1/31/00 | 6.665 |
| 1/28/00 | 6.658 |
| 1/27/00 | 6.692 |
| 1/26/00 | 6.664 |
| 1/25/00 | 6.692 |
| 1/24/00 | 6.685 |
| 1/21/00 | 6.765 |
| 1/20/00 | 6.788 |
| 1/19/00 | 6.732 |
| 1/18/00 | 6.748 |
| 1/14/00 | 6.679 |
| 1/13/00 | 6.63 |
| 1/12/00 | 6.703 |
| 1/11/00 | 6.657 |
| 1/10/00 | 6.552 |
| 1/7/00 | 6.515 |
| 1/6/00 | 6.524 |
| 1/5/00 | 6.594 |
| 1/4/00 | 6.497 |
| 1/3/00 | 6.592 |
| 12/31/99 | 6.442 |
| 12/30/99 | 6.366 |
| 12/29/99 | 6.384 |
| 12/28/99 | 6.413 |
| 12/27/99 | 6.401 |
| 12/23/99 | 6.415 |
| 12/22/99 | 6.372 |
| 12/21/99 | 6.376 |
| 12/20/99 | 6.354 |
| 12/17/99 | 6.283 |
| 12/16/99 | 6.305 |
| 12/15/99 | 6.236 |
| 12/14/99 | 6.216 |
| 12/13/99 | 6.1 |
| 12/10/99 | 6.072 |
| 12/9/99 | 6.126 |
| 12/8/99 | 6.135 |
| 12/7/99 | 6.1 |
| 12/6/99 | 6.139 |
| 12/3/99 | 6.161 |
| 12/2/99 | 6.233 |
| 12/1/99 | 6.2 |
| 11/30/99 | 6.191 |
| 11/29/99 | 6.207 |
| 11/26/99 | 6.117 |
| 11/24/99 | 6.078 |
| 11/23/99 | 6.078 |
| 11/22/99 | 6.085 |
| 11/19/99 | 6.057 |
| 11/18/99 | 6.052 |
| 11/17/99 | 6.033 |
| 11/16/99 | 5.958 |
| 11/15/99 | 5.92 |
| 11/12/99 | 5.928 |
| 11/10/99 | 5.977 |
| 11/9/99 | 5.956 |
| 11/8/99 | 5.937 |
| 11/5/99 | 5.926 |
| 11/4/99 | 5.958 |
| 11/3/99 | 5.994 |
| 11/2/99 | 6.018 |
| 11/1/99 | 6.048 |
| 10/29/99 | 6.024 |
| 10/28/99 | 6.121 |
| 10/27/99 | 6.201 |
| 10/26/99 | 6.238 |
| 10/25/99 | 6.205 |
| 10/22/99 | 6.194 |
| 10/21/99 | 6.19 |
| 10/20/99 | 6.173 |
| 10/19/99 | 6.179 |
| 10/18/99 | 6.144 |
| 10/15/99 | 6.067 |
| 10/14/99 | 6.17 |
| 10/13/99 | 6.108 |
| 10/12/99 | 6.048 |
| 10/8/99 | 6.033 |
| 10/7/99 | 6.039 |
| 10/6/99 | 6.039 |
| 10/5/99 | 6.033 |
| 10/4/99 | 5.931 |
| 10/1/99 | 5.974 |
| 9/30/99 | 5.877 |
| 9/29/99 | 5.957 |
| 9/28/99 | 5.906 |
| 9/27/99 | 5.82 |
| 9/24/99 | 5.773 |
| 9/23/99 | 5.791 |
| 9/22/99 | 5.908 |
| 9/21/99 | 5.925 |
| 9/20/99 | 5.906 |
| 9/17/99 | 5.871 |
| 9/16/99 | 5.898 |
| 9/15/99 | 5.919 |
| 9/14/99 | 5.959 |
| 9/13/99 | 5.898 |
| 9/10/99 | 5.898 |
| 9/9/99 | 5.964 |
| 9/8/99 | 5.926 |
| 9/7/99 | 5.938 |
| 9/3/99 | 5.888 |
| 9/2/99 | 6.008 |
| 9/1/99 | 5.976 |
| 8/31/99 | 5.97 |
| 8/30/99 | 5.955 |
| 8/27/99 | 5.864 |
| 8/26/99 | 5.768 |
| 8/25/99 | 5.719 |
| 8/24/99 | 5.816 |
| 8/23/99 | 5.889 |
| 8/20/99 | 5.876 |
| 8/19/99 | 5.895 |
| 8/18/99 | 5.875 |
| 8/17/99 | 5.881 |
| 8/16/99 | 5.964 |
| 8/13/99 | 5.979 |
| 8/12/99 | 6.082 |
| 8/11/99 | 6.092 |
| 8/10/99 | 6.149 |
| 8/9/99 | 6.129 |
| 8/6/99 | 6.038 |
| 8/5/99 | 5.86 |
| 8/4/99 | 5.938 |
| 8/3/99 | 5.957 |
| 8/2/99 | 5.916 |
| 7/30/99 | 5.903 |
| 7/29/99 | 5.872 |
| 7/28/99 | 5.795 |
| 7/27/99 | 5.807 |
| 7/26/99 | 5.842 |
| 7/23/99 | 5.835 |
| 7/22/99 | 5.779 |
| 7/21/99 | 5.656 |
| 7/20/99 | 5.633 |
| 7/19/99 | 5.662 |
| 7/16/99 | 5.667 |
| 7/15/99 | 5.724 |
| 7/14/99 | 5.732 |
| 7/13/99 | 5.705 |
| 7/12/99 | 5.726 |
| 7/9/99 | 5.826 |
| 7/8/99 | 5.826 |
| 7/7/99 | 5.892 |
| 7/6/99 | 5.868 |
| 7/2/99 | 5.828 |
| 7/1/99 | 5.84 |
| 6/30/99 | 5.78 |
| 6/29/99 | 5.926 |
| 6/28/99 | 5.943 |
| 6/25/99 | 6.014 |
| 6/24/99 | 6.029 |
| 6/23/99 | 6.029 |
| 6/22/99 | 5.923 |
| 6/21/99 | 5.885 |
| 6/18/99 | 5.827 |
| 6/17/99 | 5.788 |
| 6/16/99 | 5.925 |
| 6/15/99 | 5.977 |
| 6/14/99 | 5.966 |
| 6/11/99 | 6.033 |
| 6/10/99 | 5.931 |
| 6/9/99 | 5.888 |
| 6/8/99 | 5.824 |
| 6/7/99 | 5.792 |
| 6/4/99 | 5.807 |
| 6/3/99 | 5.803 |
| 6/2/99 | 5.781 |
| 6/1/99 | 5.758 |
| 5/28/99 | 5.62 |
| 5/27/99 | 5.626 |
| 5/26/99 | 5.551 |
| 5/25/99 | 5.473 |
| 5/24/99 | 5.479 |
| 5/21/99 | 5.504 |
| 5/20/99 | 5.591 |
| 5/19/99 | 5.595 |
| 5/18/99 | 5.661 |
| 5/17/99 | 5.636 |
| 5/14/99 | 5.628 |
| 5/13/99 | 5.412 |
| 5/12/99 | 5.57 |
| 5/11/99 | 5.578 |
| 5/10/99 | 5.534 |
| 5/7/99 | 5.542 |
| 5/6/99 | 5.511 |
| 5/5/99 | 5.394 |
| 5/4/99 | 5.405 |
| 5/3/99 | 5.359 |
| 4/30/99 | 5.348 |
| 4/29/99 | 5.216 |
| 4/28/99 | 5.263 |
| 4/27/99 | 5.205 |
| 4/26/99 | 5.222 |
| 4/23/99 | 5.252 |
| 4/22/99 | 5.247 |
| 4/21/99 | 5.181 |
| 4/20/99 | 5.136 |
| 4/19/99 | 5.149 |
| 4/16/99 | 5.221 |
| 4/15/99 | 5.169 |
| 4/14/99 | 5.127 |
| 4/13/99 | 5.103 |
| 4/12/99 | 5.051 |
| 4/9/99 | 5.053 |
| 4/8/99 | 5.036 |
| 4/7/99 | 5.122 |
| 4/6/99 | 5.124 |
| 4/5/99 | 5.19 |
| 4/1/99 | 5.279 |
| 3/31/99 | 5.242 |
| 3/30/99 | 5.191 |
| 3/29/99 | 5.259 |
| 3/26/99 | 5.199 |
| 3/25/99 | 5.214 |
| 3/24/99 | 5.156 |
| 3/23/99 | 5.156 |
| 3/22/99 | 5.199 |
| 3/19/99 | 5.184 |
| 3/18/99 | 5.103 |
| 3/17/99 | 5.122 |
| 3/16/99 | 5.107 |
| 3/15/99 | 5.147 |
| 3/12/99 | 5.147 |
| 3/11/99 | 5.2 |
| 3/10/99 | 5.191 |
| 3/9/99 | 5.172 |
| 3/8/99 | 5.263 |
| 3/5/99 | 5.314 |
| 3/4/99 | 5.419 |
| 3/3/99 | 5.384 |
| 3/2/99 | 5.32 |
| 3/1/99 | 5.39 |
| 2/26/99 | 5.287 |
| 2/25/99 | 5.349 |
| 2/24/99 | 5.175 |
| 2/23/99 | 5.11 |
| 2/22/99 | 5.014 |
| 2/19/99 | 5.074 |
| 2/18/99 | 5.053 |
| 2/17/99 | 4.97 |
| 2/16/99 | 5.013 |
| 2/12/99 | 5.053 |
| 2/11/99 | 4.92 |
| 2/10/99 | 4.93 |
| 2/9/99 | 4.881 |
| 2/8/99 | 4.92 |
| 2/5/99 | 4.941 |
| 2/4/99 | 4.877 |
| 2/3/99 | 4.826 |
| 2/2/99 | 4.798 |
| 2/1/99 | 4.753 |
| 1/29/99 | 4.651 |
| 1/28/99 | 4.659 |
| 1/27/99 | 4.673 |
| 1/26/99 | 4.693 |
| 1/25/99 | 4.661 |
| 1/22/99 | 4.623 |
| 1/21/99 | 4.679 |
| 1/20/99 | 4.747 |
| 1/19/99 | 4.713 |
| 1/15/99 | 4.685 |
| 1/14/99 | 4.61 |
| 1/13/99 | 4.705 |
| 1/12/99 | 4.816 |
| 1/11/99 | 4.925 |
| 1/8/99 | 4.87 |
| 1/7/99 | 4.771 |
| 1/6/99 | 4.707 |
| 1/5/99 | 4.743 |
| 1/4/99 | 4.675 |
| 12/31/98 | 4.648 |
| 12/30/98 | 4.642 |
| 12/29/98 | 4.678 |
| 12/28/98 | 4.753 |
| 12/24/98 | 4.85 |
| 12/23/98 | 4.797 |
| 12/22/98 | 4.7 |
| 12/21/98 | 4.638 |
| 12/18/98 | 4.562 |
| 12/17/98 | 4.577 |
| 12/16/98 | 4.54 |
| 12/15/98 | 4.621 |
| 12/14/98 | 4.572 |
| 12/11/98 | 4.615 |
| 12/10/98 | 4.523 |
| 12/9/98 | 4.568 |
| 12/8/98 | 4.593 |
| 12/7/98 | 4.664 |
| 12/4/98 | 4.627 |
| 12/3/98 | 4.539 |
| 12/2/98 | 4.59 |
| 12/1/98 | 4.649 |
| 11/30/98 | 4.714 |
| 11/27/98 | 4.808 |
| 11/25/98 | 4.832 |
| 11/24/98 | 4.832 |
| 11/23/98 | 4.854 |
| 11/20/98 | 4.814 |
| 11/19/98 | 4.848 |
| 11/18/98 | 4.844 |
| 11/17/98 | 4.872 |
| 11/16/98 | 4.864 |
| 11/13/98 | 4.81 |
| 11/12/98 | 4.78 |
| 11/10/98 | 4.826 |
| 11/9/98 | 4.86 |
| 11/6/98 | 4.94 |
| 11/5/98 | 4.848 |
| 11/4/98 | 4.885 |
| 11/3/98 | 4.736 |
| 11/2/98 | 4.764 |
| 10/30/98 | 4.605 |
| 10/29/98 | 4.499 |
| 10/28/98 | 4.557 |
| 10/27/98 | 4.604 |
| 10/26/98 | 4.671 |
| 10/23/98 | 4.703 |
| 10/22/98 | 4.615 |
| 10/21/98 | 4.571 |
| 10/20/98 | 4.575 |
| 10/19/98 | 4.471 |
| 10/16/98 | 4.444 |
| 10/15/98 | 4.399 |
| 10/14/98 | 4.609 |
| 10/13/98 | 4.722 |
| 10/9/98 | 4.784 |
| 10/8/98 | 4.56 |
| 10/7/98 | 4.401 |
| 10/6/98 | 4.197 |
| 10/5/98 | 4.162 |
| 10/2/98 | 4.28 |
| 10/1/98 | 4.298 |
| 9/30/98 | 4.42 |
| 9/29/98 | 4.566 |
| 9/28/98 | 4.589 |
| 9/25/98 | 4.56 |
| 9/24/98 | 4.63 |
| 9/23/98 | 4.668 |
| 9/22/98 | 4.709 |
| 9/21/98 | 4.674 |
| 9/18/98 | 4.695 |
| 9/17/98 | 4.776 |
| 9/16/98 | 4.871 |
| 9/15/98 | 4.887 |
| 9/14/98 | 4.857 |
| 9/11/98 | 4.83 |
| 9/10/98 | 4.781 |
| 9/9/98 | 4.921 |
| 9/8/98 | 5.061 |
| 9/4/98 | 5.013 |
| 9/3/98 | 5.028 |
| 9/2/98 | 5.068 |
| 9/1/98 | 5.062 |
| 8/31/98 | 4.976 |
| 8/28/98 | 5.062 |
| 8/27/98 | 5.073 |
| 8/26/98 | 5.198 |
| 8/25/98 | 5.232 |
| 8/24/98 | 5.288 |
| 8/21/98 | 5.288 |
| 8/20/98 | 5.376 |
| 8/19/98 | 5.407 |
| 8/18/98 | 5.407 |
| 8/17/98 | 5.388 |
| 8/14/98 | 5.389 |
| 8/13/98 | 5.438 |
| 8/12/98 | 5.381 |
| 8/11/98 | 5.378 |
| 8/10/98 | 5.405 |
| 8/7/98 | 5.399 |
| 8/6/98 | 5.441 |
| 8/5/98 | 5.441 |
| 8/4/98 | 5.41 |
| 8/3/98 | 5.449 |
| 7/31/98 | 5.494 |
| 7/30/98 | 5.499 |
| 7/29/98 | 5.522 |
| 7/28/98 | 5.491 |
| 7/27/98 | 5.47 |
| 7/24/98 | 5.458 |
| 7/23/98 | 5.433 |
| 7/22/98 | 5.456 |
| 7/21/98 | 5.433 |
| 7/20/98 | 5.47 |
| 7/17/98 | 5.507 |
| 7/16/98 | 5.497 |
| 7/15/98 | 5.479 |
| 7/14/98 | 5.485 |
| 7/13/98 | 5.47 |
| 7/10/98 | 5.411 |
| 7/9/98 | 5.403 |
| 7/8/98 | 5.43 |
| 7/7/98 | 5.417 |
| 7/6/98 | 5.389 |
| 7/2/98 | 5.409 |
| 7/1/98 | 5.432 |
| 6/30/98 | 5.446 |
| 6/29/98 | 5.459 |
| 6/26/98 | 5.448 |
| 6/25/98 | 5.465 |
| 6/24/98 | 5.465 |
| 6/23/98 | 5.451 |
| 6/22/98 | 5.467 |
| 6/19/98 | 5.461 |
| 6/18/98 | 5.5 |
| 6/17/98 | 5.544 |
| 6/16/98 | 5.443 |
| 6/15/98 | 5.349 |
| 6/12/98 | 5.427 |
| 6/11/98 | 5.443 |
| 6/10/98 | 5.509 |
| 6/9/98 | 5.585 |
| 6/8/98 | 5.569 |
| 6/5/98 | 5.575 |
| 6/4/98 | 5.587 |
| 6/3/98 | 5.548 |
| 6/2/98 | 5.55 |
| 6/1/98 | 5.528 |
| 5/29/98 | 5.552 |
| 5/28/98 | 5.569 |
| 5/27/98 | 5.577 |
| 5/26/98 | 5.569 |
| 5/22/98 | 5.635 |
| 5/21/98 | 5.65 |
| 5/20/98 | 5.61 |
| 5/19/98 | 5.652 |
| 5/18/98 | 5.644 |
| 5/15/98 | 5.683 |
| 5/14/98 | 5.683 |
| 5/13/98 | 5.667 |
| 5/12/98 | 5.71 |
| 5/11/98 | 5.767 |
| 5/8/98 | 5.706 |
| 5/7/98 | 5.678 |
| 5/6/98 | 5.648 |
| 5/5/98 | 5.712 |
| 5/4/98 | 5.659 |
| 5/1/98 | 5.656 |
| 4/30/98 | 5.671 |
| 4/29/98 | 5.812 |
| 4/28/98 | 5.803 |
| 4/27/98 | 5.784 |
| 4/24/98 | 5.66 |
| 4/23/98 | 5.696 |
| 4/22/98 | 5.671 |
| 4/21/98 | 5.671 |
| 4/20/98 | 5.641 |
| 4/17/98 | 5.587 |
| 4/16/98 | 5.58 |
| 4/15/98 | 5.593 |
| 4/14/98 | 5.61 |
| 4/13/98 | 5.648 |
| 4/9/98 | 5.58 |
| 4/8/98 | 5.574 |
| 4/7/98 | 5.53 |
| 4/6/98 | 5.507 |
| 4/3/98 | 5.48 |
| 4/2/98 | 5.543 |
| 4/1/98 | 5.587 |
| 3/31/98 | 5.654 |
| 3/30/98 | 5.706 |
| 3/27/98 | 5.683 |
| 3/26/98 | 5.689 |
| 3/25/98 | 5.641 |
| 3/24/98 | 5.57 |
| 3/23/98 | 5.57 |
| 3/20/98 | 5.564 |
| 3/19/98 | 5.576 |
| 3/18/98 | 5.572 |
| 3/17/98 | 5.557 |
| 3/16/98 | 5.539 |
| 3/13/98 | 5.58 |
| 3/12/98 | 5.559 |
| 3/11/98 | 5.63 |
| 3/10/98 | 5.653 |
| 3/9/98 | 5.655 |
| 3/6/98 | 5.714 |
| 3/5/98 | 5.775 |
| 3/4/98 | 5.72 |
| 3/3/98 | 5.775 |
| 3/2/98 | 5.697 |
| 2/27/98 | 5.622 |
| 2/26/98 | 5.655 |
| 2/25/98 | 5.614 |
| 2/24/98 | 5.664 |
| 2/23/98 | 5.578 |
| 2/20/98 | 5.543 |
| 2/19/98 | 5.51 |
| 2/18/98 | 5.486 |
| 2/17/98 | 5.438 |
| 2/13/98 | 5.484 |
| 2/12/98 | 5.514 |
| 2/11/98 | 5.571 |
| 2/10/98 | 5.628 |
| 2/9/98 | 5.644 |
| 2/6/98 | 5.617 |
| 2/5/98 | 5.634 |
| 2/4/98 | 5.551 |
| 2/3/98 | 5.555 |
| 2/2/98 | 5.574 |
| 1/30/98 | 5.505 |
| 1/29/98 | 5.566 |
| 1/28/98 | 5.691 |
| 1/27/98 | 5.687 |
| 1/26/98 | 5.625 |
| 1/23/98 | 5.687 |
| 1/22/98 | 5.567 |
| 1/21/98 | 5.538 |
| 1/20/98 | 5.577 |
| 1/16/98 | 5.532 |
| 1/15/98 | 5.458 |
| 1/14/98 | 5.452 |
| 1/13/98 | 5.435 |
| 1/12/98 | 5.364 |
| 1/9/98 | 5.413 |
| 1/8/98 | 5.471 |
| 1/7/98 | 5.529 |
| 1/6/98 | 5.467 |
| 1/5/98 | 5.506 |
| 1/2/98 | 5.647 |
| 12/31/97 | 5.742 |
| 12/30/97 | 5.792 |
| 12/29/97 | 5.759 |
| 12/26/97 | 5.738 |
| 12/24/97 | 5.744 |
| 12/23/97 | 5.7 |
| 12/22/97 | 5.711 |
| 12/19/97 | 5.736 |
| 12/18/97 | 5.749 |
| 12/17/97 | 5.808 |
| 12/16/97 | 5.774 |
| 12/15/97 | 5.778 |
| 12/12/97 | 5.728 |
| 12/11/97 | 5.793 |
| 12/10/97 | 5.878 |
| 12/9/97 | 5.924 |
| 12/8/97 | 5.956 |
| 12/5/97 | 5.914 |
| 12/4/97 | 5.846 |
| 12/3/97 | 5.819 |
| 12/2/97 | 5.853 |
| 12/1/97 | 5.853 |
| 11/28/97 | 5.874 |
| 11/26/97 | 5.853 |
| 11/25/97 | 5.847 |
| 11/24/97 | 5.836 |
| 11/21/97 | 5.811 |
| 11/20/97 | 5.847 |
| 11/19/97 | 5.82 |
| 11/18/97 | 5.841 |
| 11/17/97 | 5.832 |
| 11/14/97 | 5.879 |
| 11/13/97 | 5.849 |
| 11/12/97 | 5.852 |
| 11/10/97 | 5.898 |
| 11/7/97 | 5.902 |
| 11/6/97 | 5.879 |
| 11/5/97 | 5.909 |
| 11/4/97 | 5.951 |
| 11/3/97 | 5.905 |
| 10/31/97 | 5.831 |
| 10/30/97 | 5.813 |
| 10/29/97 | 5.88 |
| 10/28/97 | 5.985 |
| 10/27/97 | 5.8 |
| 10/24/97 | 5.981 |
| 10/23/97 | 6.011 |
| 10/22/97 | 6.126 |
| 10/21/97 | 6.126 |
| 10/20/97 | 6.141 |
| 10/17/97 | 6.158 |
| 10/16/97 | 6.092 |
| 10/15/97 | 6.104 |
| 10/14/97 | 6.064 |
| 10/10/97 | 6.143 |
| 10/9/97 | 6.073 |
| 10/8/97 | 6.088 |
| 10/7/97 | 5.923 |
| 10/6/97 | 5.956 |
| 10/3/97 | 5.988 |
| 10/2/97 | 5.997 |
| 10/1/97 | 6.035 |
| 9/30/97 | 6.103 |
| 9/29/97 | 6.096 |
| 9/26/97 | 6.081 |
| 9/25/97 | 6.126 |
| 9/24/97 | 6.037 |
| 9/23/97 | 6.094 |
| 9/22/97 | 6.058 |
| 9/19/97 | 6.092 |
| 9/18/97 | 6.114 |
| 9/17/97 | 6.101 |
| 9/16/97 | 6.103 |
| 9/15/97 | 6.276 |
| 9/12/97 | 6.283 |
| 9/11/97 | 6.391 |
| 9/10/97 | 6.365 |
| 9/9/97 | 6.332 |
| 9/8/97 | 6.326 |
| 9/5/97 | 6.35 |
| 9/4/97 | 6.33 |
| 9/3/97 | 6.326 |
| 9/2/97 | 6.28 |
| 8/29/97 | 6.339 |
| 8/28/97 | 6.293 |
| 8/27/97 | 6.373 |
| 8/26/97 | 6.367 |
| 8/25/97 | 6.386 |
| 8/22/97 | 6.358 |
| 8/21/97 | 6.328 |
| 8/20/97 | 6.242 |
| 8/19/97 | 6.21 |
| 8/18/97 | 6.21 |
| 8/15/97 | 6.236 |
| 8/14/97 | 6.255 |
| 8/13/97 | 6.343 |
| 8/12/97 | 6.401 |
| 8/11/97 | 6.362 |
| 8/8/97 | 6.367 |
| 8/7/97 | 6.244 |
| 8/6/97 | 6.214 |
| 8/5/97 | 6.231 |
| 8/4/97 | 6.218 |
| 8/1/97 | 6.18 |
| 7/31/97 | 6.011 |
| 7/30/97 | 6.042 |
| 7/29/97 | 6.105 |
| 7/28/97 | 6.13 |
| 7/25/97 | 6.179 |
| 7/24/97 | 6.156 |
| 7/23/97 | 6.152 |
| 7/22/97 | 6.124 |
| 7/21/97 | 6.257 |
| 7/18/97 | 6.243 |
| 7/17/97 | 6.196 |
| 7/16/97 | 6.186 |
| 7/15/97 | 6.251 |
| 7/14/97 | 6.254 |
| 7/11/97 | 6.22 |
| 7/10/97 | 6.254 |
| 7/9/97 | 6.252 |
| 7/8/97 | 6.265 |
| 7/7/97 | 6.258 |
| 7/3/97 | 6.305 |
| 7/2/97 | 6.406 |
| 7/1/97 | 6.44 |
| 6/30/97 | 6.5 |
| 6/27/97 | 6.451 |
| 6/26/97 | 6.49 |
| 6/25/97 | 6.445 |
| 6/24/97 | 6.406 |
| 6/23/97 | 6.421 |
| 6/20/97 | 6.374 |
| 6/19/97 | 6.392 |
| 6/18/97 | 6.392 |
| 6/17/97 | 6.43 |
| 6/16/97 | 6.398 |
| 6/13/97 | 6.426 |
| 6/12/97 | 6.486 |
| 6/11/97 | 6.579 |
| 6/10/97 | 6.568 |
| 6/9/97 | 6.542 |
| 6/6/97 | 6.486 |
| 6/5/97 | 6.612 |
| 6/4/97 | 6.625 |
| 6/3/97 | 6.616 |
| 6/2/97 | 6.655 |
| 5/30/97 | 6.659 |
| 5/29/97 | 6.738 |
| 5/28/97 | 6.793 |
| 5/27/97 | 6.791 |
| 5/23/97 | 6.74 |
| 5/22/97 | 6.749 |
| 5/21/97 | 6.725 |
| 5/20/97 | 6.677 |
| 5/19/97 | 6.71 |
| 5/16/97 | 6.719 |
| 5/15/97 | 6.66 |
| 5/14/97 | 6.666 |
| 5/13/97 | 6.717 |
| 5/12/97 | 6.66 |
| 5/9/97 | 6.669 |
| 5/8/97 | 6.73 |
| 5/7/97 | 6.752 |
| 5/6/97 | 6.66 |
| 5/5/97 | 6.649 |
| 5/2/97 | 6.644 |
| 5/1/97 | 6.678 |
| 4/30/97 | 6.718 |
| 4/29/97 | 6.758 |
| 4/28/97 | 6.908 |
| 4/25/97 | 6.938 |
| 4/24/97 | 6.931 |
| 4/23/97 | 6.878 |
| 4/22/97 | 6.83 |
| 4/21/97 | 6.866 |
| 4/18/97 | 6.825 |
| 4/17/97 | 6.846 |
| 4/16/97 | 6.886 |
| 4/15/97 | 6.873 |
| 4/14/97 | 6.975 |
| 4/11/97 | 6.968 |
| 4/10/97 | 6.906 |
| 4/9/97 | 6.895 |
| 4/8/97 | 6.89 |
| 4/7/97 | 6.856 |
| 4/4/97 | 6.906 |
| 4/3/97 | 6.853 |
| 4/2/97 | 6.86 |
| 4/1/97 | 6.873 |
| 3/31/97 | 6.903 |
| 3/27/97 | 6.909 |
| 3/26/97 | 6.778 |
| 3/25/97 | 6.762 |
| 3/24/97 | 6.704 |
| 3/21/97 | 6.751 |
| 3/20/97 | 6.728 |
| 3/19/97 | 6.739 |
| 3/18/97 | 6.714 |
| 3/17/97 | 6.714 |
| 3/14/97 | 6.692 |
| 3/13/97 | 6.703 |
| 3/12/97 | 6.61 |
| 3/11/97 | 6.577 |
| 3/10/97 | 6.544 |
| 3/7/97 | 6.539 |
| 3/6/97 | 6.625 |
| 3/5/97 | 6.568 |
| 3/4/97 | 6.601 |
| 3/3/97 | 6.568 |
| 2/28/97 | 6.552 |
| 2/27/97 | 6.554 |
| 2/26/97 | 6.532 |
| 2/25/97 | 6.391 |
| 2/24/97 | 6.385 |
| 2/21/97 | 6.368 |
| 2/20/97 | 6.387 |
| 2/19/97 | 6.314 |
| 2/18/97 | 6.273 |
| 2/14/97 | 6.265 |
| 2/13/97 | 6.308 |
| 2/12/97 | 6.413 |
| 2/11/97 | 6.406 |
| 2/10/97 | 6.396 |
| 2/7/97 | 6.398 |
| 2/6/97 | 6.466 |
| 2/5/97 | 6.466 |
| 2/4/97 | 6.424 |
| 2/3/97 | 6.448 |
| 1/31/97 | 6.494 |
| 1/30/97 | 6.587 |
| 1/29/97 | 6.618 |
| 1/28/97 | 6.635 |
| 1/27/97 | 6.671 |
| 1/24/97 | 6.622 |
| 1/23/97 | 6.589 |
| 1/22/97 | 6.556 |
| 1/21/97 | 6.509 |
| 1/17/97 | 6.542 |
| 1/16/97 | 6.553 |
| 1/15/97 | 6.518 |
| 1/14/97 | 6.514 |
| 1/13/97 | 6.613 |
| 1/10/97 | 6.608 |
| 1/9/97 | 6.503 |
| 1/8/97 | 6.591 |
| 1/7/97 | 6.544 |
| 1/6/97 | 6.531 |
| 1/3/97 | 6.498 |
| 1/2/97 | 6.514 |
| 12/31/96 | 6.418 |
| 12/30/96 | 6.3 |
| 12/27/96 | 6.291 |
| 12/26/96 | 6.338 |
| 12/24/96 | 6.34 |
| 12/23/96 | 6.338 |
| 12/20/96 | 6.36 |
| 12/19/96 | 6.328 |
| 12/18/96 | 6.464 |
| 12/17/96 | 6.412 |
| 12/16/96 | 6.367 |
| 12/13/96 | 6.313 |
| 12/12/96 | 6.377 |
| 12/11/96 | 6.386 |
| 12/10/96 | 6.222 |
| 12/9/96 | 6.184 |
| 12/6/96 | 6.243 |
| 12/5/96 | 6.228 |
| 12/4/96 | 6.102 |
| 12/3/96 | 6.056 |
| 12/2/96 | 6.056 |
| 11/29/96 | 6.044 |
| 11/27/96 | 6.121 |
| 11/26/96 | 6.134 |
| 11/25/96 | 6.128 |
| 11/22/96 | 6.139 |
| 11/21/96 | 6.13 |
| 11/20/96 | 6.133 |
| 11/19/96 | 6.158 |
| 11/18/96 | 6.196 |
| 11/15/96 | 6.183 |
| 11/14/96 | 6.146 |
| 11/13/96 | 6.196 |
| 11/12/96 | 6.186 |
| 11/8/96 | 6.249 |
| 11/7/96 | 6.22 |
| 11/6/96 | 6.29 |
| 11/5/96 | 6.268 |
| 11/4/96 | 6.343 |
| 11/1/96 | 6.377 |
| 10/31/96 | 6.339 |
| 10/30/96 | 6.411 |
| 10/29/96 | 6.384 |
| 10/28/96 | 6.556 |
| 10/25/96 | 6.536 |
| 10/24/96 | 6.573 |
| 10/23/96 | 6.547 |
| 10/22/96 | 6.569 |
| 10/21/96 | 6.517 |
| 10/18/96 | 6.504 |
| 10/17/96 | 6.498 |
| 10/16/96 | 6.556 |
| 10/15/96 | 6.549 |
| 10/11/96 | 6.554 |
| 10/10/96 | 6.608 |
| 10/9/96 | 6.547 |
| 10/8/96 | 6.544 |
| 10/7/96 | 6.523 |
| 10/4/96 | 6.478 |
| 10/3/96 | 6.592 |
| 10/2/96 | 6.594 |
| 10/1/96 | 6.638 |
| 9/30/96 | 6.703 |
| 9/27/96 | 6.677 |
| 9/26/96 | 6.662 |
| 9/25/96 | 6.688 |
| 9/24/96 | 6.751 |
| 9/23/96 | 6.819 |
| 9/20/96 | 6.839 |
| 9/19/96 | 6.847 |
| 9/18/96 | 6.819 |
| 9/17/96 | 6.826 |
| 9/16/96 | 6.725 |
| 9/13/96 | 6.723 |
| 9/12/96 | 6.874 |
| 9/11/96 | 6.92 |
| 9/10/96 | 6.923 |
| 9/9/96 | 6.879 |
| 9/6/96 | 6.923 |
| 9/5/96 | 6.985 |
| 9/4/96 | 6.927 |
| 9/3/96 | 6.883 |
| 8/30/96 | 6.943 |
| 8/29/96 | 6.848 |
| 8/28/96 | 6.781 |
| 8/27/96 | 6.774 |
| 8/26/96 | 6.798 |
| 8/23/96 | 6.751 |
| 8/22/96 | 6.62 |
| 8/21/96 | 6.611 |
| 8/20/96 | 6.571 |
| 8/19/96 | 6.577 |
| 8/16/96 | 6.554 |
| 8/15/96 | 6.599 |
| 8/14/96 | 6.574 |
| 8/13/96 | 6.584 |
| 8/12/96 | 6.476 |
| 8/9/96 | 6.481 |
| 8/8/96 | 6.549 |
| 8/7/96 | 6.547 |
| 8/6/96 | 6.536 |
| 8/5/96 | 6.538 |
| 8/2/96 | 6.509 |
| 8/1/96 | 6.639 |
| 7/31/96 | 6.794 |
| 7/30/96 | 6.876 |
| 7/29/96 | 6.935 |
| 7/26/96 | 6.85 |
| 7/25/96 | 6.846 |
| 7/24/96 | 6.872 |
| 7/23/96 | 6.805 |
| 7/22/96 | 6.836 |
| 7/19/96 | 6.794 |
| 7/18/96 | 6.732 |
| 7/17/96 | 6.84 |
| 7/16/96 | 6.845 |
| 7/15/96 | 6.888 |
| 7/12/96 | 6.856 |
| 7/11/96 | 6.882 |
| 7/10/96 | 6.914 |
| 7/9/96 | 6.989 |
| 7/8/96 | 7.051 |
| 7/5/96 | 7.015 |
| 7/3/96 | 6.772 |
| 7/2/96 | 6.794 |
| 7/1/96 | 6.748 |
| 6/28/96 | 6.711 |
| 6/27/96 | 6.832 |
| 6/26/96 | 6.893 |
| 6/25/96 | 6.889 |
| 6/24/96 | 6.935 |
| 6/21/96 | 6.946 |
| 6/20/96 | 6.964 |
| 6/19/96 | 6.951 |
| 6/18/96 | 6.935 |
| 6/17/96 | 6.898 |
| 6/14/96 | 6.931 |
| 6/13/96 | 6.997 |
| 6/12/96 | 7.062 |
| 6/11/96 | 6.989 |
| 6/10/96 | 7.004 |
| 6/7/96 | 6.9 |
| 6/6/96 | 6.739 |
| 6/5/96 | 6.8 |
| 6/4/96 | 6.854 |
| 6/3/96 | 6.867 |
| 5/31/96 | 6.852 |
| 5/30/96 | 6.793 |
| 5/29/96 | 6.787 |
| 5/28/96 | 6.672 |
| 5/24/96 | 6.651 |
| 5/23/96 | 6.679 |
| 5/22/96 | 6.63 |
| 5/21/96 | 6.66 |
| 5/20/96 | 6.647 |
| 5/17/96 | 6.652 |
| 5/16/96 | 6.729 |
| 5/15/96 | 6.643 |
| 5/14/96 | 6.643 |
| 5/13/96 | 6.716 |
| 5/10/96 | 6.747 |
| 5/9/96 | 6.849 |
| 5/8/96 | 6.736 |
| 5/7/96 | 6.855 |
| 5/6/96 | 6.841 |
| 5/3/96 | 6.895 |
| 5/2/96 | 6.859 |
| 5/1/96 | 6.672 |
| 4/30/96 | 6.67 |
| 4/29/96 | 6.598 |
| 4/26/96 | 6.525 |
| 4/25/96 | 6.531 |
| 4/24/96 | 6.584 |
| 4/23/96 | 6.515 |
| 4/22/96 | 6.483 |
| 4/19/96 | 6.517 |
| 4/18/96 | 6.557 |
| 4/17/96 | 6.523 |
| 4/16/96 | 6.482 |
| 4/15/96 | 6.464 |
| 4/12/96 | 6.5 |
| 4/11/96 | 6.666 |
| 4/10/96 | 6.663 |
| 4/9/96 | 6.544 |
| 4/8/96 | 6.604 |
| 4/4/96 | 6.346 |
| 4/3/96 | 6.257 |
| 4/2/96 | 6.224 |
| 4/1/96 | 6.281 |
| 3/29/96 | 6.327 |
| 3/28/96 | 6.398 |
| 3/27/96 | 6.336 |
| 3/26/96 | 6.236 |
| 3/25/96 | 6.238 |
| 3/22/96 | 6.329 |
| 3/21/96 | 6.284 |
| 3/20/96 | 6.302 |
| 3/19/96 | 6.415 |
| 3/18/96 | 6.419 |
| 3/15/96 | 6.453 |
| 3/14/96 | 6.352 |
| 3/13/96 | 6.358 |
| 3/12/96 | 6.356 |
| 3/11/96 | 6.329 |
| 3/8/96 | 6.407 |
| 3/7/96 | 6.071 |
| 3/6/96 | 6.051 |
| 3/5/96 | 5.946 |
| 3/4/96 | 5.901 |
| 3/1/96 | 5.959 |
| 2/29/96 | 6.098 |
| 2/28/96 | 6.088 |
| 2/27/96 | 6.068 |
| 2/26/96 | 6.019 |
| 2/23/96 | 5.959 |
| 2/22/96 | 5.903 |
| 2/21/96 | 5.965 |
| 2/20/96 | 5.984 |
| 2/16/96 | 5.779 |
| 2/15/96 | 5.699 |
| 2/14/96 | 5.635 |
| 2/13/96 | 5.576 |
| 2/12/96 | 5.592 |
| 2/9/96 | 5.66 |
| 2/8/96 | 5.654 |
| 2/7/96 | 5.669 |
| 2/6/96 | 5.655 |
| 2/5/96 | 5.69 |
| 2/2/96 | 5.667 |
| 2/1/96 | 5.597 |
| 1/31/96 | 5.58 |
| 1/30/96 | 5.616 |
| 1/29/96 | 5.684 |
| 1/26/96 | 5.634 |
| 1/25/96 | 5.693 |
| 1/24/96 | 5.614 |
| 1/23/96 | 5.655 |
| 1/22/96 | 5.61 |
| 1/19/96 | 5.528 |
| 1/18/96 | 5.524 |
| 1/17/96 | 5.575 |
| 1/16/96 | 5.627 |
| 1/12/96 | 5.737 |
| 1/11/96 | 5.775 |
| 1/10/96 | 5.817 |
| 1/9/96 | 5.744 |
| 1/8/96 | 5.681 |
| 1/5/96 | 5.673 |
| 1/4/96 | 5.646 |
| 1/3/96 | 5.574 |
| 1/2/96 | 5.591 |
| 12/29/95 | 5.572 |
| 12/28/95 | 5.624 |
| 12/27/95 | 5.655 |
| 12/26/95 | 5.684 |
| 12/22/95 | 5.709 |
| 12/21/95 | 5.744 |
| 12/20/95 | 5.769 |
| 12/19/95 | 5.753 |
| 12/18/95 | 5.855 |
| 12/15/95 | 5.759 |
| 12/14/95 | 5.753 |
| 12/13/95 | 5.749 |
| 12/12/95 | 5.724 |
| 12/11/95 | 5.708 |
| 12/8/95 | 5.722 |
| 12/7/95 | 5.731 |
| 12/6/95 | 5.675 |
| 12/5/95 | 5.677 |
| 12/4/95 | 5.638 |
| 12/1/95 | 5.706 |
| 11/30/95 | 5.741 |
| 11/29/95 | 5.829 |
| 11/28/95 | 5.879 |
| 11/27/95 | 5.877 |
| 11/24/95 | 5.908 |
| 11/22/95 | 5.935 |
| 11/21/95 | 5.947 |
| 11/20/95 | 5.93 |
| 11/17/95 | 5.905 |
| 11/16/95 | 5.906 |
| 11/15/95 | 5.981 |
| 11/14/95 | 5.945 |
| 11/13/95 | 5.956 |
| 11/10/95 | 5.996 |
| 11/9/95 | 5.958 |
| 11/8/95 | 5.929 |
| 11/7/95 | 5.977 |
| 11/6/95 | 5.957 |
| 11/3/95 | 5.934 |
| 11/2/95 | 5.891 |
| 11/1/95 | 5.978 |
| 10/31/95 | 6.02 |
| 10/30/95 | 6.035 |
| 10/27/95 | 6.041 |
| 10/26/95 | 6.066 |
| 10/25/95 | 5.998 |
| 10/24/95 | 6.01 |
| 10/23/95 | 6.073 |
| 10/20/95 | 6.04 |
| 10/19/95 | 5.969 |
| 10/18/95 | 5.99 |
| 10/17/95 | 5.934 |
| 10/16/95 | 5.951 |
| 10/13/95 | 5.959 |
| 10/12/95 | 6.039 |
| 10/11/95 | 6.085 |
| 10/10/95 | 6.089 |
| 10/6/95 | 6.064 |
| 10/5/95 | 6.071 |
| 10/4/95 | 6.089 |
| 10/3/95 | 6.119 |
| 10/2/95 | 6.14 |
| 9/29/95 | 6.182 |
| 9/28/95 | 6.267 |
| 9/27/95 | 6.263 |
| 9/26/95 | 6.261 |
| 9/25/95 | 6.246 |
| 9/22/95 | 6.24 |
| 9/21/95 | 6.202 |
| 9/20/95 | 6.108 |
| 9/19/95 | 6.139 |
| 9/18/95 | 6.177 |
| 9/15/95 | 6.129 |
| 9/14/95 | 6.098 |
| 9/13/95 | 6.181 |
| 9/12/95 | 6.156 |
| 9/11/95 | 6.224 |
| 9/8/95 | 6.222 |
| 9/7/95 | 6.222 |
| 9/6/95 | 6.184 |
| 9/5/95 | 6.18 |
| 9/1/95 | 6.231 |
| 8/31/95 | 6.284 |
| 8/30/95 | 6.33 |
| 8/29/95 | 6.356 |
| 8/28/95 | 6.339 |
| 8/25/95 | 6.352 |
| 8/24/95 | 6.463 |
| 8/23/95 | 6.579 |
| 8/22/95 | 6.553 |
| 8/21/95 | 6.528 |
| 8/18/95 | 6.556 |
| 8/17/95 | 6.564 |
| 8/16/95 | 6.539 |
| 8/15/95 | 6.552 |
| 8/14/95 | 6.577 |
| 8/11/95 | 6.612 |
| 8/10/95 | 6.504 |
| 8/9/95 | 6.476 |
| 8/8/95 | 6.459 |
| 8/7/95 | 6.461 |
| 8/4/95 | 6.489 |
| 8/3/95 | 6.518 |
| 8/2/95 | 6.433 |
| 8/1/95 | 6.472 |
| 7/31/95 | 6.426 |
| 7/28/95 | 6.472 |
| 7/27/95 | 6.422 |
| 7/26/95 | 6.461 |
| 7/25/95 | 6.403 |
| 7/24/95 | 6.444 |
| 7/21/95 | 6.529 |
| 7/20/95 | 6.409 |
| 7/19/95 | 6.405 |
| 7/18/95 | 6.298 |
| 7/17/95 | 6.221 |
| 7/14/95 | 6.158 |
| 7/13/95 | 6.086 |
| 7/12/95 | 6.089 |
| 7/11/95 | 6.116 |
| 7/10/95 | 6.041 |
| 7/7/95 | 6.045 |
| 7/6/95 | 6.033 |
| 7/5/95 | 6.182 |
| 7/3/95 | 6.209 |
| 6/30/95 | 6.203 |
| 6/29/95 | 6.246 |
| 6/28/95 | 6.084 |
| 6/27/95 | 6.142 |
| 6/26/95 | 6.115 |
| 6/23/95 | 6.049 |
| 6/22/95 | 6.022 |
| 6/21/95 | 6.116 |
| 6/20/95 | 6.162 |
| 6/19/95 | 6.137 |
| 6/16/95 | 6.196 |
| 6/15/95 | 6.177 |
| 6/14/95 | 6.152 |
| 6/13/95 | 6.117 |
| 6/12/95 | 6.357 |
| 6/9/95 | 6.394 |
| 6/8/95 | 6.264 |
| 6/7/95 | 6.186 |
| 6/6/95 | 6.088 |
| 6/5/95 | 6.074 |
| 6/2/95 | 6.097 |
| 6/1/95 | 6.199 |
| 5/31/95 | 6.284 |
| 5/30/95 | 6.277 |
| 5/26/95 | 6.394 |
| 5/25/95 | 6.377 |
| 5/24/95 | 6.414 |
| 5/23/95 | 6.553 |
| 5/22/95 | 6.629 |
| 5/19/95 | 6.627 |
| 5/18/95 | 6.593 |
| 5/17/95 | 6.543 |
| 5/16/95 | 6.543 |
| 5/15/95 | 6.616 |
| 5/12/95 | 6.664 |
| 5/11/95 | 6.675 |
| 5/10/95 | 6.672 |
| 5/9/95 | 6.596 |
| 5/8/95 | 6.693 |
| 5/5/95 | 6.681 |
| 5/4/95 | 6.859 |
| 5/3/95 | 6.932 |
| 5/2/95 | 7.017 |
| 5/1/95 | 7.063 |
| 4/28/95 | 7.055 |
| 4/27/95 | 7.04 |
| 4/26/95 | 7.009 |
| 4/25/95 | 6.99 |
| 4/24/95 | 6.988 |
| 4/21/95 | 6.999 |
| 4/20/95 | 6.999 |
| 4/19/95 | 7.034 |
| 4/18/95 | 7.036 |
| 4/17/95 | 7.025 |
| 4/13/95 | 7.017 |
| 4/12/95 | 7.05 |
| 4/11/95 | 7.081 |
| 4/10/95 | 7.111 |
| 4/7/95 | 7.103 |
| 4/6/95 | 7.066 |
| 4/5/95 | 7.101 |
| 4/4/95 | 7.125 |
| 4/3/95 | 7.13 |
| 3/31/95 | 7.196 |
| 3/30/95 | 7.161 |
| 3/29/95 | 7.13 |
| 3/28/95 | 7.137 |
| 3/27/95 | 7.047 |
| 3/24/95 | 7.078 |
| 3/23/95 | 7.183 |
| 3/22/95 | 7.192 |
| 3/21/95 | 7.181 |
| 3/20/95 | 7.12 |
| 3/17/95 | 7.107 |
| 3/16/95 | 7.094 |
| 3/15/95 | 7.086 |
| 3/14/95 | 7.105 |
| 3/13/95 | 7.178 |
| 3/10/95 | 7.22 |
| 3/9/95 | 7.273 |
| 3/8/95 | 7.337 |
| 3/7/95 | 7.429 |
| 3/6/95 | 7.413 |
| 3/3/95 | 7.342 |
| 3/2/95 | 7.287 |
| 3/1/95 | 7.223 |
| 2/28/95 | 7.201 |
| 2/27/95 | 7.214 |
| 2/24/95 | 7.307 |
| 2/23/95 | 7.327 |
| 2/22/95 | 7.33 |
| 2/21/95 | 7.443 |
| 2/17/95 | 7.421 |
| 2/16/95 | 7.403 |
| 2/15/95 | 7.417 |
| 2/14/95 | 7.489 |
| 2/13/95 | 7.599 |
| 2/10/95 | 7.61 |
| 2/9/95 | 7.576 |
| 2/8/95 | 7.509 |
| 2/7/95 | 7.513 |
| 2/6/95 | 7.533 |
| 2/3/95 | 7.497 |
| 2/2/95 | 7.658 |
| 2/1/95 | 7.658 |
| 1/31/95 | 7.581 |
| 1/30/95 | 7.638 |
| 1/27/95 | 7.613 |
| 1/26/95 | 7.748 |
| 1/25/95 | 7.796 |
| 1/24/95 | 7.847 |
| 1/23/95 | 7.824 |
| 1/20/95 | 7.807 |
| 1/19/95 | 7.741 |
| 1/18/95 | 7.698 |
| 1/17/95 | 7.68 |
| 1/13/95 | 7.675 |
| 1/12/95 | 7.794 |
| 1/11/95 | 7.783 |
| 1/10/95 | 7.833 |
| 1/9/95 | 7.872 |
| 1/6/95 | 7.858 |
| 1/5/95 | 7.854 |
| 1/4/95 | 7.815 |
| 1/3/95 | 7.875 |
| 12/30/94 | 7.822 |
| 12/29/94 | 7.797 |
| 12/28/94 | 7.792 |
| 12/27/94 | 7.758 |
| 12/23/94 | 7.829 |
| 12/22/94 | 7.836 |
| 12/21/94 | 7.797 |
| 12/20/94 | 7.8 |
| 12/19/94 | 7.806 |
| 12/16/94 | 7.802 |
| 12/15/94 | 7.802 |
| 12/14/94 | 7.8 |
| 12/13/94 | 7.82 |
| 12/12/94 | 7.859 |
| 12/9/94 | 7.789 |
| 12/8/94 | 7.796 |
| 12/7/94 | 7.798 |
| 12/6/94 | 7.732 |
| 12/5/94 | 7.828 |
| 12/2/94 | 7.803 |
| 12/1/94 | 7.924 |
| 11/30/94 | 7.906 |
| 11/29/94 | 7.931 |
| 11/28/94 | 7.879 |
| 11/25/94 | 7.792 |
| 11/23/94 | 7.815 |
| 11/22/94 | 7.904 |
| 11/21/94 | 8.01 |
| 11/18/94 | 8.008 |
| 11/17/94 | 8.01 |
| 11/16/94 | 7.964 |
| 11/15/94 | 7.916 |
| 11/14/94 | 7.918 |
| 11/10/94 | 7.983 |
| 11/9/94 | 7.965 |
| 11/8/94 | 7.982 |
| 11/7/94 | 8.03 |
| 11/4/94 | 8.023 |
| 11/3/94 | 7.955 |
| 11/2/94 | 7.953 |
| 11/1/94 | 7.902 |
| 10/31/94 | 7.807 |
| 10/28/94 | 7.793 |
| 10/27/94 | 7.873 |
| 10/26/94 | 7.885 |
| 10/25/94 | 7.856 |
| 10/24/94 | 7.849 |
| 10/21/94 | 7.785 |
| 10/20/94 | 7.796 |
| 10/19/94 | 7.669 |
| 10/18/94 | 7.641 |
| 10/17/94 | 7.602 |
| 10/14/94 | 7.597 |
| 10/13/94 | 7.643 |
| 10/12/94 | 7.697 |
| 10/11/94 | 7.648 |
| 10/7/94 | 7.69 |
| 10/6/94 | 7.769 |
| 10/5/94 | 7.762 |
| 10/4/94 | 7.683 |
| 10/3/94 | 7.657 |
| 9/30/94 | 7.603 |
| 9/29/94 | 7.617 |
| 9/28/94 | 7.576 |
| 9/27/94 | 7.601 |
| 9/26/94 | 7.559 |
| 9/23/94 | 7.562 |
| 9/22/94 | 7.545 |
| 9/21/94 | 7.566 |
| 9/20/94 | 7.511 |
| 9/19/94 | 7.488 |
| 9/16/94 | 7.499 |
| 9/15/94 | 7.331 |
| 9/14/94 | 7.397 |
| 9/13/94 | 7.415 |
| 9/12/94 | 7.452 |
| 9/9/94 | 7.431 |
| 9/8/94 | 7.28 |
| 9/7/94 | 7.28 |
| 9/6/94 | 7.255 |
| 9/2/94 | 7.198 |
| 9/1/94 | 7.169 |
| 8/31/94 | 7.173 |
| 8/30/94 | 7.196 |
| 8/29/94 | 7.229 |
| 8/26/94 | 7.227 |
| 8/25/94 | 7.272 |
| 8/24/94 | 7.205 |
| 8/23/94 | 7.285 |
| 8/22/94 | 7.319 |
| 8/19/94 | 7.256 |
| 8/18/94 | 7.274 |
| 8/17/94 | 7.174 |
| 8/16/94 | 7.148 |
| 8/15/94 | 7.299 |
| 8/12/94 | 7.29 |
| 8/11/94 | 7.355 |
| 8/10/94 | 7.295 |
| 8/9/94 | 7.304 |
| 8/8/94 | 7.281 |
| 8/5/94 | 7.272 |
| 8/4/94 | 7.108 |
| 8/3/94 | 7.077 |
| 8/2/94 | 7.102 |
| 8/1/94 | 7.108 |
| 7/29/94 | 7.111 |
| 7/28/94 | 7.279 |
| 7/27/94 | 7.34 |
| 7/26/94 | 7.259 |
| 7/25/94 | 7.243 |
| 7/22/94 | 7.277 |
| 7/21/94 | 7.25 |
| 7/20/94 | 7.223 |
| 7/19/94 | 7.138 |
| 7/18/94 | 7.185 |
| 7/15/94 | 7.248 |
| 7/14/94 | 7.232 |
| 7/13/94 | 7.392 |
| 7/12/94 | 7.418 |
| 7/11/94 | 7.461 |
| 7/8/94 | 7.415 |
| 7/7/94 | 7.3 |
| 7/6/94 | 7.286 |
| 7/5/94 | 7.297 |
| 7/1/94 | 7.322 |
| 6/30/94 | 7.32 |
| 6/29/94 | 7.228 |
| 6/28/94 | 7.232 |
| 6/27/94 | 7.165 |
| 6/24/94 | 7.206 |
| 6/23/94 | 7.081 |
| 6/22/94 | 7.108 |
| 6/21/94 | 7.204 |
| 6/20/94 | 7.161 |
| 6/17/94 | 7.124 |
| 6/16/94 | 7.036 |
| 6/15/94 | 7.089 |
| 6/14/94 | 6.994 |
| 6/13/94 | 7.065 |
| 6/10/94 | 7.016 |
| 6/9/94 | 6.96 |
| 6/8/94 | 6.953 |
| 6/7/94 | 6.94 |
| 6/6/94 | 6.908 |
| 6/3/94 | 6.988 |
| 6/2/94 | 7.054 |
| 6/1/94 | 7.118 |
| 5/31/94 | 7.147 |
| 5/27/94 | 7.114 |
| 5/26/94 | 7.097 |
| 5/25/94 | 7.108 |
| 5/24/94 | 7.165 |
| 5/23/94 | 7.185 |
| 5/20/94 | 7.02 |
| 5/19/94 | 6.953 |
| 5/18/94 | 7.016 |
| 5/17/94 | 7.042 |
| 5/16/94 | 7.23 |
| 5/13/94 | 7.279 |
| 5/12/94 | 7.352 |
| 5/11/94 | 7.441 |
| 5/10/94 | 7.319 |
| 5/9/94 | 7.48 |
| 5/6/94 | 7.348 |
| 5/5/94 | 7.114 |
| 5/4/94 | 7.116 |
| 5/3/94 | 7.114 |
| 5/2/94 | 7.09 |
| 4/29/94 | 7.042 |
| 4/28/94 | 6.987 |
| 4/27/94 | 6.827 |
| 4/26/94 | 6.822 |
| 4/25/94 | 6.866 |
| 4/22/94 | 6.933 |
| 4/21/94 | 6.897 |
| 4/20/94 | 7.03 |
| 4/19/94 | 7.084 |
| 4/18/94 | 7.138 |
| 4/15/94 | 6.957 |
| 4/14/94 | 6.959 |
| 4/13/94 | 6.921 |
| 4/12/94 | 6.875 |
| 4/11/94 | 6.902 |
| 4/8/94 | 6.923 |
| 4/7/94 | 6.867 |
| 4/6/94 | 6.908 |
| 4/5/94 | 6.936 |
| 4/4/94 | 7.14 |
| 3/31/94 | 6.738 |
| 3/30/94 | 6.767 |
| 3/29/94 | 6.721 |
| 3/28/94 | 6.617 |
| 3/25/94 | 6.634 |
| 3/24/94 | 6.553 |
| 3/23/94 | 6.488 |
| 3/22/94 | 6.431 |
| 3/21/94 | 6.566 |
| 3/18/94 | 6.497 |
| 3/17/94 | 6.401 |
| 3/16/94 | 6.364 |
| 3/15/94 | 6.448 |
| 3/14/94 | 6.516 |
| 3/11/94 | 6.452 |
| 3/10/94 | 6.494 |
| 3/9/94 | 6.352 |
| 3/8/94 | 6.385 |
| 3/7/94 | 6.317 |
| 3/4/94 | 6.365 |
| 3/3/94 | 6.337 |
| 3/2/94 | 6.254 |
| 3/1/94 | 6.28 |
| 2/28/94 | 6.129 |
| 2/25/94 | 6.195 |
| 2/24/94 | 6.212 |
| 2/23/94 | 6.129 |
| 2/22/94 | 6.052 |
| 2/18/94 | 6.086 |
| 2/17/94 | 5.992 |
| 2/16/94 | 5.892 |
| 2/15/94 | 5.875 |
| 2/14/94 | 5.89 |
| 2/11/94 | 5.879 |
| 2/10/94 | 5.927 |
| 2/9/94 | 5.923 |
| 2/8/94 | 5.983 |
| 2/7/94 | 5.932 |
| 2/4/94 | 5.871 |
| 2/3/94 | 5.773 |
| 2/2/94 | 5.709 |
| 2/1/94 | 5.739 |
| 1/31/94 | 5.642 |
| 1/28/94 | 5.634 |
| 1/27/94 | 5.674 |
| 1/26/94 | 5.715 |
| 1/25/94 | 5.743 |
| 1/24/94 | 5.702 |
| 1/21/94 | 5.681 |
| 1/20/94 | 5.666 |
| 1/19/94 | 5.713 |
| 1/18/94 | 5.691 |
| 1/14/94 | 5.726 |
| 1/13/94 | 5.679 |
| 1/12/94 | 5.568 |
| 1/11/94 | 5.621 |
| 1/10/94 | 5.647 |
| 1/7/94 | 5.651 |
| 1/6/94 | 5.803 |
| 1/5/94 | 5.869 |
| 1/4/94 | 5.828 |
| 1/3/94 | 5.908 |
| 12/31/93 | 5.794 |
| 12/30/93 | 5.789 |
| 12/29/93 | 5.696 |
| 12/28/93 | 5.679 |
| 12/27/93 | 5.685 |
| 12/23/93 | 5.691 |
| 12/22/93 | 5.708 |
| 12/21/93 | 5.815 |
| 12/20/93 | 5.806 |
| 12/17/93 | 5.764 |
| 12/16/93 | 5.813 |
| 12/15/93 | 5.796 |
| 12/14/93 | 5.815 |
| 12/13/93 | 5.761 |
| 12/10/93 | 5.736 |
| 12/9/93 | 5.655 |
| 12/8/93 | 5.67 |
| 12/7/93 | 5.685 |
| 12/6/93 | 5.687 |
| 12/3/93 | 5.753 |
| 12/2/93 | 5.795 |
| 12/1/93 | 5.774 |
| 11/30/93 | 5.819 |
| 11/29/93 | 5.74 |
| 11/26/93 | 5.74 |
| 11/24/93 | 5.814 |
| 11/23/93 | 5.795 |
| 11/22/93 | 5.889 |
| 11/19/93 | 5.834 |
| 11/18/93 | 5.71 |
| 11/17/93 | 5.629 |
| 11/16/93 | 5.626 |
| 11/15/93 | 5.645 |
| 11/12/93 | 5.65 |
| 11/10/93 | 5.689 |
| 11/9/93 | 5.62 |
| 11/8/93 | 5.643 |
| 11/5/93 | 5.727 |
| 11/4/93 | 5.688 |
| 11/3/93 | 5.637 |
| 11/2/93 | 5.606 |
| 11/1/93 | 5.556 |
| 10/29/93 | 5.427 |
| 10/28/93 | 5.376 |
| 10/27/93 | 5.435 |
| 10/26/93 | 5.396 |
| 10/25/93 | 5.425 |
| 10/22/93 | 5.398 |
| 10/21/93 | 5.332 |
| 10/20/93 | 5.239 |
| 10/19/93 | 5.249 |
| 10/18/93 | 5.249 |
| 10/15/93 | 5.165 |
| 10/14/93 | 5.214 |
| 10/13/93 | 5.27 |
| 10/12/93 | 5.264 |
| 10/8/93 | 5.256 |
| 10/7/93 | 5.321 |
| 10/6/93 | 5.319 |
| 10/5/93 | 5.337 |
| 10/4/93 | 5.329 |
| 10/1/93 | 5.339 |
| 9/30/93 | 5.382 |
| 9/29/93 | 5.354 |
| 9/28/93 | 5.294 |
| 9/27/93 | 5.288 |
| 9/24/93 | 5.391 |
| 9/23/93 | 5.427 |
| 9/22/93 | 5.423 |
| 9/21/93 | 5.452 |
| 9/20/93 | 5.436 |
| 9/17/93 | 5.375 |
| 9/16/93 | 5.385 |
| 9/15/93 | 5.365 |
| 9/14/93 | 5.388 |
| 9/13/93 | 5.273 |
| 9/10/93 | 5.281 |
| 9/9/93 | 5.346 |
| 9/8/93 | 5.228 |
| 9/7/93 | 5.27 |
| 9/3/93 | 5.296 |
| 9/2/93 | 5.405 |
| 9/1/93 | 5.447 |
| 8/31/93 | 5.448 |
| 8/30/93 | 5.442 |
| 8/27/93 | 5.49 |
| 8/26/93 | 5.426 |
| 8/25/93 | 5.487 |
| 8/24/93 | 5.544 |
| 8/23/93 | 5.605 |
| 8/20/93 | 5.617 |
| 8/19/93 | 5.614 |
| 8/18/93 | 5.675 |
| 8/17/93 | 5.704 |
| 8/16/93 | 5.679 |
| 8/13/93 | 5.713 |
| 8/12/93 | 5.767 |
| 8/11/93 | 5.771 |
| 8/10/93 | 5.805 |
| 8/9/93 | 5.796 |
| 8/6/93 | 5.834 |
| 8/5/93 | 5.843 |
| 8/4/93 | 5.871 |
| 8/3/93 | 5.807 |
| 8/2/93 | 5.831 |
| 7/30/93 | 5.807 |
| 7/29/93 | 5.784 |
| 7/28/93 | 5.875 |
| 7/27/93 | 5.895 |
| 7/26/93 | 5.899 |
| 7/23/93 | 5.931 |
| 7/22/93 | 5.888 |
| 7/21/93 | 5.831 |
| 7/20/93 | 5.732 |
| 7/19/93 | 5.689 |
| 7/16/93 | 5.687 |
| 7/15/93 | 5.706 |
| 7/14/93 | 5.706 |
| 7/13/93 | 5.744 |
| 7/12/93 | 5.729 |
| 7/9/93 | 5.737 |
| 7/8/93 | 5.752 |
| 7/7/93 | 5.778 |
| 7/6/93 | 5.78 |
| 7/2/93 | 5.744 |
| 7/1/93 | 5.78 |
| 6/30/93 | 5.776 |
| 6/29/93 | 5.761 |
| 6/28/93 | 5.776 |
| 6/25/93 | 5.81 |
| 6/24/93 | 5.854 |
| 6/23/93 | 5.88 |
| 6/22/93 | 5.886 |
| 6/21/93 | 5.905 |
| 6/18/93 | 5.937 |
| 6/17/93 | 5.926 |
| 6/16/93 | 5.929 |
| 6/15/93 | 5.939 |
| 6/14/93 | 5.965 |
| 6/11/93 | 5.963 |
| 6/10/93 | 6.048 |
| 6/9/93 | 6.054 |
| 6/8/93 | 6.089 |
| 6/7/93 | 6.056 |
| 6/4/93 | 6.089 |
| 6/3/93 | 6.003 |
| 6/2/93 | 6.031 |
| 6/1/93 | 6.05 |
| 5/28/93 | 6.149 |
| 5/27/93 | 6.104 |
| 5/26/93 | 6.078 |
| 5/25/93 | 6.164 |
| 5/24/93 | 6.17 |
| 5/21/93 | 6.138 |
| 5/20/93 | 6.085 |
| 5/19/93 | 6.066 |
| 5/18/93 | 6.123 |
| 5/17/93 | 6.049 |
| 5/14/93 | 6.015 |
| 5/13/93 | 6.009 |
| 5/12/93 | 5.918 |
| 5/11/93 | 5.872 |
| 5/10/93 | 5.876 |
| 5/7/93 | 5.897 |
| 5/6/93 | 5.87 |
| 5/5/93 | 5.881 |
| 5/4/93 | 5.898 |
| 5/3/93 | 5.944 |
| 4/30/93 | 6.009 |
| 4/29/93 | 5.967 |
| 4/27/93 | 6.029 |
| 4/26/93 | 5.947 |
| 4/23/93 | 5.888 |
| 4/22/93 | 5.853 |
| 4/21/93 | 5.851 |
| 4/20/93 | 5.864 |
| 4/19/93 | 5.857 |
| 4/16/93 | 5.884 |
| 4/15/93 | 5.868 |
| 4/14/93 | 5.887 |
| 4/13/93 | 5.914 |
| 4/12/93 | 5.914 |
| 4/8/93 | 5.96 |
| 4/7/93 | 6.061 |
| 4/6/93 | 6.07 |
| 4/5/93 | 6.112 |
| 4/2/93 | 6.155 |
| 4/1/93 | 6.051 |
| 3/31/93 | 6.024 |
| 3/30/93 | 6.015 |
| 3/29/93 | 6.028 |
| 3/26/93 | 6.091 |
| 3/25/93 | 5.982 |
| 3/24/93 | 5.962 |
| 3/23/93 | 5.908 |
| 3/22/93 | 5.935 |
| 3/19/93 | 5.962 |
| 3/18/93 | 5.887 |
| 3/17/93 | 6.002 |
| 3/16/93 | 6.063 |
| 3/15/93 | 6.134 |
| 3/12/93 | 6.113 |
| 3/11/93 | 5.992 |
| 3/10/93 | 5.956 |
| 3/9/93 | 5.911 |
| 3/8/93 | 5.851 |
| 3/5/93 | 5.862 |
| 3/4/93 | 5.825 |
| 3/3/93 | 5.88 |
| 3/2/93 | 5.934 |
| 3/1/93 | 5.951 |
| 2/26/93 | 6.02 |
| 2/25/93 | 6.028 |
| 2/24/93 | 6.026 |
| 2/23/93 | 5.9 |
| 2/22/93 | 6.072 |
| 2/19/93 | 6.152 |
| 2/18/93 | 6.148 |
| 2/17/93 | 6.275 |
| 2/16/93 | 6.335 |
| 2/12/93 | 6.331 |
| 2/11/93 | 6.365 |
| 2/10/93 | 6.457 |
| 2/9/93 | 6.388 |
| 2/8/93 | 6.363 |
| 2/5/93 | 6.306 |
| 2/4/93 | 6.374 |
| 2/3/93 | 6.41 |
| 2/2/93 | 6.432 |
| 2/1/93 | 6.37 |
| 1/29/93 | 6.359 |
| 1/28/93 | 6.392 |
| 1/27/93 | 6.461 |
| 1/26/93 | 6.487 |
| 1/25/93 | 6.438 |
| 1/22/93 | 6.539 |
| 1/21/93 | 6.572 |
| 1/20/93 | 6.597 |
| 1/19/93 | 6.57 |
| 1/15/93 | 6.585 |
| 1/14/93 | 6.619 |
| 1/13/93 | 6.68 |
| 1/12/93 | 6.702 |
| 1/11/93 | 6.668 |
| 1/8/93 | 6.731 |
| 1/7/93 | 6.743 |
| 1/6/93 | 6.625 |
| 1/5/93 | 6.575 |
| 1/4/93 | 6.575 |
| 12/31/92 | 6.686 |
| 12/30/92 | 6.665 |
| 12/29/92 | 6.672 |
| 12/28/92 | 6.714 |
| 12/24/92 | 6.674 |
| 12/23/92 | 6.664 |
| 12/22/92 | 6.628 |
| 12/21/92 | 6.702 |
| 12/18/92 | 6.741 |
| 12/17/92 | 6.741 |
| 12/16/92 | 6.756 |
| 12/15/92 | 6.802 |
| 12/14/92 | 6.833 |
| 12/11/92 | 6.792 |
| 12/10/92 | 6.742 |
| 12/9/92 | 6.747 |
| 12/8/92 | 6.719 |
| 12/7/92 | 6.783 |
| 12/4/92 | 6.819 |
| 12/3/92 | 6.905 |
| 12/2/92 | 6.914 |
| 12/1/92 | 6.93 |
| 11/30/92 | 6.937 |
| 11/27/92 | 6.914 |
| 11/25/92 | 6.832 |
| 11/24/92 | 6.802 |
| 11/23/92 | 6.849 |
| 11/20/92 | 6.831 |
| 11/19/92 | 6.82 |
| 11/18/92 | 6.763 |
| 11/17/92 | 6.831 |
| 11/16/92 | 6.881 |
| 11/13/92 | 6.817 |
| 11/12/92 | 6.776 |
| 11/10/92 | 6.871 |
| 11/9/92 | 6.974 |
| 11/6/92 | 6.967 |
| 11/5/92 | 6.852 |
| 11/4/92 | 6.87 |
| 11/3/92 | 6.852 |
| 11/2/92 | 6.876 |
| 10/30/92 | 6.789 |
| 10/29/92 | 6.679 |
| 10/28/92 | 6.737 |
| 10/27/92 | 6.759 |
| 10/26/92 | 6.824 |
| 10/23/92 | 6.811 |
| 10/22/92 | 6.756 |
| 10/21/92 | 6.752 |
| 10/20/92 | 6.883 |
| 10/19/92 | 6.694 |
| 10/16/92 | 6.587 |
| 10/15/92 | 6.521 |
| 10/14/92 | 6.497 |
| 10/13/92 | 6.504 |
| 10/9/92 | 6.513 |
| 10/8/92 | 6.397 |
| 10/7/92 | 6.447 |
| 10/6/92 | 6.287 |
| 10/5/92 | 6.23 |
| 10/2/92 | 6.245 |
| 10/1/92 | 6.241 |
| 9/30/92 | 6.354 |
| 9/29/92 | 6.369 |
| 9/28/92 | 6.352 |
| 9/25/92 | 6.406 |
| 9/24/92 | 6.467 |
| 9/23/92 | 6.558 |
| 9/22/92 | 6.51 |
| 9/21/92 | 6.41 |
| 9/18/92 | 6.406 |
| 9/17/92 | 6.387 |
| 9/16/92 | 6.382 |
| 9/15/92 | 6.372 |
| 9/14/92 | 6.307 |
| 9/11/92 | 6.359 |
| 9/10/92 | 6.305 |
| 9/9/92 | 6.335 |
| 9/8/92 | 6.293 |
| 9/4/92 | 6.398 |
| 9/3/92 | 6.521 |
| 9/2/92 | 6.534 |
| 9/1/92 | 6.549 |
| 8/31/92 | 6.604 |
| 8/28/92 | 6.63 |
| 8/27/92 | 6.619 |
| 8/26/92 | 6.652 |
| 8/25/92 | 6.74 |
| 8/24/92 | 6.689 |
| 8/21/92 | 6.519 |
| 8/20/92 | 6.465 |
| 8/19/92 | 6.456 |
| 8/18/92 | 6.476 |
| 8/17/92 | 6.525 |
| 8/14/92 | 6.517 |
| 8/13/92 | 6.573 |
| 8/12/92 | 6.509 |
| 8/11/92 | 6.463 |
| 8/10/92 | 6.503 |
| 8/7/92 | 6.555 |
| 8/6/92 | 6.634 |
| 8/5/92 | 6.604 |
| 8/4/92 | 6.632 |
| 8/3/92 | 6.712 |
| 7/31/92 | 6.709 |
| 7/30/92 | 6.658 |
| 7/29/92 | 6.618 |
| 7/28/92 | 6.616 |
| 7/27/92 | 6.671 |
| 7/24/92 | 6.735 |
| 7/23/92 | 6.704 |
| 7/22/92 | 6.836 |
| 7/21/92 | 6.877 |
| 7/20/92 | 6.893 |
| 7/17/92 | 6.897 |
| 7/16/92 | 6.854 |
| 7/15/92 | 6.876 |
| 7/14/92 | 6.958 |
| 7/13/92 | 6.965 |
| 7/10/92 | 6.917 |
| 7/9/92 | 6.879 |
| 7/8/92 | 6.892 |
| 7/7/92 | 6.847 |
| 7/6/92 | 6.892 |
| 7/2/92 | 6.925 |
| 7/1/92 | 7.082 |
| 6/30/92 | 7.121 |
| 6/29/92 | 7.104 |
| 6/26/92 | 7.145 |
| 6/25/92 | 7.139 |
| 6/24/92 | 7.196 |
| 6/23/92 | 7.23 |
| 6/22/92 | 7.234 |
| 6/19/92 | 7.234 |
| 6/18/92 | 7.184 |
| 6/17/92 | 7.212 |
| 6/16/92 | 7.226 |
| 6/15/92 | 7.274 |
| 6/12/92 | 7.278 |
| 6/11/92 | 7.315 |
| 6/10/92 | 7.353 |
| 6/9/92 | 7.33 |
| 6/8/92 | 7.308 |
| 6/5/92 | 7.304 |
| 6/4/92 | 7.342 |
| 6/3/92 | 7.342 |
| 6/2/92 | 7.338 |
| 6/1/92 | 7.373 |
| 5/29/92 | 7.318 |
| 5/28/92 | 7.358 |
| 5/27/92 | 7.421 |
| 5/26/92 | 7.445 |
| 5/22/92 | 7.345 |
| 5/21/92 | 7.387 |
| 5/20/92 | 7.257 |
| 5/19/92 | 7.2 |
| 5/18/92 | 7.272 |
| 5/15/92 | 7.29 |
| 5/14/92 | 7.352 |
| 5/12/92 | 7.359 |
| 5/11/92 | 7.388 |
| 5/8/92 | 7.408 |
| 5/7/92 | 7.464 |
| 5/6/92 | 7.471 |
| 5/5/92 | 7.522 |
| 5/4/92 | 7.555 |
| 5/1/92 | 7.55 |
| 4/30/92 | 7.583 |
| 4/29/92 | 7.601 |
| 4/28/92 | 7.538 |
| 4/27/92 | 7.594 |
| 4/24/92 | 7.52 |
| 4/23/92 | 7.552 |
| 4/22/92 | 7.554 |
| 4/21/92 | 7.562 |
| 4/20/92 | 7.578 |
| 4/16/92 | 7.441 |
| 4/15/92 | 7.363 |
| 4/14/92 | 7.326 |
| 4/13/92 | 7.321 |
| 4/10/92 | 7.356 |
| 4/9/92 | 7.324 |
| 4/8/92 | 7.408 |
| 4/7/92 | 7.374 |
| 4/6/92 | 7.415 |
| 4/3/92 | 7.397 |
| 4/2/92 | 7.443 |
| 4/1/92 | 7.445 |
| 3/31/92 | 7.528 |
| 3/30/92 | 7.514 |
| 3/27/92 | 7.521 |
| 3/26/92 | 7.581 |
| 3/25/92 | 7.516 |
| 3/24/92 | 7.516 |
| 3/23/92 | 7.609 |
| 3/20/92 | 7.63 |
| 3/19/92 | 7.555 |
| 3/18/92 | 7.613 |
| 3/17/92 | 7.611 |
| 3/16/92 | 7.685 |
| 3/13/92 | 7.699 |
| 3/12/92 | 7.599 |
| 3/11/92 | 7.507 |
| 3/10/92 | 7.44 |
| 3/9/92 | 7.404 |
| 3/6/92 | 7.474 |
| 3/5/92 | 7.509 |
| 3/4/92 | 7.422 |
| 3/3/92 | 7.408 |
| 3/2/92 | 7.379 |
| 2/28/92 | 7.25 |
| 2/27/92 | 7.327 |
| 2/26/92 | 7.322 |
| 2/25/92 | 7.447 |
| 2/24/92 | 7.483 |
| 2/21/92 | 7.445 |
| 2/20/92 | 7.395 |
| 2/19/92 | 7.397 |
| 2/18/92 | 7.47 |
| 2/14/92 | 7.386 |
| 2/13/92 | 7.388 |
| 2/12/92 | 7.266 |
| 2/11/92 | 7.217 |
| 2/10/92 | 7.186 |
| 2/7/92 | 7.177 |
| 2/6/92 | 7.209 |
| 2/5/92 | 7.186 |
| 2/4/92 | 7.267 |
| 2/3/92 | 7.348 |
| 1/31/92 | 7.274 |
| 1/30/92 | 7.307 |
| 1/29/92 | 7.247 |
| 1/28/92 | 7.165 |
| 1/27/92 | 7.254 |
| 1/24/92 | 7.238 |
| 1/23/92 | 7.23 |
| 1/22/92 | 7.093 |
| 1/21/92 | 7.02 |
| 1/17/92 | 7.086 |
| 1/16/92 | 7.153 |
| 1/15/92 | 7.056 |
| 1/14/92 | 7.028 |
| 1/13/92 | 6.952 |
| 1/10/92 | 6.852 |
| 1/9/92 | 6.782 |
| 1/8/92 | 6.751 |
| 1/7/92 | 6.755 |
| 1/6/92 | 6.798 |
| 1/3/92 | 6.837 |
| 1/2/92 | 6.782 |
| 12/31/91 | 6.699 |
| 12/30/91 | 6.716 |
| 12/27/91 | 6.823 |
| 12/26/91 | 6.842 |
| 12/24/91 | 6.875 |
| 12/23/91 | 6.864 |
| 12/20/91 | 6.963 |
| 12/19/91 | 7.081 |
| 12/18/91 | 7.186 |
| 12/17/91 | 7.177 |
| 12/16/91 | 7.195 |
| 12/13/91 | 7.206 |
| 12/12/91 | 7.18 |
| 12/11/91 | 7.206 |
| 12/10/91 | 7.209 |
| 12/9/91 | 7.226 |
| 12/6/91 | 7.231 |
| 12/5/91 | 7.236 |
| 12/4/91 | 7.187 |
| 12/3/91 | 7.275 |
| 12/2/91 | 7.304 |
| 11/29/91 | 7.376 |
| 11/27/91 | 7.411 |
| 11/26/91 | 7.405 |
| 11/25/91 | 7.461 |
| 11/22/91 | 7.445 |
| 11/21/91 | 7.403 |
| 11/20/91 | 7.363 |
| 11/19/91 | 7.372 |
| 11/18/91 | 7.339 |
| 11/15/91 | 7.306 |
| 11/14/91 | 7.346 |
| 11/13/91 | 7.399 |
| 11/12/91 | 7.348 |
| 11/8/91 | 7.417 |
| 11/7/91 | 7.426 |
| 11/6/91 | 7.527 |
| 11/5/91 | 7.552 |
| 11/4/91 | 7.493 |
| 11/1/91 | 7.473 |
| 10/31/91 | 7.46 |
| 10/30/91 | 7.469 |
| 10/29/91 | 7.491 |
| 10/28/91 | 7.64 |
| 10/25/91 | 7.672 |
| 10/24/91 | 7.643 |
| 10/23/91 | 7.679 |
| 10/22/91 | 7.675 |
| 10/21/91 | 7.627 |
| 10/18/91 | 7.506 |
| 10/17/91 | 7.569 |
| 10/16/91 | 7.448 |
| 10/15/91 | 7.426 |
| 10/11/91 | 7.45 |
| 10/10/91 | 7.565 |
| 10/9/91 | 7.513 |
| 10/8/91 | 7.433 |
| 10/7/91 | 7.389 |
| 10/4/91 | 7.385 |
| 10/3/91 | 7.467 |
| 10/2/91 | 7.467 |
| 10/1/91 | 7.429 |
| 9/30/91 | 7.445 |
| 9/27/91 | 7.481 |
| 9/26/91 | 7.544 |
| 9/25/91 | 7.573 |
| 9/24/91 | 7.562 |
| 9/23/91 | 7.551 |
| 9/20/91 | 7.571 |
| 9/19/91 | 7.602 |
| 9/18/91 | 7.607 |
| 9/17/91 | 7.607 |
| 9/16/91 | 7.63 |
| 9/13/91 | 7.641 |
| 9/12/91 | 7.632 |
| 9/11/91 | 7.732 |
| 9/10/91 | 7.72 |
| 9/9/91 | 7.721 |
| 9/6/91 | 7.755 |
| 9/5/91 | 7.844 |
| 9/4/91 | 7.812 |
| 9/3/91 | 7.794 |
| 8/30/91 | 7.816 |
| 8/29/91 | 7.755 |
| 8/28/91 | 7.815 |
| 8/27/91 | 7.911 |
| 8/26/91 | 7.911 |
| 8/23/91 | 7.87 |
| 8/22/91 | 7.781 |
| 8/21/91 | 7.785 |
| 8/20/91 | 7.801 |
| 8/19/91 | 7.838 |
| 8/16/91 | 7.824 |
| 8/15/91 | 7.838 |
| 8/14/91 | 7.811 |
| 8/13/91 | 7.907 |
| 8/12/91 | 7.948 |
| 8/9/91 | 7.973 |
| 8/8/91 | 7.985 |
| 8/7/91 | 7.957 |
| 8/6/91 | 7.966 |
| 8/5/91 | 8.027 |
| 8/2/91 | 8.053 |
| 8/1/91 | 8.161 |
| 7/31/91 | 8.147 |
| 7/30/91 | 8.192 |
| 7/29/91 | 8.197 |
| 7/26/91 | 8.197 |
| 7/25/91 | 8.187 |
| 7/24/91 | 8.232 |
| 7/23/91 | 8.301 |
| 7/22/91 | 8.28 |
| 7/19/91 | 8.28 |
| 7/18/91 | 8.282 |
| 7/17/91 | 8.31 |
| 7/16/91 | 8.26 |
| 7/15/91 | 8.27 |
| 7/12/91 | 8.258 |
| 7/11/91 | 8.284 |
| 7/10/91 | 8.327 |
| 7/9/91 | 8.353 |
| 7/8/91 | 8.324 |
| 7/5/91 | 8.334 |
| 7/3/91 | 8.246 |
| 7/2/91 | 8.26 |
| 7/1/91 | 8.258 |
| 6/28/91 | 8.227 |
| 6/27/91 | 8.305 |
| 6/26/91 | 8.336 |
| 6/25/91 | 8.329 |
| 6/24/91 | 8.326 |
| 6/21/91 | 8.317 |
| 6/20/91 | 8.274 |
| 6/19/91 | 8.317 |
| 6/18/91 | 8.317 |
| 6/17/91 | 8.305 |
| 6/14/91 | 8.269 |
| 6/13/91 | 8.322 |
| 6/12/91 | 8.364 |
| 6/11/91 | 8.286 |
| 6/10/91 | 8.284 |
| 6/7/91 | 8.279 |
| 6/6/91 | 8.222 |
| 6/5/91 | 8.18 |
| 6/4/91 | 8.128 |
| 6/3/91 | 8.143 |
| 5/31/91 | 8.059 |
| 5/30/91 | 8.013 |
| 5/29/91 | 8.061 |
| 5/28/91 | 8.061 |
| 5/24/91 | 8.085 |
| 5/23/91 | 8.082 |
| 5/22/91 | 8.066 |
| 5/21/91 | 8.05 |
| 5/20/91 | 8.085 |
| 5/17/91 | 8.083 |
| 5/16/91 | 8.131 |
| 5/15/91 | 8.127 |
| 5/14/91 | 8.127 |
| 5/13/91 | 8.062 |
| 5/10/91 | 8.101 |
| 5/9/91 | 8.016 |
| 5/8/91 | 8.042 |
| 5/7/91 | 8.058 |
| 5/6/91 | 8.032 |
| 5/3/91 | 8.041 |
| 5/2/91 | 7.942 |
| 5/1/91 | 7.996 |
| 4/30/91 | 8.013 |
| 4/29/91 | 8.062 |
| 4/26/91 | 8.046 |
| 4/25/91 | 8.072 |
| 4/24/91 | 8.048 |
| 4/23/91 | 8.117 |
| 4/22/91 | 8.148 |
| 4/19/91 | 8.102 |
| 4/18/91 | 8.027 |
| 4/17/91 | 7.942 |
| 4/16/91 | 7.951 |
| 4/15/91 | 7.961 |
| 4/12/91 | 7.968 |
| 4/11/91 | 8.069 |
| 4/10/91 | 8.083 |
| 4/9/91 | 8.019 |
| 4/8/91 | 7.968 |
| 4/5/91 | 7.982 |
| 4/4/91 | 7.996 |
| 4/3/91 | 8.045 |
| 4/2/91 | 8.024 |
| 4/1/91 | 8.066 |
| 3/28/91 | 8.054 |
| 3/27/91 | 8.057 |
| 3/26/91 | 8.113 |
| 3/25/91 | 8.127 |
| 3/22/91 | 8.123 |
| 3/21/91 | 8.139 |
| 3/20/91 | 8.167 |
| 3/19/91 | 8.234 |
| 3/18/91 | 8.144 |
| 3/15/91 | 8.094 |
| 3/14/91 | 8.021 |
| 3/13/91 | 8.005 |
| 3/12/91 | 8.089 |
| 3/11/91 | 8.049 |
| 3/8/91 | 8.129 |
| 3/7/91 | 8.052 |
| 3/6/91 | 8.108 |
| 3/5/91 | 8.073 |
| 3/4/91 | 8.127 |
| 3/1/91 | 8.12 |
| 2/28/91 | 8.033 |
| 2/27/91 | 7.965 |
| 2/26/91 | 7.961 |
| 2/25/91 | 7.884 |
| 2/22/91 | 7.898 |
| 2/21/91 | 7.859 |
| 2/20/91 | 7.859 |
| 2/19/91 | 7.809 |
| 2/15/91 | 7.784 |
| 2/14/91 | 7.791 |
| 2/13/91 | 7.763 |
| 2/12/91 | 7.775 |
| 2/11/91 | 7.772 |
| 2/8/91 | 7.772 |
| 2/7/91 | 7.834 |
| 2/6/91 | 7.82 |
| 2/5/91 | 7.852 |
| 2/4/91 | 7.859 |
| 2/1/91 | 7.909 |
| 1/31/91 | 8.007 |
| 1/30/91 | 8.036 |
| 1/29/91 | 8.025 |
| 1/28/91 | 8.039 |
| 1/25/91 | 8.037 |
| 1/24/91 | 7.978 |
| 1/23/91 | 8.019 |
| 1/22/91 | 8.072 |
| 1/18/91 | 8.017 |
| 1/17/91 | 8.047 |
| 1/16/91 | 8.229 |
| 1/15/91 | 8.201 |
| 1/14/91 | 8.174 |
| 1/11/91 | 8.171 |
| 1/10/91 | 8.125 |
| 1/9/91 | 8.25 |
| 1/8/91 | 8.174 |
| 1/7/91 | 8.123 |
| 1/4/91 | 8.014 |
| 1/3/91 | 7.928 |
| 12/31/90 | 8.067 |
| 12/28/90 | 8.129 |
| 12/27/90 | 8.086 |
| 12/26/90 | 8.122 |
| 12/24/90 | 8.185 |
| 12/21/90 | 8.107 |
| 12/20/90 | 8.05 |
| 12/19/90 | 7.993 |
| 12/18/90 | 7.892 |
| 12/17/90 | 8.005 |
| 12/14/90 | 8.03 |
| 12/13/90 | 7.96 |
| 12/12/90 | 7.904 |
| 12/11/90 | 7.918 |
| 12/10/90 | 7.963 |
| 12/7/90 | 8.022 |
| 12/6/90 | 8.17 |
| 12/5/90 | 8.159 |
| 12/4/90 | 8.164 |
| 12/3/90 | 8.212 |
| 11/30/90 | 8.252 |
| 11/29/90 | 8.335 |
| 11/28/90 | 8.286 |
| 11/27/90 | 8.277 |
| 11/26/90 | 8.275 |
| 11/23/90 | 8.284 |
| 11/21/90 | 8.259 |
| 11/20/90 | 8.303 |
| 11/19/90 | 8.35 |
| 11/16/90 | 8.297 |
| 11/15/90 | 8.36 |
| 11/14/90 | 8.36 |
| 11/13/90 | 8.383 |
| 11/9/90 | 8.467 |
| 11/8/90 | 8.547 |
| 11/7/90 | 8.55 |
| 11/6/90 | 8.508 |
| 11/5/90 | 8.489 |
| 11/2/90 | 8.562 |
| 11/1/90 | 8.548 |
| 10/31/90 | 8.617 |
| 10/30/90 | 8.679 |
| 10/29/90 | 8.689 |
| 10/26/90 | 8.626 |
| 10/25/90 | 8.617 |
| 10/24/90 | 8.639 |
| 10/23/90 | 8.662 |
| 10/22/90 | 8.617 |
| 10/19/90 | 8.612 |
| 10/18/90 | 8.677 |
| 10/17/90 | 8.742 |
| 10/16/90 | 8.751 |
| 10/15/90 | 8.79 |
| 10/12/90 | 8.807 |
| 10/11/90 | 8.918 |
| 10/10/90 | 8.906 |
| 10/9/90 | 8.807 |
| 10/5/90 | 8.642 |
| 10/4/90 | 8.647 |
| 10/3/90 | 8.718 |
| 10/2/90 | 8.68 |
| 10/1/90 | 8.725 |
| 9/28/90 | 8.795 |
| 9/27/90 | 8.87 |
| 9/26/90 | 8.977 |
| 9/25/90 | 8.991 |
| 9/24/90 | 9.03 |
| 9/21/90 | 8.977 |
| 9/20/90 | 8.899 |
| 9/19/90 | 8.872 |
| 9/18/90 | 8.904 |
| 9/17/90 | 8.897 |
| 9/14/90 | 8.868 |
| 9/13/90 | 8.822 |
| 9/12/90 | 8.803 |
| 9/11/90 | 8.793 |
| 9/10/90 | 8.834 |
| 9/7/90 | 8.789 |
| 9/6/90 | 8.82 |
| 9/5/90 | 8.832 |
| 9/4/90 | 8.887 |
| 8/31/90 | 8.846 |
| 8/30/90 | 8.842 |
| 8/29/90 | 8.811 |
| 8/28/90 | 8.921 |
| 8/27/90 | 8.873 |
| 8/24/90 | 9.036 |
| 8/23/90 | 9.009 |
| 8/22/90 | 8.946 |
| 8/21/90 | 8.833 |
| 8/20/90 | 8.811 |
| 8/17/90 | 8.79 |
| 8/16/90 | 8.778 |
| 8/15/90 | 8.638 |
| 8/14/90 | 8.655 |
| 8/13/90 | 8.693 |
| 8/10/90 | 8.657 |
| 8/9/90 | 8.648 |
| 8/8/90 | 8.736 |
| 8/7/90 | 8.714 |
| 8/6/90 | 8.676 |
| 8/3/90 | 8.443 |
| 8/2/90 | 8.376 |
| 8/1/90 | 8.276 |
| 7/31/90 | 8.341 |
| 7/30/90 | 8.344 |
| 7/27/90 | 8.416 |
| 7/26/90 | 8.483 |
| 7/25/90 | 8.479 |
| 7/24/90 | 8.533 |
| 7/23/90 | 8.491 |
| 7/20/90 | 8.47 |
| 7/19/90 | 8.491 |
| 7/18/90 | 8.501 |
| 7/17/90 | 8.435 |
| 7/16/90 | 8.435 |
| 7/13/90 | 8.436 |
| 7/12/90 | 8.494 |
| 7/11/90 | 8.569 |
| 7/10/90 | 8.572 |
| 7/9/90 | 8.558 |
| 7/6/90 | 8.513 |
| 7/5/90 | 8.4 |
| 7/3/90 | 8.393 |
| 7/2/90 | 8.409 |
| 6/29/90 | 8.412 |
| 6/28/90 | 8.449 |
| 6/27/90 | 8.498 |
| 6/26/90 | 8.533 |
| 6/25/90 | 8.585 |
| 6/22/90 | 8.498 |
| 6/21/90 | 8.513 |
| 6/20/90 | 8.536 |
| 6/19/90 | 8.503 |
| 6/18/90 | 8.49 |
| 6/15/90 | 8.45 |
| 6/14/90 | 8.363 |
| 6/13/90 | 8.395 |
| 6/12/90 | 8.481 |
| 6/11/90 | 8.476 |
| 6/8/90 | 8.472 |
| 6/7/90 | 8.451 |
| 6/6/90 | 8.459 |
| 6/5/90 | 8.463 |
| 6/4/90 | 8.44 |
| 6/1/90 | 8.454 |
| 5/31/90 | 8.599 |
| 5/30/90 | 8.611 |
| 5/29/90 | 8.637 |
| 5/25/90 | 8.691 |
| 5/24/90 | 8.637 |
| 5/23/90 | 8.59 |
| 5/22/90 | 8.651 |
| 5/21/90 | 8.729 |
| 5/18/90 | 8.743 |
| 5/17/90 | 8.687 |
| 5/16/90 | 8.673 |
| 5/15/90 | 8.643 |
| 5/14/90 | 8.608 |
| 5/11/90 | 8.645 |
| 5/10/90 | 8.817 |
| 5/9/90 | 8.879 |
| 5/8/90 | 8.845 |
| 5/7/90 | 8.857 |
| 5/4/90 | 8.835 |
| 5/3/90 | 9.01 |
| 5/2/90 | 9.062 |
| 5/1/90 | 9.06 |
| 4/30/90 | 9.022 |
| 4/27/90 | 9.042 |
| 4/26/90 | 9.062 |
| 4/25/90 | 8.992 |
| 4/24/90 | 8.975 |
| 4/23/90 | 8.977 |
| 4/20/90 | 8.945 |
| 4/19/90 | 8.863 |
| 4/18/90 | 8.851 |
| 4/17/90 | 8.741 |
| 4/16/90 | 8.666 |
| 4/12/90 | 8.633 |
| 4/11/90 | 8.611 |
| 4/10/90 | 8.623 |
| 4/9/90 | 8.587 |
| 4/6/90 | 8.552 |
| 4/5/90 | 8.559 |
| 4/4/90 | 8.547 |
| 4/3/90 | 8.626 |
| 4/2/90 | 8.64 |
| 3/30/90 | 8.628 |
| 3/29/90 | 8.614 |
| 3/28/90 | 8.495 |
| 3/27/90 | 8.512 |
| 3/26/90 | 8.495 |
| 3/23/90 | 8.521 |
| 3/22/90 | 8.528 |
| 3/21/90 | 8.564 |
| 3/20/90 | 8.533 |
| 3/19/90 | 8.581 |
| 3/16/90 | 8.566 |
| 3/15/90 | 8.652 |
| 3/14/90 | 8.628 |
| 3/13/90 | 8.708 |
| 3/12/90 | 8.629 |
| 3/9/90 | 8.631 |
| 3/8/90 | 8.553 |
| 3/7/90 | 8.579 |
| 3/6/90 | 8.562 |
| 3/5/90 | 8.631 |
| 3/2/90 | 8.546 |
| 3/1/90 | 8.581 |
| 2/28/90 | 8.515 |
| 2/27/90 | 8.414 |
| 2/26/90 | 8.459 |
| 2/23/90 | 8.537 |
| 2/22/90 | 8.539 |
| 2/21/90 | 8.603 |
| 2/20/90 | 8.629 |
| 2/16/90 | 8.413 |
| 2/15/90 | 8.413 |
| 2/14/90 | 8.373 |
| 2/13/90 | 8.32 |
| 2/12/90 | 8.385 |
| 2/9/90 | 8.29 |
| 2/8/90 | 8.429 |
| 2/7/90 | 8.536 |
| 2/6/90 | 8.58 |
| 2/5/90 | 8.519 |
| 2/2/90 | 8.494 |
| 2/1/90 | 8.413 |
| 1/31/90 | 8.418 |
| 1/30/90 | 8.501 |
| 1/29/90 | 8.535 |
| 1/26/90 | 8.464 |
| 1/25/90 | 8.413 |
| 1/24/90 | 8.366 |
| 1/23/90 | 8.349 |
| 1/22/90 | 8.27 |
| 1/19/90 | 8.232 |
| 1/18/90 | 8.303 |
| 1/17/90 | 8.191 |
| 1/16/90 | 8.196 |
| 1/12/90 | 8.096 |
| 1/11/90 | 8.044 |
| 1/10/90 | 8.014 |
| 1/9/90 | 8.009 |
| 1/8/90 | 8.012 |
| 1/5/90 | 7.984 |
| 1/4/90 | 7.972 |
| 1/3/90 | 7.974 |
| 1/2/90 | 7.93 |